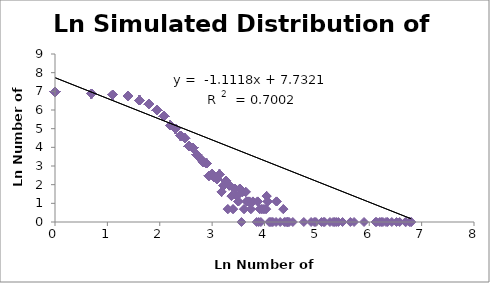
| Category | LnSimulated Number of Athletes |
|---|---|
| 6.8 | 0 |
| 6.8 | 0 |
| 6.77 | 0 |
| 6.7 | 0 |
| 6.69 | 0 |
| 6.58 | 0 |
| 6.52 | 0 |
| 6.43 | 0 |
| 6.35 | 0 |
| 6.32 | 0 |
| 6.26 | 0 |
| 6.23 | 0 |
| 6.2 | 0 |
| 6.14 | 0 |
| 6.12 | 0 |
| 5.9 | 0 |
| 5.71 | 0 |
| 5.64 | 0 |
| 5.49 | 0 |
| 5.41 | 0 |
| 5.37 | 0 |
| 5.34 | 0 |
| 5.31 | 0 |
| 5.25 | 0 |
| 5.15 | 0 |
| 5.13 | 0 |
| 5.09 | 0 |
| 4.98 | 0 |
| 4.95 | 0 |
| 4.89 | 0 |
| 4.75 | 0 |
| 4.54 | 0 |
| 4.47 | 0 |
| 4.45 | 0 |
| 4.44 | 0 |
| 4.43 | 0 |
| 4.41 | 0 |
| 4.38 | 0 |
| 4.36 | 0.69 |
| 4.36 | 0.69 |
| 4.3 | 0 |
| 4.23 | 1.1 |
| 4.23 | 1.1 |
| 4.23 | 1.1 |
| 4.22 | 0 |
| 4.16 | 0 |
| 4.14 | 0 |
| 4.11 | 0 |
| 4.09 | 0 |
| 4.06 | 1.1 |
| 4.06 | 1.1 |
| 4.06 | 1.1 |
| 4.04 | 1.39 |
| 4.04 | 1.39 |
| 4.04 | 1.39 |
| 4.04 | 1.39 |
| 4.03 | 0.69 |
| 4.03 | 0.69 |
| 3.99 | 0.69 |
| 3.99 | 0.69 |
| 3.95 | 0.69 |
| 3.95 | 0.69 |
| 3.93 | 0 |
| 3.91 | 0.69 |
| 3.91 | 0.69 |
| 3.89 | 0 |
| 3.87 | 1.1 |
| 3.87 | 1.1 |
| 3.87 | 1.1 |
| 3.85 | 0 |
| 3.78 | 1.1 |
| 3.78 | 1.1 |
| 3.78 | 1.1 |
| 3.74 | 0.69 |
| 3.74 | 0.69 |
| 3.71 | 1.1 |
| 3.71 | 1.1 |
| 3.71 | 1.1 |
| 3.69 | 1.1 |
| 3.69 | 1.1 |
| 3.69 | 1.1 |
| 3.66 | 1.1 |
| 3.66 | 1.1 |
| 3.66 | 1.1 |
| 3.64 | 1.61 |
| 3.64 | 1.61 |
| 3.64 | 1.61 |
| 3.64 | 1.61 |
| 3.64 | 1.61 |
| 3.61 | 0.69 |
| 3.61 | 0.69 |
| 3.58 | 1.61 |
| 3.58 | 1.61 |
| 3.58 | 1.61 |
| 3.58 | 1.61 |
| 3.58 | 1.61 |
| 3.56 | 0 |
| 3.53 | 1.79 |
| 3.53 | 1.79 |
| 3.53 | 1.79 |
| 3.53 | 1.79 |
| 3.53 | 1.79 |
| 3.53 | 1.79 |
| 3.5 | 1.1 |
| 3.5 | 1.1 |
| 3.5 | 1.1 |
| 3.47 | 1.39 |
| 3.47 | 1.39 |
| 3.47 | 1.39 |
| 3.47 | 1.39 |
| 3.43 | 1.79 |
| 3.43 | 1.79 |
| 3.43 | 1.79 |
| 3.43 | 1.79 |
| 3.43 | 1.79 |
| 3.43 | 1.79 |
| 3.4 | 0.69 |
| 3.4 | 0.69 |
| 3.37 | 1.39 |
| 3.37 | 1.39 |
| 3.37 | 1.39 |
| 3.37 | 1.39 |
| 3.33 | 1.95 |
| 3.33 | 1.95 |
| 3.33 | 1.95 |
| 3.33 | 1.95 |
| 3.33 | 1.95 |
| 3.33 | 1.95 |
| 3.33 | 1.95 |
| 3.3 | 0.69 |
| 3.3 | 0.69 |
| 3.26 | 2.2 |
| 3.26 | 2.2 |
| 3.26 | 2.2 |
| 3.26 | 2.2 |
| 3.26 | 2.2 |
| 3.26 | 2.2 |
| 3.26 | 2.2 |
| 3.26 | 2.2 |
| 3.26 | 2.2 |
| 3.22 | 1.95 |
| 3.22 | 1.95 |
| 3.22 | 1.95 |
| 3.22 | 1.95 |
| 3.22 | 1.95 |
| 3.22 | 1.95 |
| 3.22 | 1.95 |
| 3.18 | 1.61 |
| 3.18 | 1.61 |
| 3.18 | 1.61 |
| 3.18 | 1.61 |
| 3.18 | 1.61 |
| 3.14 | 2.56 |
| 3.14 | 2.56 |
| 3.14 | 2.56 |
| 3.14 | 2.56 |
| 3.14 | 2.56 |
| 3.14 | 2.56 |
| 3.14 | 2.56 |
| 3.14 | 2.56 |
| 3.14 | 2.56 |
| 3.14 | 2.56 |
| 3.14 | 2.56 |
| 3.14 | 2.56 |
| 3.14 | 2.56 |
| 3.09 | 2.3 |
| 3.09 | 2.3 |
| 3.09 | 2.3 |
| 3.09 | 2.3 |
| 3.09 | 2.3 |
| 3.09 | 2.3 |
| 3.09 | 2.3 |
| 3.09 | 2.3 |
| 3.09 | 2.3 |
| 3.09 | 2.3 |
| 3.04 | 2.4 |
| 3.04 | 2.4 |
| 3.04 | 2.4 |
| 3.04 | 2.4 |
| 3.04 | 2.4 |
| 3.04 | 2.4 |
| 3.04 | 2.4 |
| 3.04 | 2.4 |
| 3.04 | 2.4 |
| 3.04 | 2.4 |
| 3.04 | 2.4 |
| 3.0 | 2.56 |
| 3.0 | 2.56 |
| 3.0 | 2.56 |
| 3.0 | 2.56 |
| 3.0 | 2.56 |
| 3.0 | 2.56 |
| 3.0 | 2.56 |
| 3.0 | 2.56 |
| 3.0 | 2.56 |
| 3.0 | 2.56 |
| 3.0 | 2.56 |
| 3.0 | 2.56 |
| 3.0 | 2.56 |
| 2.94 | 2.48 |
| 2.94 | 2.48 |
| 2.94 | 2.48 |
| 2.94 | 2.48 |
| 2.94 | 2.48 |
| 2.94 | 2.48 |
| 2.94 | 2.48 |
| 2.94 | 2.48 |
| 2.94 | 2.48 |
| 2.94 | 2.48 |
| 2.94 | 2.48 |
| 2.94 | 2.48 |
| 2.89 | 3.14 |
| 2.89 | 3.14 |
| 2.89 | 3.14 |
| 2.89 | 3.14 |
| 2.89 | 3.14 |
| 2.89 | 3.14 |
| 2.89 | 3.14 |
| 2.89 | 3.14 |
| 2.89 | 3.14 |
| 2.89 | 3.14 |
| 2.89 | 3.14 |
| 2.89 | 3.14 |
| 2.89 | 3.14 |
| 2.89 | 3.14 |
| 2.89 | 3.14 |
| 2.89 | 3.14 |
| 2.89 | 3.14 |
| 2.89 | 3.14 |
| 2.89 | 3.14 |
| 2.89 | 3.14 |
| 2.89 | 3.14 |
| 2.89 | 3.14 |
| 2.89 | 3.14 |
| 2.83 | 3.22 |
| 2.83 | 3.22 |
| 2.83 | 3.22 |
| 2.83 | 3.22 |
| 2.83 | 3.22 |
| 2.83 | 3.22 |
| 2.83 | 3.22 |
| 2.83 | 3.22 |
| 2.83 | 3.22 |
| 2.83 | 3.22 |
| 2.83 | 3.22 |
| 2.83 | 3.22 |
| 2.83 | 3.22 |
| 2.83 | 3.22 |
| 2.83 | 3.22 |
| 2.83 | 3.22 |
| 2.83 | 3.22 |
| 2.83 | 3.22 |
| 2.83 | 3.22 |
| 2.83 | 3.22 |
| 2.83 | 3.22 |
| 2.83 | 3.22 |
| 2.83 | 3.22 |
| 2.83 | 3.22 |
| 2.83 | 3.22 |
| 2.77 | 3.4 |
| 2.77 | 3.4 |
| 2.77 | 3.4 |
| 2.77 | 3.4 |
| 2.77 | 3.4 |
| 2.77 | 3.4 |
| 2.77 | 3.4 |
| 2.77 | 3.4 |
| 2.77 | 3.4 |
| 2.77 | 3.4 |
| 2.77 | 3.4 |
| 2.77 | 3.4 |
| 2.77 | 3.4 |
| 2.77 | 3.4 |
| 2.77 | 3.4 |
| 2.77 | 3.4 |
| 2.77 | 3.4 |
| 2.77 | 3.4 |
| 2.77 | 3.4 |
| 2.77 | 3.4 |
| 2.77 | 3.4 |
| 2.77 | 3.4 |
| 2.77 | 3.4 |
| 2.77 | 3.4 |
| 2.77 | 3.4 |
| 2.77 | 3.4 |
| 2.77 | 3.4 |
| 2.77 | 3.4 |
| 2.77 | 3.4 |
| 2.77 | 3.4 |
| 2.71 | 3.61 |
| 2.71 | 3.61 |
| 2.71 | 3.61 |
| 2.71 | 3.61 |
| 2.71 | 3.61 |
| 2.71 | 3.61 |
| 2.71 | 3.61 |
| 2.71 | 3.61 |
| 2.71 | 3.61 |
| 2.71 | 3.61 |
| 2.71 | 3.61 |
| 2.71 | 3.61 |
| 2.71 | 3.61 |
| 2.71 | 3.61 |
| 2.71 | 3.61 |
| 2.71 | 3.61 |
| 2.71 | 3.61 |
| 2.71 | 3.61 |
| 2.71 | 3.61 |
| 2.71 | 3.61 |
| 2.71 | 3.61 |
| 2.71 | 3.61 |
| 2.71 | 3.61 |
| 2.71 | 3.61 |
| 2.71 | 3.61 |
| 2.71 | 3.61 |
| 2.71 | 3.61 |
| 2.71 | 3.61 |
| 2.71 | 3.61 |
| 2.71 | 3.61 |
| 2.71 | 3.61 |
| 2.71 | 3.61 |
| 2.71 | 3.61 |
| 2.71 | 3.61 |
| 2.71 | 3.61 |
| 2.71 | 3.61 |
| 2.71 | 3.61 |
| 2.64 | 3.97 |
| 2.64 | 3.97 |
| 2.64 | 3.97 |
| 2.64 | 3.97 |
| 2.64 | 3.97 |
| 2.64 | 3.97 |
| 2.64 | 3.97 |
| 2.64 | 3.97 |
| 2.64 | 3.97 |
| 2.64 | 3.97 |
| 2.64 | 3.97 |
| 2.64 | 3.97 |
| 2.64 | 3.97 |
| 2.64 | 3.97 |
| 2.64 | 3.97 |
| 2.64 | 3.97 |
| 2.64 | 3.97 |
| 2.64 | 3.97 |
| 2.64 | 3.97 |
| 2.64 | 3.97 |
| 2.64 | 3.97 |
| 2.64 | 3.97 |
| 2.64 | 3.97 |
| 2.64 | 3.97 |
| 2.64 | 3.97 |
| 2.64 | 3.97 |
| 2.64 | 3.97 |
| 2.64 | 3.97 |
| 2.64 | 3.97 |
| 2.64 | 3.97 |
| 2.64 | 3.97 |
| 2.64 | 3.97 |
| 2.64 | 3.97 |
| 2.64 | 3.97 |
| 2.64 | 3.97 |
| 2.64 | 3.97 |
| 2.64 | 3.97 |
| 2.64 | 3.97 |
| 2.64 | 3.97 |
| 2.64 | 3.97 |
| 2.64 | 3.97 |
| 2.64 | 3.97 |
| 2.64 | 3.97 |
| 2.64 | 3.97 |
| 2.64 | 3.97 |
| 2.64 | 3.97 |
| 2.64 | 3.97 |
| 2.64 | 3.97 |
| 2.64 | 3.97 |
| 2.64 | 3.97 |
| 2.64 | 3.97 |
| 2.64 | 3.97 |
| 2.64 | 3.97 |
| 2.56 | 4.06 |
| 2.56 | 4.06 |
| 2.56 | 4.06 |
| 2.56 | 4.06 |
| 2.56 | 4.06 |
| 2.56 | 4.06 |
| 2.56 | 4.06 |
| 2.56 | 4.06 |
| 2.56 | 4.06 |
| 2.56 | 4.06 |
| 2.56 | 4.06 |
| 2.56 | 4.06 |
| 2.56 | 4.06 |
| 2.56 | 4.06 |
| 2.56 | 4.06 |
| 2.56 | 4.06 |
| 2.56 | 4.06 |
| 2.56 | 4.06 |
| 2.56 | 4.06 |
| 2.56 | 4.06 |
| 2.56 | 4.06 |
| 2.56 | 4.06 |
| 2.56 | 4.06 |
| 2.56 | 4.06 |
| 2.56 | 4.06 |
| 2.56 | 4.06 |
| 2.56 | 4.06 |
| 2.56 | 4.06 |
| 2.56 | 4.06 |
| 2.56 | 4.06 |
| 2.56 | 4.06 |
| 2.56 | 4.06 |
| 2.56 | 4.06 |
| 2.56 | 4.06 |
| 2.56 | 4.06 |
| 2.56 | 4.06 |
| 2.56 | 4.06 |
| 2.56 | 4.06 |
| 2.56 | 4.06 |
| 2.56 | 4.06 |
| 2.56 | 4.06 |
| 2.56 | 4.06 |
| 2.56 | 4.06 |
| 2.56 | 4.06 |
| 2.56 | 4.06 |
| 2.56 | 4.06 |
| 2.56 | 4.06 |
| 2.56 | 4.06 |
| 2.56 | 4.06 |
| 2.56 | 4.06 |
| 2.56 | 4.06 |
| 2.56 | 4.06 |
| 2.56 | 4.06 |
| 2.56 | 4.06 |
| 2.56 | 4.06 |
| 2.56 | 4.06 |
| 2.56 | 4.06 |
| 2.56 | 4.06 |
| 2.48 | 4.48 |
| 2.48 | 4.48 |
| 2.48 | 4.48 |
| 2.48 | 4.48 |
| 2.48 | 4.48 |
| 2.48 | 4.48 |
| 2.48 | 4.48 |
| 2.48 | 4.48 |
| 2.48 | 4.48 |
| 2.48 | 4.48 |
| 2.48 | 4.48 |
| 2.48 | 4.48 |
| 2.48 | 4.48 |
| 2.48 | 4.48 |
| 2.48 | 4.48 |
| 2.48 | 4.48 |
| 2.48 | 4.48 |
| 2.48 | 4.48 |
| 2.48 | 4.48 |
| 2.48 | 4.48 |
| 2.48 | 4.48 |
| 2.48 | 4.48 |
| 2.48 | 4.48 |
| 2.48 | 4.48 |
| 2.48 | 4.48 |
| 2.48 | 4.48 |
| 2.48 | 4.48 |
| 2.48 | 4.48 |
| 2.48 | 4.48 |
| 2.48 | 4.48 |
| 2.48 | 4.48 |
| 2.48 | 4.48 |
| 2.48 | 4.48 |
| 2.48 | 4.48 |
| 2.48 | 4.48 |
| 2.48 | 4.48 |
| 2.48 | 4.48 |
| 2.48 | 4.48 |
| 2.48 | 4.48 |
| 2.48 | 4.48 |
| 2.48 | 4.48 |
| 2.48 | 4.48 |
| 2.48 | 4.48 |
| 2.48 | 4.48 |
| 2.48 | 4.48 |
| 2.48 | 4.48 |
| 2.48 | 4.48 |
| 2.48 | 4.48 |
| 2.48 | 4.48 |
| 2.48 | 4.48 |
| 2.48 | 4.48 |
| 2.48 | 4.48 |
| 2.48 | 4.48 |
| 2.48 | 4.48 |
| 2.48 | 4.48 |
| 2.48 | 4.48 |
| 2.48 | 4.48 |
| 2.48 | 4.48 |
| 2.48 | 4.48 |
| 2.48 | 4.48 |
| 2.48 | 4.48 |
| 2.48 | 4.48 |
| 2.48 | 4.48 |
| 2.48 | 4.48 |
| 2.48 | 4.48 |
| 2.48 | 4.48 |
| 2.48 | 4.48 |
| 2.48 | 4.48 |
| 2.48 | 4.48 |
| 2.48 | 4.48 |
| 2.48 | 4.48 |
| 2.48 | 4.48 |
| 2.48 | 4.48 |
| 2.48 | 4.48 |
| 2.48 | 4.48 |
| 2.48 | 4.48 |
| 2.48 | 4.48 |
| 2.48 | 4.48 |
| 2.48 | 4.48 |
| 2.48 | 4.48 |
| 2.48 | 4.48 |
| 2.48 | 4.48 |
| 2.48 | 4.48 |
| 2.48 | 4.48 |
| 2.48 | 4.48 |
| 2.48 | 4.48 |
| 2.48 | 4.48 |
| 2.48 | 4.48 |
| 2.4 | 4.62 |
| 2.4 | 4.62 |
| 2.4 | 4.62 |
| 2.4 | 4.62 |
| 2.4 | 4.62 |
| 2.4 | 4.62 |
| 2.4 | 4.62 |
| 2.4 | 4.62 |
| 2.4 | 4.62 |
| 2.4 | 4.62 |
| 2.4 | 4.62 |
| 2.4 | 4.62 |
| 2.4 | 4.62 |
| 2.4 | 4.62 |
| 2.4 | 4.62 |
| 2.4 | 4.62 |
| 2.4 | 4.62 |
| 2.4 | 4.62 |
| 2.4 | 4.62 |
| 2.4 | 4.62 |
| 2.4 | 4.62 |
| 2.4 | 4.62 |
| 2.4 | 4.62 |
| 2.4 | 4.62 |
| 2.4 | 4.62 |
| 2.4 | 4.62 |
| 2.4 | 4.62 |
| 2.4 | 4.62 |
| 2.4 | 4.62 |
| 2.4 | 4.62 |
| 2.4 | 4.62 |
| 2.4 | 4.62 |
| 2.4 | 4.62 |
| 2.4 | 4.62 |
| 2.4 | 4.62 |
| 2.4 | 4.62 |
| 2.4 | 4.62 |
| 2.4 | 4.62 |
| 2.4 | 4.62 |
| 2.4 | 4.62 |
| 2.4 | 4.62 |
| 2.4 | 4.62 |
| 2.4 | 4.62 |
| 2.4 | 4.62 |
| 2.4 | 4.62 |
| 2.4 | 4.62 |
| 2.4 | 4.62 |
| 2.4 | 4.62 |
| 2.4 | 4.62 |
| 2.4 | 4.62 |
| 2.4 | 4.62 |
| 2.4 | 4.62 |
| 2.4 | 4.62 |
| 2.4 | 4.62 |
| 2.4 | 4.62 |
| 2.4 | 4.62 |
| 2.4 | 4.62 |
| 2.4 | 4.62 |
| 2.4 | 4.62 |
| 2.4 | 4.62 |
| 2.4 | 4.62 |
| 2.4 | 4.62 |
| 2.4 | 4.62 |
| 2.4 | 4.62 |
| 2.4 | 4.62 |
| 2.4 | 4.62 |
| 2.4 | 4.62 |
| 2.4 | 4.62 |
| 2.4 | 4.62 |
| 2.4 | 4.62 |
| 2.4 | 4.62 |
| 2.4 | 4.62 |
| 2.4 | 4.62 |
| 2.4 | 4.62 |
| 2.4 | 4.62 |
| 2.4 | 4.62 |
| 2.4 | 4.62 |
| 2.4 | 4.62 |
| 2.4 | 4.62 |
| 2.4 | 4.62 |
| 2.4 | 4.62 |
| 2.4 | 4.62 |
| 2.4 | 4.62 |
| 2.4 | 4.62 |
| 2.4 | 4.62 |
| 2.4 | 4.62 |
| 2.4 | 4.62 |
| 2.4 | 4.62 |
| 2.4 | 4.62 |
| 2.4 | 4.62 |
| 2.4 | 4.62 |
| 2.4 | 4.62 |
| 2.4 | 4.62 |
| 2.4 | 4.62 |
| 2.4 | 4.62 |
| 2.4 | 4.62 |
| 2.4 | 4.62 |
| 2.4 | 4.62 |
| 2.4 | 4.62 |
| 2.4 | 4.62 |
| 2.4 | 4.62 |
| 2.3 | 4.99 |
| 2.3 | 4.99 |
| 2.3 | 4.99 |
| 2.3 | 4.99 |
| 2.3 | 4.99 |
| 2.3 | 4.99 |
| 2.3 | 4.99 |
| 2.3 | 4.99 |
| 2.3 | 4.99 |
| 2.3 | 4.99 |
| 2.3 | 4.99 |
| 2.3 | 4.99 |
| 2.3 | 4.99 |
| 2.3 | 4.99 |
| 2.3 | 4.99 |
| 2.3 | 4.99 |
| 2.3 | 4.99 |
| 2.3 | 4.99 |
| 2.3 | 4.99 |
| 2.3 | 4.99 |
| 2.3 | 4.99 |
| 2.3 | 4.99 |
| 2.3 | 4.99 |
| 2.3 | 4.99 |
| 2.3 | 4.99 |
| 2.3 | 4.99 |
| 2.3 | 4.99 |
| 2.3 | 4.99 |
| 2.3 | 4.99 |
| 2.3 | 4.99 |
| 2.3 | 4.99 |
| 2.3 | 4.99 |
| 2.3 | 4.99 |
| 2.3 | 4.99 |
| 2.3 | 4.99 |
| 2.3 | 4.99 |
| 2.3 | 4.99 |
| 2.3 | 4.99 |
| 2.3 | 4.99 |
| 2.3 | 4.99 |
| 2.3 | 4.99 |
| 2.3 | 4.99 |
| 2.3 | 4.99 |
| 2.3 | 4.99 |
| 2.3 | 4.99 |
| 2.3 | 4.99 |
| 2.3 | 4.99 |
| 2.3 | 4.99 |
| 2.3 | 4.99 |
| 2.3 | 4.99 |
| 2.3 | 4.99 |
| 2.3 | 4.99 |
| 2.3 | 4.99 |
| 2.3 | 4.99 |
| 2.3 | 4.99 |
| 2.3 | 4.99 |
| 2.3 | 4.99 |
| 2.3 | 4.99 |
| 2.3 | 4.99 |
| 2.3 | 4.99 |
| 2.3 | 4.99 |
| 2.3 | 4.99 |
| 2.3 | 4.99 |
| 2.3 | 4.99 |
| 2.3 | 4.99 |
| 2.3 | 4.99 |
| 2.3 | 4.99 |
| 2.3 | 4.99 |
| 2.3 | 4.99 |
| 2.3 | 4.99 |
| 2.3 | 4.99 |
| 2.3 | 4.99 |
| 2.3 | 4.99 |
| 2.3 | 4.99 |
| 2.3 | 4.99 |
| 2.3 | 4.99 |
| 2.3 | 4.99 |
| 2.3 | 4.99 |
| 2.3 | 4.99 |
| 2.3 | 4.99 |
| 2.3 | 4.99 |
| 2.3 | 4.99 |
| 2.3 | 4.99 |
| 2.3 | 4.99 |
| 2.3 | 4.99 |
| 2.3 | 4.99 |
| 2.3 | 4.99 |
| 2.3 | 4.99 |
| 2.3 | 4.99 |
| 2.3 | 4.99 |
| 2.3 | 4.99 |
| 2.3 | 4.99 |
| 2.3 | 4.99 |
| 2.3 | 4.99 |
| 2.3 | 4.99 |
| 2.3 | 4.99 |
| 2.3 | 4.99 |
| 2.3 | 4.99 |
| 2.3 | 4.99 |
| 2.3 | 4.99 |
| 2.3 | 4.99 |
| 2.3 | 4.99 |
| 2.3 | 4.99 |
| 2.3 | 4.99 |
| 2.3 | 4.99 |
| 2.3 | 4.99 |
| 2.3 | 4.99 |
| 2.3 | 4.99 |
| 2.3 | 4.99 |
| 2.3 | 4.99 |
| 2.3 | 4.99 |
| 2.3 | 4.99 |
| 2.3 | 4.99 |
| 2.3 | 4.99 |
| 2.3 | 4.99 |
| 2.3 | 4.99 |
| 2.3 | 4.99 |
| 2.3 | 4.99 |
| 2.3 | 4.99 |
| 2.3 | 4.99 |
| 2.3 | 4.99 |
| 2.3 | 4.99 |
| 2.3 | 4.99 |
| 2.3 | 4.99 |
| 2.3 | 4.99 |
| 2.3 | 4.99 |
| 2.3 | 4.99 |
| 2.3 | 4.99 |
| 2.3 | 4.99 |
| 2.3 | 4.99 |
| 2.3 | 4.99 |
| 2.3 | 4.99 |
| 2.3 | 4.99 |
| 2.3 | 4.99 |
| 2.3 | 4.99 |
| 2.3 | 4.99 |
| 2.3 | 4.99 |
| 2.3 | 4.99 |
| 2.3 | 4.99 |
| 2.3 | 4.99 |
| 2.3 | 4.99 |
| 2.3 | 4.99 |
| 2.3 | 4.99 |
| 2.3 | 4.99 |
| 2.3 | 4.99 |
| 2.3 | 4.99 |
| 2.3 | 4.99 |
| 2.2 | 5.18 |
| 2.2 | 5.18 |
| 2.2 | 5.18 |
| 2.2 | 5.18 |
| 2.2 | 5.18 |
| 2.2 | 5.18 |
| 2.2 | 5.18 |
| 2.2 | 5.18 |
| 2.2 | 5.18 |
| 2.2 | 5.18 |
| 2.2 | 5.18 |
| 2.2 | 5.18 |
| 2.2 | 5.18 |
| 2.2 | 5.18 |
| 2.2 | 5.18 |
| 2.2 | 5.18 |
| 2.2 | 5.18 |
| 2.2 | 5.18 |
| 2.2 | 5.18 |
| 2.2 | 5.18 |
| 2.2 | 5.18 |
| 2.2 | 5.18 |
| 2.2 | 5.18 |
| 2.2 | 5.18 |
| 2.2 | 5.18 |
| 2.2 | 5.18 |
| 2.2 | 5.18 |
| 2.2 | 5.18 |
| 2.2 | 5.18 |
| 2.2 | 5.18 |
| 2.2 | 5.18 |
| 2.2 | 5.18 |
| 2.2 | 5.18 |
| 2.2 | 5.18 |
| 2.2 | 5.18 |
| 2.2 | 5.18 |
| 2.2 | 5.18 |
| 2.2 | 5.18 |
| 2.2 | 5.18 |
| 2.2 | 5.18 |
| 2.2 | 5.18 |
| 2.2 | 5.18 |
| 2.2 | 5.18 |
| 2.2 | 5.18 |
| 2.2 | 5.18 |
| 2.2 | 5.18 |
| 2.2 | 5.18 |
| 2.2 | 5.18 |
| 2.2 | 5.18 |
| 2.2 | 5.18 |
| 2.2 | 5.18 |
| 2.2 | 5.18 |
| 2.2 | 5.18 |
| 2.2 | 5.18 |
| 2.2 | 5.18 |
| 2.2 | 5.18 |
| 2.2 | 5.18 |
| 2.2 | 5.18 |
| 2.2 | 5.18 |
| 2.2 | 5.18 |
| 2.2 | 5.18 |
| 2.2 | 5.18 |
| 2.2 | 5.18 |
| 2.2 | 5.18 |
| 2.2 | 5.18 |
| 2.2 | 5.18 |
| 2.2 | 5.18 |
| 2.2 | 5.18 |
| 2.2 | 5.18 |
| 2.2 | 5.18 |
| 2.2 | 5.18 |
| 2.2 | 5.18 |
| 2.2 | 5.18 |
| 2.2 | 5.18 |
| 2.2 | 5.18 |
| 2.2 | 5.18 |
| 2.2 | 5.18 |
| 2.2 | 5.18 |
| 2.2 | 5.18 |
| 2.2 | 5.18 |
| 2.2 | 5.18 |
| 2.2 | 5.18 |
| 2.2 | 5.18 |
| 2.2 | 5.18 |
| 2.2 | 5.18 |
| 2.2 | 5.18 |
| 2.2 | 5.18 |
| 2.2 | 5.18 |
| 2.2 | 5.18 |
| 2.2 | 5.18 |
| 2.2 | 5.18 |
| 2.2 | 5.18 |
| 2.2 | 5.18 |
| 2.2 | 5.18 |
| 2.2 | 5.18 |
| 2.2 | 5.18 |
| 2.2 | 5.18 |
| 2.2 | 5.18 |
| 2.2 | 5.18 |
| 2.2 | 5.18 |
| 2.2 | 5.18 |
| 2.2 | 5.18 |
| 2.2 | 5.18 |
| 2.2 | 5.18 |
| 2.2 | 5.18 |
| 2.2 | 5.18 |
| 2.2 | 5.18 |
| 2.2 | 5.18 |
| 2.2 | 5.18 |
| 2.2 | 5.18 |
| 2.2 | 5.18 |
| 2.2 | 5.18 |
| 2.2 | 5.18 |
| 2.2 | 5.18 |
| 2.2 | 5.18 |
| 2.2 | 5.18 |
| 2.2 | 5.18 |
| 2.2 | 5.18 |
| 2.2 | 5.18 |
| 2.2 | 5.18 |
| 2.2 | 5.18 |
| 2.2 | 5.18 |
| 2.2 | 5.18 |
| 2.2 | 5.18 |
| 2.2 | 5.18 |
| 2.2 | 5.18 |
| 2.2 | 5.18 |
| 2.2 | 5.18 |
| 2.2 | 5.18 |
| 2.2 | 5.18 |
| 2.2 | 5.18 |
| 2.2 | 5.18 |
| 2.2 | 5.18 |
| 2.2 | 5.18 |
| 2.2 | 5.18 |
| 2.2 | 5.18 |
| 2.2 | 5.18 |
| 2.2 | 5.18 |
| 2.2 | 5.18 |
| 2.2 | 5.18 |
| 2.2 | 5.18 |
| 2.2 | 5.18 |
| 2.2 | 5.18 |
| 2.2 | 5.18 |
| 2.2 | 5.18 |
| 2.2 | 5.18 |
| 2.2 | 5.18 |
| 2.2 | 5.18 |
| 2.2 | 5.18 |
| 2.2 | 5.18 |
| 2.2 | 5.18 |
| 2.2 | 5.18 |
| 2.2 | 5.18 |
| 2.2 | 5.18 |
| 2.2 | 5.18 |
| 2.2 | 5.18 |
| 2.2 | 5.18 |
| 2.2 | 5.18 |
| 2.2 | 5.18 |
| 2.2 | 5.18 |
| 2.2 | 5.18 |
| 2.2 | 5.18 |
| 2.2 | 5.18 |
| 2.2 | 5.18 |
| 2.2 | 5.18 |
| 2.2 | 5.18 |
| 2.2 | 5.18 |
| 2.2 | 5.18 |
| 2.2 | 5.18 |
| 2.2 | 5.18 |
| 2.2 | 5.18 |
| 2.2 | 5.18 |
| 2.2 | 5.18 |
| 2.2 | 5.18 |
| 2.2 | 5.18 |
| 2.2 | 5.18 |
| 2.2 | 5.18 |
| 2.08 | 5.66 |
| 2.08 | 5.66 |
| 2.08 | 5.66 |
| 2.08 | 5.66 |
| 2.08 | 5.66 |
| 2.08 | 5.66 |
| 2.08 | 5.66 |
| 2.08 | 5.66 |
| 2.08 | 5.66 |
| 2.08 | 5.66 |
| 2.08 | 5.66 |
| 2.08 | 5.66 |
| 2.08 | 5.66 |
| 2.08 | 5.66 |
| 2.08 | 5.66 |
| 2.08 | 5.66 |
| 2.08 | 5.66 |
| 2.08 | 5.66 |
| 2.08 | 5.66 |
| 2.08 | 5.66 |
| 2.08 | 5.66 |
| 2.08 | 5.66 |
| 2.08 | 5.66 |
| 2.08 | 5.66 |
| 2.08 | 5.66 |
| 2.08 | 5.66 |
| 2.08 | 5.66 |
| 2.08 | 5.66 |
| 2.08 | 5.66 |
| 2.08 | 5.66 |
| 2.08 | 5.66 |
| 2.08 | 5.66 |
| 2.08 | 5.66 |
| 2.08 | 5.66 |
| 2.08 | 5.66 |
| 2.08 | 5.66 |
| 2.08 | 5.66 |
| 2.08 | 5.66 |
| 2.08 | 5.66 |
| 2.08 | 5.66 |
| 2.08 | 5.66 |
| 2.08 | 5.66 |
| 2.08 | 5.66 |
| 2.08 | 5.66 |
| 2.08 | 5.66 |
| 2.08 | 5.66 |
| 2.08 | 5.66 |
| 2.08 | 5.66 |
| 2.08 | 5.66 |
| 2.08 | 5.66 |
| 2.08 | 5.66 |
| 2.08 | 5.66 |
| 2.08 | 5.66 |
| 2.08 | 5.66 |
| 2.08 | 5.66 |
| 2.08 | 5.66 |
| 2.08 | 5.66 |
| 2.08 | 5.66 |
| 2.08 | 5.66 |
| 2.08 | 5.66 |
| 2.08 | 5.66 |
| 2.08 | 5.66 |
| 2.08 | 5.66 |
| 2.08 | 5.66 |
| 2.08 | 5.66 |
| 2.08 | 5.66 |
| 2.08 | 5.66 |
| 2.08 | 5.66 |
| 2.08 | 5.66 |
| 2.08 | 5.66 |
| 2.08 | 5.66 |
| 2.08 | 5.66 |
| 2.08 | 5.66 |
| 2.08 | 5.66 |
| 2.08 | 5.66 |
| 2.08 | 5.66 |
| 2.08 | 5.66 |
| 2.08 | 5.66 |
| 2.08 | 5.66 |
| 2.08 | 5.66 |
| 2.08 | 5.66 |
| 2.08 | 5.66 |
| 2.08 | 5.66 |
| 2.08 | 5.66 |
| 2.08 | 5.66 |
| 2.08 | 5.66 |
| 2.08 | 5.66 |
| 2.08 | 5.66 |
| 2.08 | 5.66 |
| 2.08 | 5.66 |
| 2.08 | 5.66 |
| 2.08 | 5.66 |
| 2.08 | 5.66 |
| 2.08 | 5.66 |
| 2.08 | 5.66 |
| 2.08 | 5.66 |
| 2.08 | 5.66 |
| 2.08 | 5.66 |
| 2.08 | 5.66 |
| 2.08 | 5.66 |
| 2.08 | 5.66 |
| 2.08 | 5.66 |
| 2.08 | 5.66 |
| 2.08 | 5.66 |
| 2.08 | 5.66 |
| 2.08 | 5.66 |
| 2.08 | 5.66 |
| 2.08 | 5.66 |
| 2.08 | 5.66 |
| 2.08 | 5.66 |
| 2.08 | 5.66 |
| 2.08 | 5.66 |
| 2.08 | 5.66 |
| 2.08 | 5.66 |
| 2.08 | 5.66 |
| 2.08 | 5.66 |
| 2.08 | 5.66 |
| 2.08 | 5.66 |
| 2.08 | 5.66 |
| 2.08 | 5.66 |
| 2.08 | 5.66 |
| 2.08 | 5.66 |
| 2.08 | 5.66 |
| 2.08 | 5.66 |
| 2.08 | 5.66 |
| 2.08 | 5.66 |
| 2.08 | 5.66 |
| 2.08 | 5.66 |
| 2.08 | 5.66 |
| 2.08 | 5.66 |
| 2.08 | 5.66 |
| 2.08 | 5.66 |
| 2.08 | 5.66 |
| 2.08 | 5.66 |
| 2.08 | 5.66 |
| 2.08 | 5.66 |
| 2.08 | 5.66 |
| 2.08 | 5.66 |
| 2.08 | 5.66 |
| 2.08 | 5.66 |
| 2.08 | 5.66 |
| 2.08 | 5.66 |
| 2.08 | 5.66 |
| 2.08 | 5.66 |
| 2.08 | 5.66 |
| 2.08 | 5.66 |
| 2.08 | 5.66 |
| 2.08 | 5.66 |
| 2.08 | 5.66 |
| 2.08 | 5.66 |
| 2.08 | 5.66 |
| 2.08 | 5.66 |
| 2.08 | 5.66 |
| 2.08 | 5.66 |
| 2.08 | 5.66 |
| 2.08 | 5.66 |
| 2.08 | 5.66 |
| 2.08 | 5.66 |
| 2.08 | 5.66 |
| 2.08 | 5.66 |
| 2.08 | 5.66 |
| 2.08 | 5.66 |
| 2.08 | 5.66 |
| 2.08 | 5.66 |
| 2.08 | 5.66 |
| 2.08 | 5.66 |
| 2.08 | 5.66 |
| 2.08 | 5.66 |
| 2.08 | 5.66 |
| 2.08 | 5.66 |
| 2.08 | 5.66 |
| 2.08 | 5.66 |
| 2.08 | 5.66 |
| 2.08 | 5.66 |
| 2.08 | 5.66 |
| 2.08 | 5.66 |
| 2.08 | 5.66 |
| 2.08 | 5.66 |
| 2.08 | 5.66 |
| 2.08 | 5.66 |
| 2.08 | 5.66 |
| 2.08 | 5.66 |
| 2.08 | 5.66 |
| 2.08 | 5.66 |
| 2.08 | 5.66 |
| 2.08 | 5.66 |
| 2.08 | 5.66 |
| 2.08 | 5.66 |
| 2.08 | 5.66 |
| 2.08 | 5.66 |
| 2.08 | 5.66 |
| 2.08 | 5.66 |
| 2.08 | 5.66 |
| 2.08 | 5.66 |
| 2.08 | 5.66 |
| 2.08 | 5.66 |
| 2.08 | 5.66 |
| 2.08 | 5.66 |
| 2.08 | 5.66 |
| 2.08 | 5.66 |
| 2.08 | 5.66 |
| 2.08 | 5.66 |
| 2.08 | 5.66 |
| 2.08 | 5.66 |
| 2.08 | 5.66 |
| 2.08 | 5.66 |
| 2.08 | 5.66 |
| 2.08 | 5.66 |
| 2.08 | 5.66 |
| 2.08 | 5.66 |
| 2.08 | 5.66 |
| 2.08 | 5.66 |
| 2.08 | 5.66 |
| 2.08 | 5.66 |
| 2.08 | 5.66 |
| 2.08 | 5.66 |
| 2.08 | 5.66 |
| 2.08 | 5.66 |
| 2.08 | 5.66 |
| 2.08 | 5.66 |
| 2.08 | 5.66 |
| 2.08 | 5.66 |
| 2.08 | 5.66 |
| 2.08 | 5.66 |
| 2.08 | 5.66 |
| 2.08 | 5.66 |
| 2.08 | 5.66 |
| 2.08 | 5.66 |
| 2.08 | 5.66 |
| 2.08 | 5.66 |
| 2.08 | 5.66 |
| 2.08 | 5.66 |
| 2.08 | 5.66 |
| 2.08 | 5.66 |
| 2.08 | 5.66 |
| 2.08 | 5.66 |
| 2.08 | 5.66 |
| 2.08 | 5.66 |
| 2.08 | 5.66 |
| 2.08 | 5.66 |
| 2.08 | 5.66 |
| 2.08 | 5.66 |
| 2.08 | 5.66 |
| 2.08 | 5.66 |
| 2.08 | 5.66 |
| 2.08 | 5.66 |
| 2.08 | 5.66 |
| 2.08 | 5.66 |
| 2.08 | 5.66 |
| 2.08 | 5.66 |
| 2.08 | 5.66 |
| 2.08 | 5.66 |
| 2.08 | 5.66 |
| 2.08 | 5.66 |
| 2.08 | 5.66 |
| 2.08 | 5.66 |
| 2.08 | 5.66 |
| 2.08 | 5.66 |
| 2.08 | 5.66 |
| 2.08 | 5.66 |
| 2.08 | 5.66 |
| 2.08 | 5.66 |
| 2.08 | 5.66 |
| 2.08 | 5.66 |
| 2.08 | 5.66 |
| 2.08 | 5.66 |
| 2.08 | 5.66 |
| 2.08 | 5.66 |
| 2.08 | 5.66 |
| 2.08 | 5.66 |
| 2.08 | 5.66 |
| 2.08 | 5.66 |
| 2.08 | 5.66 |
| 2.08 | 5.66 |
| 2.08 | 5.66 |
| 2.08 | 5.66 |
| 2.08 | 5.66 |
| 2.08 | 5.66 |
| 2.08 | 5.66 |
| 2.08 | 5.66 |
| 2.08 | 5.66 |
| 2.08 | 5.66 |
| 2.08 | 5.66 |
| 2.08 | 5.66 |
| 2.08 | 5.66 |
| 2.08 | 5.66 |
| 2.08 | 5.66 |
| 2.08 | 5.66 |
| 1.95 | 5.99 |
| 1.95 | 5.99 |
| 1.95 | 5.99 |
| 1.95 | 5.99 |
| 1.95 | 5.99 |
| 1.95 | 5.99 |
| 1.95 | 5.99 |
| 1.95 | 5.99 |
| 1.95 | 5.99 |
| 1.95 | 5.99 |
| 1.95 | 5.99 |
| 1.95 | 5.99 |
| 1.95 | 5.99 |
| 1.95 | 5.99 |
| 1.95 | 5.99 |
| 1.95 | 5.99 |
| 1.95 | 5.99 |
| 1.95 | 5.99 |
| 1.95 | 5.99 |
| 1.95 | 5.99 |
| 1.95 | 5.99 |
| 1.95 | 5.99 |
| 1.95 | 5.99 |
| 1.95 | 5.99 |
| 1.95 | 5.99 |
| 1.95 | 5.99 |
| 1.95 | 5.99 |
| 1.95 | 5.99 |
| 1.95 | 5.99 |
| 1.95 | 5.99 |
| 1.95 | 5.99 |
| 1.95 | 5.99 |
| 1.95 | 5.99 |
| 1.95 | 5.99 |
| 1.95 | 5.99 |
| 1.95 | 5.99 |
| 1.95 | 5.99 |
| 1.95 | 5.99 |
| 1.95 | 5.99 |
| 1.95 | 5.99 |
| 1.95 | 5.99 |
| 1.95 | 5.99 |
| 1.95 | 5.99 |
| 1.95 | 5.99 |
| 1.95 | 5.99 |
| 1.95 | 5.99 |
| 1.95 | 5.99 |
| 1.95 | 5.99 |
| 1.95 | 5.99 |
| 1.95 | 5.99 |
| 1.95 | 5.99 |
| 1.95 | 5.99 |
| 1.95 | 5.99 |
| 1.95 | 5.99 |
| 1.95 | 5.99 |
| 1.95 | 5.99 |
| 1.95 | 5.99 |
| 1.95 | 5.99 |
| 1.95 | 5.99 |
| 1.95 | 5.99 |
| 1.95 | 5.99 |
| 1.95 | 5.99 |
| 1.95 | 5.99 |
| 1.95 | 5.99 |
| 1.95 | 5.99 |
| 1.95 | 5.99 |
| 1.95 | 5.99 |
| 1.95 | 5.99 |
| 1.95 | 5.99 |
| 1.95 | 5.99 |
| 1.95 | 5.99 |
| 1.95 | 5.99 |
| 1.95 | 5.99 |
| 1.95 | 5.99 |
| 1.95 | 5.99 |
| 1.95 | 5.99 |
| 1.95 | 5.99 |
| 1.95 | 5.99 |
| 1.95 | 5.99 |
| 1.95 | 5.99 |
| 1.95 | 5.99 |
| 1.95 | 5.99 |
| 1.95 | 5.99 |
| 1.95 | 5.99 |
| 1.95 | 5.99 |
| 1.95 | 5.99 |
| 1.95 | 5.99 |
| 1.95 | 5.99 |
| 1.95 | 5.99 |
| 1.95 | 5.99 |
| 1.95 | 5.99 |
| 1.95 | 5.99 |
| 1.95 | 5.99 |
| 1.95 | 5.99 |
| 1.95 | 5.99 |
| 1.95 | 5.99 |
| 1.95 | 5.99 |
| 1.95 | 5.99 |
| 1.95 | 5.99 |
| 1.95 | 5.99 |
| 1.95 | 5.99 |
| 1.95 | 5.99 |
| 1.95 | 5.99 |
| 1.95 | 5.99 |
| 1.95 | 5.99 |
| 1.95 | 5.99 |
| 1.95 | 5.99 |
| 1.95 | 5.99 |
| 1.95 | 5.99 |
| 1.95 | 5.99 |
| 1.95 | 5.99 |
| 1.95 | 5.99 |
| 1.95 | 5.99 |
| 1.95 | 5.99 |
| 1.95 | 5.99 |
| 1.95 | 5.99 |
| 1.95 | 5.99 |
| 1.95 | 5.99 |
| 1.95 | 5.99 |
| 1.95 | 5.99 |
| 1.95 | 5.99 |
| 1.95 | 5.99 |
| 1.95 | 5.99 |
| 1.95 | 5.99 |
| 1.95 | 5.99 |
| 1.95 | 5.99 |
| 1.95 | 5.99 |
| 1.95 | 5.99 |
| 1.95 | 5.99 |
| 1.95 | 5.99 |
| 1.95 | 5.99 |
| 1.95 | 5.99 |
| 1.95 | 5.99 |
| 1.95 | 5.99 |
| 1.95 | 5.99 |
| 1.95 | 5.99 |
| 1.95 | 5.99 |
| 1.95 | 5.99 |
| 1.95 | 5.99 |
| 1.95 | 5.99 |
| 1.95 | 5.99 |
| 1.95 | 5.99 |
| 1.95 | 5.99 |
| 1.95 | 5.99 |
| 1.95 | 5.99 |
| 1.95 | 5.99 |
| 1.95 | 5.99 |
| 1.95 | 5.99 |
| 1.95 | 5.99 |
| 1.95 | 5.99 |
| 1.95 | 5.99 |
| 1.95 | 5.99 |
| 1.95 | 5.99 |
| 1.95 | 5.99 |
| 1.95 | 5.99 |
| 1.95 | 5.99 |
| 1.95 | 5.99 |
| 1.95 | 5.99 |
| 1.95 | 5.99 |
| 1.95 | 5.99 |
| 1.95 | 5.99 |
| 1.95 | 5.99 |
| 1.95 | 5.99 |
| 1.95 | 5.99 |
| 1.95 | 5.99 |
| 1.95 | 5.99 |
| 1.95 | 5.99 |
| 1.95 | 5.99 |
| 1.95 | 5.99 |
| 1.95 | 5.99 |
| 1.95 | 5.99 |
| 1.95 | 5.99 |
| 1.95 | 5.99 |
| 1.95 | 5.99 |
| 1.95 | 5.99 |
| 1.95 | 5.99 |
| 1.95 | 5.99 |
| 1.95 | 5.99 |
| 1.95 | 5.99 |
| 1.95 | 5.99 |
| 1.95 | 5.99 |
| 1.95 | 5.99 |
| 1.95 | 5.99 |
| 1.95 | 5.99 |
| 1.95 | 5.99 |
| 1.95 | 5.99 |
| 1.95 | 5.99 |
| 1.95 | 5.99 |
| 1.95 | 5.99 |
| 1.95 | 5.99 |
| 1.95 | 5.99 |
| 1.95 | 5.99 |
| 1.95 | 5.99 |
| 1.95 | 5.99 |
| 1.95 | 5.99 |
| 1.95 | 5.99 |
| 1.95 | 5.99 |
| 1.95 | 5.99 |
| 1.95 | 5.99 |
| 1.95 | 5.99 |
| 1.95 | 5.99 |
| 1.95 | 5.99 |
| 1.95 | 5.99 |
| 1.95 | 5.99 |
| 1.95 | 5.99 |
| 1.95 | 5.99 |
| 1.95 | 5.99 |
| 1.95 | 5.99 |
| 1.95 | 5.99 |
| 1.95 | 5.99 |
| 1.95 | 5.99 |
| 1.95 | 5.99 |
| 1.95 | 5.99 |
| 1.95 | 5.99 |
| 1.95 | 5.99 |
| 1.95 | 5.99 |
| 1.95 | 5.99 |
| 1.95 | 5.99 |
| 1.95 | 5.99 |
| 1.95 | 5.99 |
| 1.95 | 5.99 |
| 1.95 | 5.99 |
| 1.95 | 5.99 |
| 1.95 | 5.99 |
| 1.95 | 5.99 |
| 1.95 | 5.99 |
| 1.95 | 5.99 |
| 1.95 | 5.99 |
| 1.95 | 5.99 |
| 1.95 | 5.99 |
| 1.95 | 5.99 |
| 1.95 | 5.99 |
| 1.95 | 5.99 |
| 1.95 | 5.99 |
| 1.95 | 5.99 |
| 1.95 | 5.99 |
| 1.95 | 5.99 |
| 1.95 | 5.99 |
| 1.95 | 5.99 |
| 1.95 | 5.99 |
| 1.95 | 5.99 |
| 1.95 | 5.99 |
| 1.95 | 5.99 |
| 1.95 | 5.99 |
| 1.95 | 5.99 |
| 1.95 | 5.99 |
| 1.95 | 5.99 |
| 1.95 | 5.99 |
| 1.95 | 5.99 |
| 1.95 | 5.99 |
| 1.95 | 5.99 |
| 1.95 | 5.99 |
| 1.95 | 5.99 |
| 1.95 | 5.99 |
| 1.95 | 5.99 |
| 1.95 | 5.99 |
| 1.95 | 5.99 |
| 1.95 | 5.99 |
| 1.95 | 5.99 |
| 1.95 | 5.99 |
| 1.95 | 5.99 |
| 1.95 | 5.99 |
| 1.95 | 5.99 |
| 1.95 | 5.99 |
| 1.95 | 5.99 |
| 1.95 | 5.99 |
| 1.95 | 5.99 |
| 1.95 | 5.99 |
| 1.95 | 5.99 |
| 1.95 | 5.99 |
| 1.95 | 5.99 |
| 1.95 | 5.99 |
| 1.95 | 5.99 |
| 1.95 | 5.99 |
| 1.95 | 5.99 |
| 1.95 | 5.99 |
| 1.95 | 5.99 |
| 1.95 | 5.99 |
| 1.95 | 5.99 |
| 1.95 | 5.99 |
| 1.95 | 5.99 |
| 1.95 | 5.99 |
| 1.95 | 5.99 |
| 1.95 | 5.99 |
| 1.95 | 5.99 |
| 1.95 | 5.99 |
| 1.95 | 5.99 |
| 1.95 | 5.99 |
| 1.95 | 5.99 |
| 1.95 | 5.99 |
| 1.95 | 5.99 |
| 1.95 | 5.99 |
| 1.95 | 5.99 |
| 1.95 | 5.99 |
| 1.95 | 5.99 |
| 1.95 | 5.99 |
| 1.95 | 5.99 |
| 1.95 | 5.99 |
| 1.95 | 5.99 |
| 1.95 | 5.99 |
| 1.95 | 5.99 |
| 1.95 | 5.99 |
| 1.95 | 5.99 |
| 1.95 | 5.99 |
| 1.95 | 5.99 |
| 1.95 | 5.99 |
| 1.95 | 5.99 |
| 1.95 | 5.99 |
| 1.95 | 5.99 |
| 1.95 | 5.99 |
| 1.95 | 5.99 |
| 1.95 | 5.99 |
| 1.95 | 5.99 |
| 1.95 | 5.99 |
| 1.95 | 5.99 |
| 1.95 | 5.99 |
| 1.95 | 5.99 |
| 1.95 | 5.99 |
| 1.95 | 5.99 |
| 1.95 | 5.99 |
| 1.95 | 5.99 |
| 1.95 | 5.99 |
| 1.95 | 5.99 |
| 1.95 | 5.99 |
| 1.95 | 5.99 |
| 1.95 | 5.99 |
| 1.95 | 5.99 |
| 1.95 | 5.99 |
| 1.95 | 5.99 |
| 1.95 | 5.99 |
| 1.95 | 5.99 |
| 1.95 | 5.99 |
| 1.95 | 5.99 |
| 1.95 | 5.99 |
| 1.95 | 5.99 |
| 1.95 | 5.99 |
| 1.95 | 5.99 |
| 1.95 | 5.99 |
| 1.95 | 5.99 |
| 1.95 | 5.99 |
| 1.95 | 5.99 |
| 1.95 | 5.99 |
| 1.95 | 5.99 |
| 1.95 | 5.99 |
| 1.95 | 5.99 |
| 1.95 | 5.99 |
| 1.95 | 5.99 |
| 1.95 | 5.99 |
| 1.95 | 5.99 |
| 1.95 | 5.99 |
| 1.95 | 5.99 |
| 1.95 | 5.99 |
| 1.95 | 5.99 |
| 1.95 | 5.99 |
| 1.95 | 5.99 |
| 1.95 | 5.99 |
| 1.95 | 5.99 |
| 1.95 | 5.99 |
| 1.95 | 5.99 |
| 1.95 | 5.99 |
| 1.95 | 5.99 |
| 1.95 | 5.99 |
| 1.95 | 5.99 |
| 1.95 | 5.99 |
| 1.95 | 5.99 |
| 1.95 | 5.99 |
| 1.95 | 5.99 |
| 1.95 | 5.99 |
| 1.95 | 5.99 |
| 1.95 | 5.99 |
| 1.95 | 5.99 |
| 1.95 | 5.99 |
| 1.95 | 5.99 |
| 1.95 | 5.99 |
| 1.95 | 5.99 |
| 1.95 | 5.99 |
| 1.95 | 5.99 |
| 1.95 | 5.99 |
| 1.95 | 5.99 |
| 1.95 | 5.99 |
| 1.95 | 5.99 |
| 1.95 | 5.99 |
| 1.95 | 5.99 |
| 1.95 | 5.99 |
| 1.95 | 5.99 |
| 1.95 | 5.99 |
| 1.95 | 5.99 |
| 1.95 | 5.99 |
| 1.95 | 5.99 |
| 1.95 | 5.99 |
| 1.95 | 5.99 |
| 1.95 | 5.99 |
| 1.95 | 5.99 |
| 1.95 | 5.99 |
| 1.95 | 5.99 |
| 1.95 | 5.99 |
| 1.95 | 5.99 |
| 1.95 | 5.99 |
| 1.79 | 6.32 |
| 1.79 | 6.32 |
| 1.79 | 6.32 |
| 1.79 | 6.32 |
| 1.79 | 6.32 |
| 1.79 | 6.32 |
| 1.79 | 6.32 |
| 1.79 | 6.32 |
| 1.79 | 6.32 |
| 1.79 | 6.32 |
| 1.79 | 6.32 |
| 1.79 | 6.32 |
| 1.79 | 6.32 |
| 1.79 | 6.32 |
| 1.79 | 6.32 |
| 1.79 | 6.32 |
| 1.79 | 6.32 |
| 1.79 | 6.32 |
| 1.79 | 6.32 |
| 1.79 | 6.32 |
| 1.79 | 6.32 |
| 1.79 | 6.32 |
| 1.79 | 6.32 |
| 1.79 | 6.32 |
| 1.79 | 6.32 |
| 1.79 | 6.32 |
| 1.79 | 6.32 |
| 1.79 | 6.32 |
| 1.79 | 6.32 |
| 1.79 | 6.32 |
| 1.79 | 6.32 |
| 1.79 | 6.32 |
| 1.79 | 6.32 |
| 1.79 | 6.32 |
| 1.79 | 6.32 |
| 1.79 | 6.32 |
| 1.79 | 6.32 |
| 1.79 | 6.32 |
| 1.79 | 6.32 |
| 1.79 | 6.32 |
| 1.79 | 6.32 |
| 1.79 | 6.32 |
| 1.79 | 6.32 |
| 1.79 | 6.32 |
| 1.79 | 6.32 |
| 1.79 | 6.32 |
| 1.79 | 6.32 |
| 1.79 | 6.32 |
| 1.79 | 6.32 |
| 1.79 | 6.32 |
| 1.79 | 6.32 |
| 1.79 | 6.32 |
| 1.79 | 6.32 |
| 1.79 | 6.32 |
| 1.79 | 6.32 |
| 1.79 | 6.32 |
| 1.79 | 6.32 |
| 1.79 | 6.32 |
| 1.79 | 6.32 |
| 1.79 | 6.32 |
| 1.79 | 6.32 |
| 1.79 | 6.32 |
| 1.79 | 6.32 |
| 1.79 | 6.32 |
| 1.79 | 6.32 |
| 1.79 | 6.32 |
| 1.79 | 6.32 |
| 1.79 | 6.32 |
| 1.79 | 6.32 |
| 1.79 | 6.32 |
| 1.79 | 6.32 |
| 1.79 | 6.32 |
| 1.79 | 6.32 |
| 1.79 | 6.32 |
| 1.79 | 6.32 |
| 1.79 | 6.32 |
| 1.79 | 6.32 |
| 1.79 | 6.32 |
| 1.79 | 6.32 |
| 1.79 | 6.32 |
| 1.79 | 6.32 |
| 1.79 | 6.32 |
| 1.79 | 6.32 |
| 1.79 | 6.32 |
| 1.79 | 6.32 |
| 1.79 | 6.32 |
| 1.79 | 6.32 |
| 1.79 | 6.32 |
| 1.79 | 6.32 |
| 1.79 | 6.32 |
| 1.79 | 6.32 |
| 1.79 | 6.32 |
| 1.79 | 6.32 |
| 1.79 | 6.32 |
| 1.79 | 6.32 |
| 1.79 | 6.32 |
| 1.79 | 6.32 |
| 1.79 | 6.32 |
| 1.79 | 6.32 |
| 1.79 | 6.32 |
| 1.79 | 6.32 |
| 1.79 | 6.32 |
| 1.79 | 6.32 |
| 1.79 | 6.32 |
| 1.79 | 6.32 |
| 1.79 | 6.32 |
| 1.79 | 6.32 |
| 1.79 | 6.32 |
| 1.79 | 6.32 |
| 1.79 | 6.32 |
| 1.79 | 6.32 |
| 1.79 | 6.32 |
| 1.79 | 6.32 |
| 1.79 | 6.32 |
| 1.79 | 6.32 |
| 1.79 | 6.32 |
| 1.79 | 6.32 |
| 1.79 | 6.32 |
| 1.79 | 6.32 |
| 1.79 | 6.32 |
| 1.79 | 6.32 |
| 1.79 | 6.32 |
| 1.79 | 6.32 |
| 1.79 | 6.32 |
| 1.79 | 6.32 |
| 1.79 | 6.32 |
| 1.79 | 6.32 |
| 1.79 | 6.32 |
| 1.79 | 6.32 |
| 1.79 | 6.32 |
| 1.79 | 6.32 |
| 1.79 | 6.32 |
| 1.79 | 6.32 |
| 1.79 | 6.32 |
| 1.79 | 6.32 |
| 1.79 | 6.32 |
| 1.79 | 6.32 |
| 1.79 | 6.32 |
| 1.79 | 6.32 |
| 1.79 | 6.32 |
| 1.79 | 6.32 |
| 1.79 | 6.32 |
| 1.79 | 6.32 |
| 1.79 | 6.32 |
| 1.79 | 6.32 |
| 1.79 | 6.32 |
| 1.79 | 6.32 |
| 1.79 | 6.32 |
| 1.79 | 6.32 |
| 1.79 | 6.32 |
| 1.79 | 6.32 |
| 1.79 | 6.32 |
| 1.79 | 6.32 |
| 1.79 | 6.32 |
| 1.79 | 6.32 |
| 1.79 | 6.32 |
| 1.79 | 6.32 |
| 1.79 | 6.32 |
| 1.79 | 6.32 |
| 1.79 | 6.32 |
| 1.79 | 6.32 |
| 1.79 | 6.32 |
| 1.79 | 6.32 |
| 1.79 | 6.32 |
| 1.79 | 6.32 |
| 1.79 | 6.32 |
| 1.79 | 6.32 |
| 1.79 | 6.32 |
| 1.79 | 6.32 |
| 1.79 | 6.32 |
| 1.79 | 6.32 |
| 1.79 | 6.32 |
| 1.79 | 6.32 |
| 1.79 | 6.32 |
| 1.79 | 6.32 |
| 1.79 | 6.32 |
| 1.79 | 6.32 |
| 1.79 | 6.32 |
| 1.79 | 6.32 |
| 1.79 | 6.32 |
| 1.79 | 6.32 |
| 1.79 | 6.32 |
| 1.79 | 6.32 |
| 1.79 | 6.32 |
| 1.79 | 6.32 |
| 1.79 | 6.32 |
| 1.79 | 6.32 |
| 1.79 | 6.32 |
| 1.79 | 6.32 |
| 1.79 | 6.32 |
| 1.79 | 6.32 |
| 1.79 | 6.32 |
| 1.79 | 6.32 |
| 1.79 | 6.32 |
| 1.79 | 6.32 |
| 1.79 | 6.32 |
| 1.79 | 6.32 |
| 1.79 | 6.32 |
| 1.79 | 6.32 |
| 1.79 | 6.32 |
| 1.79 | 6.32 |
| 1.79 | 6.32 |
| 1.79 | 6.32 |
| 1.79 | 6.32 |
| 1.79 | 6.32 |
| 1.79 | 6.32 |
| 1.79 | 6.32 |
| 1.79 | 6.32 |
| 1.79 | 6.32 |
| 1.79 | 6.32 |
| 1.79 | 6.32 |
| 1.79 | 6.32 |
| 1.79 | 6.32 |
| 1.79 | 6.32 |
| 1.79 | 6.32 |
| 1.79 | 6.32 |
| 1.79 | 6.32 |
| 1.79 | 6.32 |
| 1.79 | 6.32 |
| 1.79 | 6.32 |
| 1.79 | 6.32 |
| 1.79 | 6.32 |
| 1.79 | 6.32 |
| 1.79 | 6.32 |
| 1.79 | 6.32 |
| 1.79 | 6.32 |
| 1.79 | 6.32 |
| 1.79 | 6.32 |
| 1.79 | 6.32 |
| 1.79 | 6.32 |
| 1.79 | 6.32 |
| 1.79 | 6.32 |
| 1.79 | 6.32 |
| 1.79 | 6.32 |
| 1.79 | 6.32 |
| 1.79 | 6.32 |
| 1.79 | 6.32 |
| 1.79 | 6.32 |
| 1.79 | 6.32 |
| 1.79 | 6.32 |
| 1.79 | 6.32 |
| 1.79 | 6.32 |
| 1.79 | 6.32 |
| 1.79 | 6.32 |
| 1.79 | 6.32 |
| 1.79 | 6.32 |
| 1.79 | 6.32 |
| 1.79 | 6.32 |
| 1.79 | 6.32 |
| 1.79 | 6.32 |
| 1.79 | 6.32 |
| 1.79 | 6.32 |
| 1.79 | 6.32 |
| 1.79 | 6.32 |
| 1.79 | 6.32 |
| 1.79 | 6.32 |
| 1.79 | 6.32 |
| 1.79 | 6.32 |
| 1.79 | 6.32 |
| 1.79 | 6.32 |
| 1.79 | 6.32 |
| 1.79 | 6.32 |
| 1.79 | 6.32 |
| 1.79 | 6.32 |
| 1.79 | 6.32 |
| 1.79 | 6.32 |
| 1.79 | 6.32 |
| 1.79 | 6.32 |
| 1.79 | 6.32 |
| 1.79 | 6.32 |
| 1.79 | 6.32 |
| 1.79 | 6.32 |
| 1.79 | 6.32 |
| 1.79 | 6.32 |
| 1.79 | 6.32 |
| 1.79 | 6.32 |
| 1.79 | 6.32 |
| 1.79 | 6.32 |
| 1.79 | 6.32 |
| 1.79 | 6.32 |
| 1.79 | 6.32 |
| 1.79 | 6.32 |
| 1.79 | 6.32 |
| 1.79 | 6.32 |
| 1.79 | 6.32 |
| 1.79 | 6.32 |
| 1.79 | 6.32 |
| 1.79 | 6.32 |
| 1.79 | 6.32 |
| 1.79 | 6.32 |
| 1.79 | 6.32 |
| 1.79 | 6.32 |
| 1.79 | 6.32 |
| 1.79 | 6.32 |
| 1.79 | 6.32 |
| 1.79 | 6.32 |
| 1.79 | 6.32 |
| 1.79 | 6.32 |
| 1.79 | 6.32 |
| 1.79 | 6.32 |
| 1.79 | 6.32 |
| 1.79 | 6.32 |
| 1.79 | 6.32 |
| 1.79 | 6.32 |
| 1.79 | 6.32 |
| 1.79 | 6.32 |
| 1.79 | 6.32 |
| 1.79 | 6.32 |
| 1.79 | 6.32 |
| 1.79 | 6.32 |
| 1.79 | 6.32 |
| 1.79 | 6.32 |
| 1.79 | 6.32 |
| 1.79 | 6.32 |
| 1.79 | 6.32 |
| 1.79 | 6.32 |
| 1.79 | 6.32 |
| 1.79 | 6.32 |
| 1.79 | 6.32 |
| 1.79 | 6.32 |
| 1.79 | 6.32 |
| 1.79 | 6.32 |
| 1.79 | 6.32 |
| 1.79 | 6.32 |
| 1.79 | 6.32 |
| 1.79 | 6.32 |
| 1.79 | 6.32 |
| 1.79 | 6.32 |
| 1.79 | 6.32 |
| 1.79 | 6.32 |
| 1.79 | 6.32 |
| 1.79 | 6.32 |
| 1.79 | 6.32 |
| 1.79 | 6.32 |
| 1.79 | 6.32 |
| 1.79 | 6.32 |
| 1.79 | 6.32 |
| 1.79 | 6.32 |
| 1.79 | 6.32 |
| 1.79 | 6.32 |
| 1.79 | 6.32 |
| 1.79 | 6.32 |
| 1.79 | 6.32 |
| 1.79 | 6.32 |
| 1.79 | 6.32 |
| 1.79 | 6.32 |
| 1.79 | 6.32 |
| 1.79 | 6.32 |
| 1.79 | 6.32 |
| 1.79 | 6.32 |
| 1.79 | 6.32 |
| 1.79 | 6.32 |
| 1.79 | 6.32 |
| 1.79 | 6.32 |
| 1.79 | 6.32 |
| 1.79 | 6.32 |
| 1.79 | 6.32 |
| 1.79 | 6.32 |
| 1.79 | 6.32 |
| 1.79 | 6.32 |
| 1.79 | 6.32 |
| 1.79 | 6.32 |
| 1.79 | 6.32 |
| 1.79 | 6.32 |
| 1.79 | 6.32 |
| 1.79 | 6.32 |
| 1.79 | 6.32 |
| 1.79 | 6.32 |
| 1.79 | 6.32 |
| 1.79 | 6.32 |
| 1.79 | 6.32 |
| 1.79 | 6.32 |
| 1.79 | 6.32 |
| 1.79 | 6.32 |
| 1.79 | 6.32 |
| 1.79 | 6.32 |
| 1.79 | 6.32 |
| 1.79 | 6.32 |
| 1.79 | 6.32 |
| 1.79 | 6.32 |
| 1.79 | 6.32 |
| 1.79 | 6.32 |
| 1.79 | 6.32 |
| 1.79 | 6.32 |
| 1.79 | 6.32 |
| 1.79 | 6.32 |
| 1.79 | 6.32 |
| 1.79 | 6.32 |
| 1.79 | 6.32 |
| 1.79 | 6.32 |
| 1.79 | 6.32 |
| 1.79 | 6.32 |
| 1.79 | 6.32 |
| 1.79 | 6.32 |
| 1.79 | 6.32 |
| 1.79 | 6.32 |
| 1.79 | 6.32 |
| 1.79 | 6.32 |
| 1.79 | 6.32 |
| 1.79 | 6.32 |
| 1.79 | 6.32 |
| 1.79 | 6.32 |
| 1.79 | 6.32 |
| 1.79 | 6.32 |
| 1.79 | 6.32 |
| 1.79 | 6.32 |
| 1.79 | 6.32 |
| 1.79 | 6.32 |
| 1.79 | 6.32 |
| 1.79 | 6.32 |
| 1.79 | 6.32 |
| 1.79 | 6.32 |
| 1.79 | 6.32 |
| 1.79 | 6.32 |
| 1.79 | 6.32 |
| 1.79 | 6.32 |
| 1.79 | 6.32 |
| 1.79 | 6.32 |
| 1.79 | 6.32 |
| 1.79 | 6.32 |
| 1.79 | 6.32 |
| 1.79 | 6.32 |
| 1.79 | 6.32 |
| 1.79 | 6.32 |
| 1.79 | 6.32 |
| 1.79 | 6.32 |
| 1.79 | 6.32 |
| 1.79 | 6.32 |
| 1.79 | 6.32 |
| 1.79 | 6.32 |
| 1.79 | 6.32 |
| 1.79 | 6.32 |
| 1.79 | 6.32 |
| 1.79 | 6.32 |
| 1.79 | 6.32 |
| 1.79 | 6.32 |
| 1.79 | 6.32 |
| 1.79 | 6.32 |
| 1.79 | 6.32 |
| 1.79 | 6.32 |
| 1.79 | 6.32 |
| 1.79 | 6.32 |
| 1.79 | 6.32 |
| 1.79 | 6.32 |
| 1.79 | 6.32 |
| 1.79 | 6.32 |
| 1.79 | 6.32 |
| 1.79 | 6.32 |
| 1.79 | 6.32 |
| 1.79 | 6.32 |
| 1.79 | 6.32 |
| 1.79 | 6.32 |
| 1.79 | 6.32 |
| 1.79 | 6.32 |
| 1.79 | 6.32 |
| 1.79 | 6.32 |
| 1.79 | 6.32 |
| 1.79 | 6.32 |
| 1.79 | 6.32 |
| 1.79 | 6.32 |
| 1.79 | 6.32 |
| 1.79 | 6.32 |
| 1.79 | 6.32 |
| 1.79 | 6.32 |
| 1.79 | 6.32 |
| 1.79 | 6.32 |
| 1.79 | 6.32 |
| 1.79 | 6.32 |
| 1.79 | 6.32 |
| 1.79 | 6.32 |
| 1.79 | 6.32 |
| 1.79 | 6.32 |
| 1.79 | 6.32 |
| 1.79 | 6.32 |
| 1.79 | 6.32 |
| 1.79 | 6.32 |
| 1.79 | 6.32 |
| 1.79 | 6.32 |
| 1.79 | 6.32 |
| 1.79 | 6.32 |
| 1.79 | 6.32 |
| 1.79 | 6.32 |
| 1.79 | 6.32 |
| 1.79 | 6.32 |
| 1.79 | 6.32 |
| 1.79 | 6.32 |
| 1.79 | 6.32 |
| 1.79 | 6.32 |
| 1.79 | 6.32 |
| 1.79 | 6.32 |
| 1.79 | 6.32 |
| 1.79 | 6.32 |
| 1.79 | 6.32 |
| 1.79 | 6.32 |
| 1.79 | 6.32 |
| 1.79 | 6.32 |
| 1.79 | 6.32 |
| 1.79 | 6.32 |
| 1.79 | 6.32 |
| 1.79 | 6.32 |
| 1.79 | 6.32 |
| 1.79 | 6.32 |
| 1.79 | 6.32 |
| 1.79 | 6.32 |
| 1.79 | 6.32 |
| 1.79 | 6.32 |
| 1.79 | 6.32 |
| 1.79 | 6.32 |
| 1.79 | 6.32 |
| 1.79 | 6.32 |
| 1.79 | 6.32 |
| 1.79 | 6.32 |
| 1.79 | 6.32 |
| 1.79 | 6.32 |
| 1.79 | 6.32 |
| 1.79 | 6.32 |
| 1.79 | 6.32 |
| 1.79 | 6.32 |
| 1.79 | 6.32 |
| 1.79 | 6.32 |
| 1.79 | 6.32 |
| 1.79 | 6.32 |
| 1.79 | 6.32 |
| 1.79 | 6.32 |
| 1.79 | 6.32 |
| 1.79 | 6.32 |
| 1.79 | 6.32 |
| 1.79 | 6.32 |
| 1.79 | 6.32 |
| 1.79 | 6.32 |
| 1.79 | 6.32 |
| 1.79 | 6.32 |
| 1.79 | 6.32 |
| 1.79 | 6.32 |
| 1.79 | 6.32 |
| 1.79 | 6.32 |
| 1.79 | 6.32 |
| 1.79 | 6.32 |
| 1.79 | 6.32 |
| 1.79 | 6.32 |
| 1.79 | 6.32 |
| 1.79 | 6.32 |
| 1.79 | 6.32 |
| 1.79 | 6.32 |
| 1.79 | 6.32 |
| 1.79 | 6.32 |
| 1.79 | 6.32 |
| 1.79 | 6.32 |
| 1.79 | 6.32 |
| 1.79 | 6.32 |
| 1.79 | 6.32 |
| 1.79 | 6.32 |
| 1.79 | 6.32 |
| 1.79 | 6.32 |
| 1.79 | 6.32 |
| 1.79 | 6.32 |
| 1.61 | 6.52 |
| 1.61 | 6.52 |
| 1.61 | 6.52 |
| 1.61 | 6.52 |
| 1.61 | 6.52 |
| 1.61 | 6.52 |
| 1.61 | 6.52 |
| 1.61 | 6.52 |
| 1.61 | 6.52 |
| 1.61 | 6.52 |
| 1.61 | 6.52 |
| 1.61 | 6.52 |
| 1.61 | 6.52 |
| 1.61 | 6.52 |
| 1.61 | 6.52 |
| 1.61 | 6.52 |
| 1.61 | 6.52 |
| 1.61 | 6.52 |
| 1.61 | 6.52 |
| 1.61 | 6.52 |
| 1.61 | 6.52 |
| 1.61 | 6.52 |
| 1.61 | 6.52 |
| 1.61 | 6.52 |
| 1.61 | 6.52 |
| 1.61 | 6.52 |
| 1.61 | 6.52 |
| 1.61 | 6.52 |
| 1.61 | 6.52 |
| 1.61 | 6.52 |
| 1.61 | 6.52 |
| 1.61 | 6.52 |
| 1.61 | 6.52 |
| 1.61 | 6.52 |
| 1.61 | 6.52 |
| 1.61 | 6.52 |
| 1.61 | 6.52 |
| 1.61 | 6.52 |
| 1.61 | 6.52 |
| 1.61 | 6.52 |
| 1.61 | 6.52 |
| 1.61 | 6.52 |
| 1.61 | 6.52 |
| 1.61 | 6.52 |
| 1.61 | 6.52 |
| 1.61 | 6.52 |
| 1.61 | 6.52 |
| 1.61 | 6.52 |
| 1.61 | 6.52 |
| 1.61 | 6.52 |
| 1.61 | 6.52 |
| 1.61 | 6.52 |
| 1.61 | 6.52 |
| 1.61 | 6.52 |
| 1.61 | 6.52 |
| 1.61 | 6.52 |
| 1.61 | 6.52 |
| 1.61 | 6.52 |
| 1.61 | 6.52 |
| 1.61 | 6.52 |
| 1.61 | 6.52 |
| 1.61 | 6.52 |
| 1.61 | 6.52 |
| 1.61 | 6.52 |
| 1.61 | 6.52 |
| 1.61 | 6.52 |
| 1.61 | 6.52 |
| 1.61 | 6.52 |
| 1.61 | 6.52 |
| 1.61 | 6.52 |
| 1.61 | 6.52 |
| 1.61 | 6.52 |
| 1.61 | 6.52 |
| 1.61 | 6.52 |
| 1.61 | 6.52 |
| 1.61 | 6.52 |
| 1.61 | 6.52 |
| 1.61 | 6.52 |
| 1.61 | 6.52 |
| 1.61 | 6.52 |
| 1.61 | 6.52 |
| 1.61 | 6.52 |
| 1.61 | 6.52 |
| 1.61 | 6.52 |
| 1.61 | 6.52 |
| 1.61 | 6.52 |
| 1.61 | 6.52 |
| 1.61 | 6.52 |
| 1.61 | 6.52 |
| 1.61 | 6.52 |
| 1.61 | 6.52 |
| 1.61 | 6.52 |
| 1.61 | 6.52 |
| 1.61 | 6.52 |
| 1.61 | 6.52 |
| 1.61 | 6.52 |
| 1.61 | 6.52 |
| 1.61 | 6.52 |
| 1.61 | 6.52 |
| 1.61 | 6.52 |
| 1.61 | 6.52 |
| 1.61 | 6.52 |
| 1.61 | 6.52 |
| 1.61 | 6.52 |
| 1.61 | 6.52 |
| 1.61 | 6.52 |
| 1.61 | 6.52 |
| 1.61 | 6.52 |
| 1.61 | 6.52 |
| 1.61 | 6.52 |
| 1.61 | 6.52 |
| 1.61 | 6.52 |
| 1.61 | 6.52 |
| 1.61 | 6.52 |
| 1.61 | 6.52 |
| 1.61 | 6.52 |
| 1.61 | 6.52 |
| 1.61 | 6.52 |
| 1.61 | 6.52 |
| 1.61 | 6.52 |
| 1.61 | 6.52 |
| 1.61 | 6.52 |
| 1.61 | 6.52 |
| 1.61 | 6.52 |
| 1.61 | 6.52 |
| 1.61 | 6.52 |
| 1.61 | 6.52 |
| 1.61 | 6.52 |
| 1.61 | 6.52 |
| 1.61 | 6.52 |
| 1.61 | 6.52 |
| 1.61 | 6.52 |
| 1.61 | 6.52 |
| 1.61 | 6.52 |
| 1.61 | 6.52 |
| 1.61 | 6.52 |
| 1.61 | 6.52 |
| 1.61 | 6.52 |
| 1.61 | 6.52 |
| 1.61 | 6.52 |
| 1.61 | 6.52 |
| 1.61 | 6.52 |
| 1.61 | 6.52 |
| 1.61 | 6.52 |
| 1.61 | 6.52 |
| 1.61 | 6.52 |
| 1.61 | 6.52 |
| 1.61 | 6.52 |
| 1.61 | 6.52 |
| 1.61 | 6.52 |
| 1.61 | 6.52 |
| 1.61 | 6.52 |
| 1.61 | 6.52 |
| 1.61 | 6.52 |
| 1.61 | 6.52 |
| 1.61 | 6.52 |
| 1.61 | 6.52 |
| 1.61 | 6.52 |
| 1.61 | 6.52 |
| 1.61 | 6.52 |
| 1.61 | 6.52 |
| 1.61 | 6.52 |
| 1.61 | 6.52 |
| 1.61 | 6.52 |
| 1.61 | 6.52 |
| 1.61 | 6.52 |
| 1.61 | 6.52 |
| 1.61 | 6.52 |
| 1.61 | 6.52 |
| 1.61 | 6.52 |
| 1.61 | 6.52 |
| 1.61 | 6.52 |
| 1.61 | 6.52 |
| 1.61 | 6.52 |
| 1.61 | 6.52 |
| 1.61 | 6.52 |
| 1.61 | 6.52 |
| 1.61 | 6.52 |
| 1.61 | 6.52 |
| 1.61 | 6.52 |
| 1.61 | 6.52 |
| 1.61 | 6.52 |
| 1.61 | 6.52 |
| 1.61 | 6.52 |
| 1.61 | 6.52 |
| 1.61 | 6.52 |
| 1.61 | 6.52 |
| 1.61 | 6.52 |
| 1.61 | 6.52 |
| 1.61 | 6.52 |
| 1.61 | 6.52 |
| 1.61 | 6.52 |
| 1.61 | 6.52 |
| 1.61 | 6.52 |
| 1.61 | 6.52 |
| 1.61 | 6.52 |
| 1.61 | 6.52 |
| 1.61 | 6.52 |
| 1.61 | 6.52 |
| 1.61 | 6.52 |
| 1.61 | 6.52 |
| 1.61 | 6.52 |
| 1.61 | 6.52 |
| 1.61 | 6.52 |
| 1.61 | 6.52 |
| 1.61 | 6.52 |
| 1.61 | 6.52 |
| 1.61 | 6.52 |
| 1.61 | 6.52 |
| 1.61 | 6.52 |
| 1.61 | 6.52 |
| 1.61 | 6.52 |
| 1.61 | 6.52 |
| 1.61 | 6.52 |
| 1.61 | 6.52 |
| 1.61 | 6.52 |
| 1.61 | 6.52 |
| 1.61 | 6.52 |
| 1.61 | 6.52 |
| 1.61 | 6.52 |
| 1.61 | 6.52 |
| 1.61 | 6.52 |
| 1.61 | 6.52 |
| 1.61 | 6.52 |
| 1.61 | 6.52 |
| 1.61 | 6.52 |
| 1.61 | 6.52 |
| 1.61 | 6.52 |
| 1.61 | 6.52 |
| 1.61 | 6.52 |
| 1.61 | 6.52 |
| 1.61 | 6.52 |
| 1.61 | 6.52 |
| 1.61 | 6.52 |
| 1.61 | 6.52 |
| 1.61 | 6.52 |
| 1.61 | 6.52 |
| 1.61 | 6.52 |
| 1.61 | 6.52 |
| 1.61 | 6.52 |
| 1.61 | 6.52 |
| 1.61 | 6.52 |
| 1.61 | 6.52 |
| 1.61 | 6.52 |
| 1.61 | 6.52 |
| 1.61 | 6.52 |
| 1.61 | 6.52 |
| 1.61 | 6.52 |
| 1.61 | 6.52 |
| 1.61 | 6.52 |
| 1.61 | 6.52 |
| 1.61 | 6.52 |
| 1.61 | 6.52 |
| 1.61 | 6.52 |
| 1.61 | 6.52 |
| 1.61 | 6.52 |
| 1.61 | 6.52 |
| 1.61 | 6.52 |
| 1.61 | 6.52 |
| 1.61 | 6.52 |
| 1.61 | 6.52 |
| 1.61 | 6.52 |
| 1.61 | 6.52 |
| 1.61 | 6.52 |
| 1.61 | 6.52 |
| 1.61 | 6.52 |
| 1.61 | 6.52 |
| 1.61 | 6.52 |
| 1.61 | 6.52 |
| 1.61 | 6.52 |
| 1.61 | 6.52 |
| 1.61 | 6.52 |
| 1.61 | 6.52 |
| 1.61 | 6.52 |
| 1.61 | 6.52 |
| 1.61 | 6.52 |
| 1.61 | 6.52 |
| 1.61 | 6.52 |
| 1.61 | 6.52 |
| 1.61 | 6.52 |
| 1.61 | 6.52 |
| 1.61 | 6.52 |
| 1.61 | 6.52 |
| 1.61 | 6.52 |
| 1.61 | 6.52 |
| 1.61 | 6.52 |
| 1.61 | 6.52 |
| 1.61 | 6.52 |
| 1.61 | 6.52 |
| 1.61 | 6.52 |
| 1.61 | 6.52 |
| 1.61 | 6.52 |
| 1.61 | 6.52 |
| 1.61 | 6.52 |
| 1.61 | 6.52 |
| 1.61 | 6.52 |
| 1.61 | 6.52 |
| 1.61 | 6.52 |
| 1.61 | 6.52 |
| 1.61 | 6.52 |
| 1.61 | 6.52 |
| 1.61 | 6.52 |
| 1.61 | 6.52 |
| 1.61 | 6.52 |
| 1.61 | 6.52 |
| 1.61 | 6.52 |
| 1.61 | 6.52 |
| 1.61 | 6.52 |
| 1.61 | 6.52 |
| 1.61 | 6.52 |
| 1.61 | 6.52 |
| 1.61 | 6.52 |
| 1.61 | 6.52 |
| 1.61 | 6.52 |
| 1.61 | 6.52 |
| 1.61 | 6.52 |
| 1.61 | 6.52 |
| 1.61 | 6.52 |
| 1.61 | 6.52 |
| 1.61 | 6.52 |
| 1.61 | 6.52 |
| 1.61 | 6.52 |
| 1.61 | 6.52 |
| 1.61 | 6.52 |
| 1.61 | 6.52 |
| 1.61 | 6.52 |
| 1.61 | 6.52 |
| 1.61 | 6.52 |
| 1.61 | 6.52 |
| 1.61 | 6.52 |
| 1.61 | 6.52 |
| 1.61 | 6.52 |
| 1.61 | 6.52 |
| 1.61 | 6.52 |
| 1.61 | 6.52 |
| 1.61 | 6.52 |
| 1.61 | 6.52 |
| 1.61 | 6.52 |
| 1.61 | 6.52 |
| 1.61 | 6.52 |
| 1.61 | 6.52 |
| 1.61 | 6.52 |
| 1.61 | 6.52 |
| 1.61 | 6.52 |
| 1.61 | 6.52 |
| 1.61 | 6.52 |
| 1.61 | 6.52 |
| 1.61 | 6.52 |
| 1.61 | 6.52 |
| 1.61 | 6.52 |
| 1.61 | 6.52 |
| 1.61 | 6.52 |
| 1.61 | 6.52 |
| 1.61 | 6.52 |
| 1.61 | 6.52 |
| 1.61 | 6.52 |
| 1.61 | 6.52 |
| 1.61 | 6.52 |
| 1.61 | 6.52 |
| 1.61 | 6.52 |
| 1.61 | 6.52 |
| 1.61 | 6.52 |
| 1.61 | 6.52 |
| 1.61 | 6.52 |
| 1.61 | 6.52 |
| 1.61 | 6.52 |
| 1.61 | 6.52 |
| 1.61 | 6.52 |
| 1.61 | 6.52 |
| 1.61 | 6.52 |
| 1.61 | 6.52 |
| 1.61 | 6.52 |
| 1.61 | 6.52 |
| 1.61 | 6.52 |
| 1.61 | 6.52 |
| 1.61 | 6.52 |
| 1.61 | 6.52 |
| 1.61 | 6.52 |
| 1.61 | 6.52 |
| 1.61 | 6.52 |
| 1.61 | 6.52 |
| 1.61 | 6.52 |
| 1.61 | 6.52 |
| 1.61 | 6.52 |
| 1.61 | 6.52 |
| 1.61 | 6.52 |
| 1.61 | 6.52 |
| 1.61 | 6.52 |
| 1.61 | 6.52 |
| 1.61 | 6.52 |
| 1.61 | 6.52 |
| 1.61 | 6.52 |
| 1.61 | 6.52 |
| 1.61 | 6.52 |
| 1.61 | 6.52 |
| 1.61 | 6.52 |
| 1.61 | 6.52 |
| 1.61 | 6.52 |
| 1.61 | 6.52 |
| 1.61 | 6.52 |
| 1.61 | 6.52 |
| 1.61 | 6.52 |
| 1.61 | 6.52 |
| 1.61 | 6.52 |
| 1.61 | 6.52 |
| 1.61 | 6.52 |
| 1.61 | 6.52 |
| 1.61 | 6.52 |
| 1.61 | 6.52 |
| 1.61 | 6.52 |
| 1.61 | 6.52 |
| 1.61 | 6.52 |
| 1.61 | 6.52 |
| 1.61 | 6.52 |
| 1.61 | 6.52 |
| 1.61 | 6.52 |
| 1.61 | 6.52 |
| 1.61 | 6.52 |
| 1.61 | 6.52 |
| 1.61 | 6.52 |
| 1.61 | 6.52 |
| 1.61 | 6.52 |
| 1.61 | 6.52 |
| 1.61 | 6.52 |
| 1.61 | 6.52 |
| 1.61 | 6.52 |
| 1.61 | 6.52 |
| 1.61 | 6.52 |
| 1.61 | 6.52 |
| 1.61 | 6.52 |
| 1.61 | 6.52 |
| 1.61 | 6.52 |
| 1.61 | 6.52 |
| 1.61 | 6.52 |
| 1.61 | 6.52 |
| 1.61 | 6.52 |
| 1.61 | 6.52 |
| 1.61 | 6.52 |
| 1.61 | 6.52 |
| 1.61 | 6.52 |
| 1.61 | 6.52 |
| 1.61 | 6.52 |
| 1.61 | 6.52 |
| 1.61 | 6.52 |
| 1.61 | 6.52 |
| 1.61 | 6.52 |
| 1.61 | 6.52 |
| 1.61 | 6.52 |
| 1.61 | 6.52 |
| 1.61 | 6.52 |
| 1.61 | 6.52 |
| 1.61 | 6.52 |
| 1.61 | 6.52 |
| 1.61 | 6.52 |
| 1.61 | 6.52 |
| 1.61 | 6.52 |
| 1.61 | 6.52 |
| 1.61 | 6.52 |
| 1.61 | 6.52 |
| 1.61 | 6.52 |
| 1.61 | 6.52 |
| 1.61 | 6.52 |
| 1.61 | 6.52 |
| 1.61 | 6.52 |
| 1.61 | 6.52 |
| 1.61 | 6.52 |
| 1.61 | 6.52 |
| 1.61 | 6.52 |
| 1.61 | 6.52 |
| 1.61 | 6.52 |
| 1.61 | 6.52 |
| 1.61 | 6.52 |
| 1.61 | 6.52 |
| 1.61 | 6.52 |
| 1.61 | 6.52 |
| 1.61 | 6.52 |
| 1.61 | 6.52 |
| 1.61 | 6.52 |
| 1.61 | 6.52 |
| 1.61 | 6.52 |
| 1.61 | 6.52 |
| 1.61 | 6.52 |
| 1.61 | 6.52 |
| 1.61 | 6.52 |
| 1.61 | 6.52 |
| 1.61 | 6.52 |
| 1.61 | 6.52 |
| 1.61 | 6.52 |
| 1.61 | 6.52 |
| 1.61 | 6.52 |
| 1.61 | 6.52 |
| 1.61 | 6.52 |
| 1.61 | 6.52 |
| 1.61 | 6.52 |
| 1.61 | 6.52 |
| 1.61 | 6.52 |
| 1.61 | 6.52 |
| 1.61 | 6.52 |
| 1.61 | 6.52 |
| 1.61 | 6.52 |
| 1.61 | 6.52 |
| 1.61 | 6.52 |
| 1.61 | 6.52 |
| 1.61 | 6.52 |
| 1.61 | 6.52 |
| 1.61 | 6.52 |
| 1.61 | 6.52 |
| 1.61 | 6.52 |
| 1.61 | 6.52 |
| 1.61 | 6.52 |
| 1.61 | 6.52 |
| 1.61 | 6.52 |
| 1.61 | 6.52 |
| 1.61 | 6.52 |
| 1.61 | 6.52 |
| 1.61 | 6.52 |
| 1.61 | 6.52 |
| 1.61 | 6.52 |
| 1.61 | 6.52 |
| 1.61 | 6.52 |
| 1.61 | 6.52 |
| 1.61 | 6.52 |
| 1.61 | 6.52 |
| 1.61 | 6.52 |
| 1.61 | 6.52 |
| 1.61 | 6.52 |
| 1.61 | 6.52 |
| 1.61 | 6.52 |
| 1.61 | 6.52 |
| 1.61 | 6.52 |
| 1.61 | 6.52 |
| 1.61 | 6.52 |
| 1.61 | 6.52 |
| 1.61 | 6.52 |
| 1.61 | 6.52 |
| 1.61 | 6.52 |
| 1.61 | 6.52 |
| 1.61 | 6.52 |
| 1.61 | 6.52 |
| 1.61 | 6.52 |
| 1.61 | 6.52 |
| 1.61 | 6.52 |
| 1.61 | 6.52 |
| 1.61 | 6.52 |
| 1.61 | 6.52 |
| 1.61 | 6.52 |
| 1.61 | 6.52 |
| 1.61 | 6.52 |
| 1.61 | 6.52 |
| 1.61 | 6.52 |
| 1.61 | 6.52 |
| 1.61 | 6.52 |
| 1.61 | 6.52 |
| 1.61 | 6.52 |
| 1.61 | 6.52 |
| 1.61 | 6.52 |
| 1.61 | 6.52 |
| 1.61 | 6.52 |
| 1.61 | 6.52 |
| 1.61 | 6.52 |
| 1.61 | 6.52 |
| 1.61 | 6.52 |
| 1.61 | 6.52 |
| 1.61 | 6.52 |
| 1.61 | 6.52 |
| 1.61 | 6.52 |
| 1.61 | 6.52 |
| 1.61 | 6.52 |
| 1.61 | 6.52 |
| 1.61 | 6.52 |
| 1.61 | 6.52 |
| 1.61 | 6.52 |
| 1.61 | 6.52 |
| 1.61 | 6.52 |
| 1.61 | 6.52 |
| 1.61 | 6.52 |
| 1.61 | 6.52 |
| 1.61 | 6.52 |
| 1.61 | 6.52 |
| 1.61 | 6.52 |
| 1.61 | 6.52 |
| 1.61 | 6.52 |
| 1.61 | 6.52 |
| 1.61 | 6.52 |
| 1.61 | 6.52 |
| 1.61 | 6.52 |
| 1.61 | 6.52 |
| 1.61 | 6.52 |
| 1.61 | 6.52 |
| 1.61 | 6.52 |
| 1.61 | 6.52 |
| 1.61 | 6.52 |
| 1.61 | 6.52 |
| 1.61 | 6.52 |
| 1.61 | 6.52 |
| 1.61 | 6.52 |
| 1.61 | 6.52 |
| 1.61 | 6.52 |
| 1.61 | 6.52 |
| 1.61 | 6.52 |
| 1.61 | 6.52 |
| 1.61 | 6.52 |
| 1.61 | 6.52 |
| 1.61 | 6.52 |
| 1.61 | 6.52 |
| 1.61 | 6.52 |
| 1.61 | 6.52 |
| 1.61 | 6.52 |
| 1.61 | 6.52 |
| 1.61 | 6.52 |
| 1.61 | 6.52 |
| 1.61 | 6.52 |
| 1.61 | 6.52 |
| 1.61 | 6.52 |
| 1.61 | 6.52 |
| 1.61 | 6.52 |
| 1.61 | 6.52 |
| 1.61 | 6.52 |
| 1.61 | 6.52 |
| 1.61 | 6.52 |
| 1.61 | 6.52 |
| 1.61 | 6.52 |
| 1.61 | 6.52 |
| 1.61 | 6.52 |
| 1.61 | 6.52 |
| 1.61 | 6.52 |
| 1.61 | 6.52 |
| 1.61 | 6.52 |
| 1.61 | 6.52 |
| 1.61 | 6.52 |
| 1.61 | 6.52 |
| 1.61 | 6.52 |
| 1.61 | 6.52 |
| 1.61 | 6.52 |
| 1.61 | 6.52 |
| 1.61 | 6.52 |
| 1.61 | 6.52 |
| 1.61 | 6.52 |
| 1.61 | 6.52 |
| 1.61 | 6.52 |
| 1.61 | 6.52 |
| 1.61 | 6.52 |
| 1.61 | 6.52 |
| 1.61 | 6.52 |
| 1.61 | 6.52 |
| 1.61 | 6.52 |
| 1.61 | 6.52 |
| 1.61 | 6.52 |
| 1.61 | 6.52 |
| 1.61 | 6.52 |
| 1.61 | 6.52 |
| 1.61 | 6.52 |
| 1.61 | 6.52 |
| 1.61 | 6.52 |
| 1.61 | 6.52 |
| 1.61 | 6.52 |
| 1.61 | 6.52 |
| 1.61 | 6.52 |
| 1.61 | 6.52 |
| 1.61 | 6.52 |
| 1.61 | 6.52 |
| 1.61 | 6.52 |
| 1.61 | 6.52 |
| 1.61 | 6.52 |
| 1.61 | 6.52 |
| 1.61 | 6.52 |
| 1.61 | 6.52 |
| 1.61 | 6.52 |
| 1.61 | 6.52 |
| 1.61 | 6.52 |
| 1.61 | 6.52 |
| 1.61 | 6.52 |
| 1.61 | 6.52 |
| 1.61 | 6.52 |
| 1.61 | 6.52 |
| 1.61 | 6.52 |
| 1.39 | 6.75 |
| 1.39 | 6.75 |
| 1.39 | 6.75 |
| 1.39 | 6.75 |
| 1.39 | 6.75 |
| 1.39 | 6.75 |
| 1.39 | 6.75 |
| 1.39 | 6.75 |
| 1.39 | 6.75 |
| 1.39 | 6.75 |
| 1.39 | 6.75 |
| 1.39 | 6.75 |
| 1.39 | 6.75 |
| 1.39 | 6.75 |
| 1.39 | 6.75 |
| 1.39 | 6.75 |
| 1.39 | 6.75 |
| 1.39 | 6.75 |
| 1.39 | 6.75 |
| 1.39 | 6.75 |
| 1.39 | 6.75 |
| 1.39 | 6.75 |
| 1.39 | 6.75 |
| 1.39 | 6.75 |
| 1.39 | 6.75 |
| 1.39 | 6.75 |
| 1.39 | 6.75 |
| 1.39 | 6.75 |
| 1.39 | 6.75 |
| 1.39 | 6.75 |
| 1.39 | 6.75 |
| 1.39 | 6.75 |
| 1.39 | 6.75 |
| 1.39 | 6.75 |
| 1.39 | 6.75 |
| 1.39 | 6.75 |
| 1.39 | 6.75 |
| 1.39 | 6.75 |
| 1.39 | 6.75 |
| 1.39 | 6.75 |
| 1.39 | 6.75 |
| 1.39 | 6.75 |
| 1.39 | 6.75 |
| 1.39 | 6.75 |
| 1.39 | 6.75 |
| 1.39 | 6.75 |
| 1.39 | 6.75 |
| 1.39 | 6.75 |
| 1.39 | 6.75 |
| 1.39 | 6.75 |
| 1.39 | 6.75 |
| 1.39 | 6.75 |
| 1.39 | 6.75 |
| 1.39 | 6.75 |
| 1.39 | 6.75 |
| 1.39 | 6.75 |
| 1.39 | 6.75 |
| 1.39 | 6.75 |
| 1.39 | 6.75 |
| 1.39 | 6.75 |
| 1.39 | 6.75 |
| 1.39 | 6.75 |
| 1.39 | 6.75 |
| 1.39 | 6.75 |
| 1.39 | 6.75 |
| 1.39 | 6.75 |
| 1.39 | 6.75 |
| 1.39 | 6.75 |
| 1.39 | 6.75 |
| 1.39 | 6.75 |
| 1.39 | 6.75 |
| 1.39 | 6.75 |
| 1.39 | 6.75 |
| 1.39 | 6.75 |
| 1.39 | 6.75 |
| 1.39 | 6.75 |
| 1.39 | 6.75 |
| 1.39 | 6.75 |
| 1.39 | 6.75 |
| 1.39 | 6.75 |
| 1.39 | 6.75 |
| 1.39 | 6.75 |
| 1.39 | 6.75 |
| 1.39 | 6.75 |
| 1.39 | 6.75 |
| 1.39 | 6.75 |
| 1.39 | 6.75 |
| 1.39 | 6.75 |
| 1.39 | 6.75 |
| 1.39 | 6.75 |
| 1.39 | 6.75 |
| 1.39 | 6.75 |
| 1.39 | 6.75 |
| 1.39 | 6.75 |
| 1.39 | 6.75 |
| 1.39 | 6.75 |
| 1.39 | 6.75 |
| 1.39 | 6.75 |
| 1.39 | 6.75 |
| 1.39 | 6.75 |
| 1.39 | 6.75 |
| 1.39 | 6.75 |
| 1.39 | 6.75 |
| 1.39 | 6.75 |
| 1.39 | 6.75 |
| 1.39 | 6.75 |
| 1.39 | 6.75 |
| 1.39 | 6.75 |
| 1.39 | 6.75 |
| 1.39 | 6.75 |
| 1.39 | 6.75 |
| 1.39 | 6.75 |
| 1.39 | 6.75 |
| 1.39 | 6.75 |
| 1.39 | 6.75 |
| 1.39 | 6.75 |
| 1.39 | 6.75 |
| 1.39 | 6.75 |
| 1.39 | 6.75 |
| 1.39 | 6.75 |
| 1.39 | 6.75 |
| 1.39 | 6.75 |
| 1.39 | 6.75 |
| 1.39 | 6.75 |
| 1.39 | 6.75 |
| 1.39 | 6.75 |
| 1.39 | 6.75 |
| 1.39 | 6.75 |
| 1.39 | 6.75 |
| 1.39 | 6.75 |
| 1.39 | 6.75 |
| 1.39 | 6.75 |
| 1.39 | 6.75 |
| 1.39 | 6.75 |
| 1.39 | 6.75 |
| 1.39 | 6.75 |
| 1.39 | 6.75 |
| 1.39 | 6.75 |
| 1.39 | 6.75 |
| 1.39 | 6.75 |
| 1.39 | 6.75 |
| 1.39 | 6.75 |
| 1.39 | 6.75 |
| 1.39 | 6.75 |
| 1.39 | 6.75 |
| 1.39 | 6.75 |
| 1.39 | 6.75 |
| 1.39 | 6.75 |
| 1.39 | 6.75 |
| 1.39 | 6.75 |
| 1.39 | 6.75 |
| 1.39 | 6.75 |
| 1.39 | 6.75 |
| 1.39 | 6.75 |
| 1.39 | 6.75 |
| 1.39 | 6.75 |
| 1.39 | 6.75 |
| 1.39 | 6.75 |
| 1.39 | 6.75 |
| 1.39 | 6.75 |
| 1.39 | 6.75 |
| 1.39 | 6.75 |
| 1.39 | 6.75 |
| 1.39 | 6.75 |
| 1.39 | 6.75 |
| 1.39 | 6.75 |
| 1.39 | 6.75 |
| 1.39 | 6.75 |
| 1.39 | 6.75 |
| 1.39 | 6.75 |
| 1.39 | 6.75 |
| 1.39 | 6.75 |
| 1.39 | 6.75 |
| 1.39 | 6.75 |
| 1.39 | 6.75 |
| 1.39 | 6.75 |
| 1.39 | 6.75 |
| 1.39 | 6.75 |
| 1.39 | 6.75 |
| 1.39 | 6.75 |
| 1.39 | 6.75 |
| 1.39 | 6.75 |
| 1.39 | 6.75 |
| 1.39 | 6.75 |
| 1.39 | 6.75 |
| 1.39 | 6.75 |
| 1.39 | 6.75 |
| 1.39 | 6.75 |
| 1.39 | 6.75 |
| 1.39 | 6.75 |
| 1.39 | 6.75 |
| 1.39 | 6.75 |
| 1.39 | 6.75 |
| 1.39 | 6.75 |
| 1.39 | 6.75 |
| 1.39 | 6.75 |
| 1.39 | 6.75 |
| 1.39 | 6.75 |
| 1.39 | 6.75 |
| 1.39 | 6.75 |
| 1.39 | 6.75 |
| 1.39 | 6.75 |
| 1.39 | 6.75 |
| 1.39 | 6.75 |
| 1.39 | 6.75 |
| 1.39 | 6.75 |
| 1.39 | 6.75 |
| 1.39 | 6.75 |
| 1.39 | 6.75 |
| 1.39 | 6.75 |
| 1.39 | 6.75 |
| 1.39 | 6.75 |
| 1.39 | 6.75 |
| 1.39 | 6.75 |
| 1.39 | 6.75 |
| 1.39 | 6.75 |
| 1.39 | 6.75 |
| 1.39 | 6.75 |
| 1.39 | 6.75 |
| 1.39 | 6.75 |
| 1.39 | 6.75 |
| 1.39 | 6.75 |
| 1.39 | 6.75 |
| 1.39 | 6.75 |
| 1.39 | 6.75 |
| 1.39 | 6.75 |
| 1.39 | 6.75 |
| 1.39 | 6.75 |
| 1.39 | 6.75 |
| 1.39 | 6.75 |
| 1.39 | 6.75 |
| 1.39 | 6.75 |
| 1.39 | 6.75 |
| 1.39 | 6.75 |
| 1.39 | 6.75 |
| 1.39 | 6.75 |
| 1.39 | 6.75 |
| 1.39 | 6.75 |
| 1.39 | 6.75 |
| 1.39 | 6.75 |
| 1.39 | 6.75 |
| 1.39 | 6.75 |
| 1.39 | 6.75 |
| 1.39 | 6.75 |
| 1.39 | 6.75 |
| 1.39 | 6.75 |
| 1.39 | 6.75 |
| 1.39 | 6.75 |
| 1.39 | 6.75 |
| 1.39 | 6.75 |
| 1.39 | 6.75 |
| 1.39 | 6.75 |
| 1.39 | 6.75 |
| 1.39 | 6.75 |
| 1.39 | 6.75 |
| 1.39 | 6.75 |
| 1.39 | 6.75 |
| 1.39 | 6.75 |
| 1.39 | 6.75 |
| 1.39 | 6.75 |
| 1.39 | 6.75 |
| 1.39 | 6.75 |
| 1.39 | 6.75 |
| 1.39 | 6.75 |
| 1.39 | 6.75 |
| 1.39 | 6.75 |
| 1.39 | 6.75 |
| 1.39 | 6.75 |
| 1.39 | 6.75 |
| 1.39 | 6.75 |
| 1.39 | 6.75 |
| 1.39 | 6.75 |
| 1.39 | 6.75 |
| 1.39 | 6.75 |
| 1.39 | 6.75 |
| 1.39 | 6.75 |
| 1.39 | 6.75 |
| 1.39 | 6.75 |
| 1.39 | 6.75 |
| 1.39 | 6.75 |
| 1.39 | 6.75 |
| 1.39 | 6.75 |
| 1.39 | 6.75 |
| 1.39 | 6.75 |
| 1.39 | 6.75 |
| 1.39 | 6.75 |
| 1.39 | 6.75 |
| 1.39 | 6.75 |
| 1.39 | 6.75 |
| 1.39 | 6.75 |
| 1.39 | 6.75 |
| 1.39 | 6.75 |
| 1.39 | 6.75 |
| 1.39 | 6.75 |
| 1.39 | 6.75 |
| 1.39 | 6.75 |
| 1.39 | 6.75 |
| 1.39 | 6.75 |
| 1.39 | 6.75 |
| 1.39 | 6.75 |
| 1.39 | 6.75 |
| 1.39 | 6.75 |
| 1.39 | 6.75 |
| 1.39 | 6.75 |
| 1.39 | 6.75 |
| 1.39 | 6.75 |
| 1.39 | 6.75 |
| 1.39 | 6.75 |
| 1.39 | 6.75 |
| 1.39 | 6.75 |
| 1.39 | 6.75 |
| 1.39 | 6.75 |
| 1.39 | 6.75 |
| 1.39 | 6.75 |
| 1.39 | 6.75 |
| 1.39 | 6.75 |
| 1.39 | 6.75 |
| 1.39 | 6.75 |
| 1.39 | 6.75 |
| 1.39 | 6.75 |
| 1.39 | 6.75 |
| 1.39 | 6.75 |
| 1.39 | 6.75 |
| 1.39 | 6.75 |
| 1.39 | 6.75 |
| 1.39 | 6.75 |
| 1.39 | 6.75 |
| 1.39 | 6.75 |
| 1.39 | 6.75 |
| 1.39 | 6.75 |
| 1.39 | 6.75 |
| 1.39 | 6.75 |
| 1.39 | 6.75 |
| 1.39 | 6.75 |
| 1.39 | 6.75 |
| 1.39 | 6.75 |
| 1.39 | 6.75 |
| 1.39 | 6.75 |
| 1.39 | 6.75 |
| 1.39 | 6.75 |
| 1.39 | 6.75 |
| 1.39 | 6.75 |
| 1.39 | 6.75 |
| 1.39 | 6.75 |
| 1.39 | 6.75 |
| 1.39 | 6.75 |
| 1.39 | 6.75 |
| 1.39 | 6.75 |
| 1.39 | 6.75 |
| 1.39 | 6.75 |
| 1.39 | 6.75 |
| 1.39 | 6.75 |
| 1.39 | 6.75 |
| 1.39 | 6.75 |
| 1.39 | 6.75 |
| 1.39 | 6.75 |
| 1.39 | 6.75 |
| 1.39 | 6.75 |
| 1.39 | 6.75 |
| 1.39 | 6.75 |
| 1.39 | 6.75 |
| 1.39 | 6.75 |
| 1.39 | 6.75 |
| 1.39 | 6.75 |
| 1.39 | 6.75 |
| 1.39 | 6.75 |
| 1.39 | 6.75 |
| 1.39 | 6.75 |
| 1.39 | 6.75 |
| 1.39 | 6.75 |
| 1.39 | 6.75 |
| 1.39 | 6.75 |
| 1.39 | 6.75 |
| 1.39 | 6.75 |
| 1.39 | 6.75 |
| 1.39 | 6.75 |
| 1.39 | 6.75 |
| 1.39 | 6.75 |
| 1.39 | 6.75 |
| 1.39 | 6.75 |
| 1.39 | 6.75 |
| 1.39 | 6.75 |
| 1.39 | 6.75 |
| 1.39 | 6.75 |
| 1.39 | 6.75 |
| 1.39 | 6.75 |
| 1.39 | 6.75 |
| 1.39 | 6.75 |
| 1.39 | 6.75 |
| 1.39 | 6.75 |
| 1.39 | 6.75 |
| 1.39 | 6.75 |
| 1.39 | 6.75 |
| 1.39 | 6.75 |
| 1.39 | 6.75 |
| 1.39 | 6.75 |
| 1.39 | 6.75 |
| 1.39 | 6.75 |
| 1.39 | 6.75 |
| 1.39 | 6.75 |
| 1.39 | 6.75 |
| 1.39 | 6.75 |
| 1.39 | 6.75 |
| 1.39 | 6.75 |
| 1.39 | 6.75 |
| 1.39 | 6.75 |
| 1.39 | 6.75 |
| 1.39 | 6.75 |
| 1.39 | 6.75 |
| 1.39 | 6.75 |
| 1.39 | 6.75 |
| 1.39 | 6.75 |
| 1.39 | 6.75 |
| 1.39 | 6.75 |
| 1.39 | 6.75 |
| 1.39 | 6.75 |
| 1.39 | 6.75 |
| 1.39 | 6.75 |
| 1.39 | 6.75 |
| 1.39 | 6.75 |
| 1.39 | 6.75 |
| 1.39 | 6.75 |
| 1.39 | 6.75 |
| 1.39 | 6.75 |
| 1.39 | 6.75 |
| 1.39 | 6.75 |
| 1.39 | 6.75 |
| 1.39 | 6.75 |
| 1.39 | 6.75 |
| 1.39 | 6.75 |
| 1.39 | 6.75 |
| 1.39 | 6.75 |
| 1.39 | 6.75 |
| 1.39 | 6.75 |
| 1.39 | 6.75 |
| 1.39 | 6.75 |
| 1.39 | 6.75 |
| 1.39 | 6.75 |
| 1.39 | 6.75 |
| 1.39 | 6.75 |
| 1.39 | 6.75 |
| 1.39 | 6.75 |
| 1.39 | 6.75 |
| 1.39 | 6.75 |
| 1.39 | 6.75 |
| 1.39 | 6.75 |
| 1.39 | 6.75 |
| 1.39 | 6.75 |
| 1.39 | 6.75 |
| 1.39 | 6.75 |
| 1.39 | 6.75 |
| 1.39 | 6.75 |
| 1.39 | 6.75 |
| 1.39 | 6.75 |
| 1.39 | 6.75 |
| 1.39 | 6.75 |
| 1.39 | 6.75 |
| 1.39 | 6.75 |
| 1.39 | 6.75 |
| 1.39 | 6.75 |
| 1.39 | 6.75 |
| 1.39 | 6.75 |
| 1.39 | 6.75 |
| 1.39 | 6.75 |
| 1.39 | 6.75 |
| 1.39 | 6.75 |
| 1.39 | 6.75 |
| 1.39 | 6.75 |
| 1.39 | 6.75 |
| 1.39 | 6.75 |
| 1.39 | 6.75 |
| 1.39 | 6.75 |
| 1.39 | 6.75 |
| 1.39 | 6.75 |
| 1.39 | 6.75 |
| 1.39 | 6.75 |
| 1.39 | 6.75 |
| 1.39 | 6.75 |
| 1.39 | 6.75 |
| 1.39 | 6.75 |
| 1.39 | 6.75 |
| 1.39 | 6.75 |
| 1.39 | 6.75 |
| 1.39 | 6.75 |
| 1.39 | 6.75 |
| 1.39 | 6.75 |
| 1.39 | 6.75 |
| 1.39 | 6.75 |
| 1.39 | 6.75 |
| 1.39 | 6.75 |
| 1.39 | 6.75 |
| 1.39 | 6.75 |
| 1.39 | 6.75 |
| 1.39 | 6.75 |
| 1.39 | 6.75 |
| 1.39 | 6.75 |
| 1.39 | 6.75 |
| 1.39 | 6.75 |
| 1.39 | 6.75 |
| 1.39 | 6.75 |
| 1.39 | 6.75 |
| 1.39 | 6.75 |
| 1.39 | 6.75 |
| 1.39 | 6.75 |
| 1.39 | 6.75 |
| 1.39 | 6.75 |
| 1.39 | 6.75 |
| 1.39 | 6.75 |
| 1.39 | 6.75 |
| 1.39 | 6.75 |
| 1.39 | 6.75 |
| 1.39 | 6.75 |
| 1.39 | 6.75 |
| 1.39 | 6.75 |
| 1.39 | 6.75 |
| 1.39 | 6.75 |
| 1.39 | 6.75 |
| 1.39 | 6.75 |
| 1.39 | 6.75 |
| 1.39 | 6.75 |
| 1.39 | 6.75 |
| 1.39 | 6.75 |
| 1.39 | 6.75 |
| 1.39 | 6.75 |
| 1.39 | 6.75 |
| 1.39 | 6.75 |
| 1.39 | 6.75 |
| 1.39 | 6.75 |
| 1.39 | 6.75 |
| 1.39 | 6.75 |
| 1.39 | 6.75 |
| 1.39 | 6.75 |
| 1.39 | 6.75 |
| 1.39 | 6.75 |
| 1.39 | 6.75 |
| 1.39 | 6.75 |
| 1.39 | 6.75 |
| 1.39 | 6.75 |
| 1.39 | 6.75 |
| 1.39 | 6.75 |
| 1.39 | 6.75 |
| 1.39 | 6.75 |
| 1.39 | 6.75 |
| 1.39 | 6.75 |
| 1.39 | 6.75 |
| 1.39 | 6.75 |
| 1.39 | 6.75 |
| 1.39 | 6.75 |
| 1.39 | 6.75 |
| 1.39 | 6.75 |
| 1.39 | 6.75 |
| 1.39 | 6.75 |
| 1.39 | 6.75 |
| 1.39 | 6.75 |
| 1.39 | 6.75 |
| 1.39 | 6.75 |
| 1.39 | 6.75 |
| 1.39 | 6.75 |
| 1.39 | 6.75 |
| 1.39 | 6.75 |
| 1.39 | 6.75 |
| 1.39 | 6.75 |
| 1.39 | 6.75 |
| 1.39 | 6.75 |
| 1.39 | 6.75 |
| 1.39 | 6.75 |
| 1.39 | 6.75 |
| 1.39 | 6.75 |
| 1.39 | 6.75 |
| 1.39 | 6.75 |
| 1.39 | 6.75 |
| 1.39 | 6.75 |
| 1.39 | 6.75 |
| 1.39 | 6.75 |
| 1.39 | 6.75 |
| 1.39 | 6.75 |
| 1.39 | 6.75 |
| 1.39 | 6.75 |
| 1.39 | 6.75 |
| 1.39 | 6.75 |
| 1.39 | 6.75 |
| 1.39 | 6.75 |
| 1.39 | 6.75 |
| 1.39 | 6.75 |
| 1.39 | 6.75 |
| 1.39 | 6.75 |
| 1.39 | 6.75 |
| 1.39 | 6.75 |
| 1.39 | 6.75 |
| 1.39 | 6.75 |
| 1.39 | 6.75 |
| 1.39 | 6.75 |
| 1.39 | 6.75 |
| 1.39 | 6.75 |
| 1.39 | 6.75 |
| 1.39 | 6.75 |
| 1.39 | 6.75 |
| 1.39 | 6.75 |
| 1.39 | 6.75 |
| 1.39 | 6.75 |
| 1.39 | 6.75 |
| 1.39 | 6.75 |
| 1.39 | 6.75 |
| 1.39 | 6.75 |
| 1.39 | 6.75 |
| 1.39 | 6.75 |
| 1.39 | 6.75 |
| 1.39 | 6.75 |
| 1.39 | 6.75 |
| 1.39 | 6.75 |
| 1.39 | 6.75 |
| 1.39 | 6.75 |
| 1.39 | 6.75 |
| 1.39 | 6.75 |
| 1.39 | 6.75 |
| 1.39 | 6.75 |
| 1.39 | 6.75 |
| 1.39 | 6.75 |
| 1.39 | 6.75 |
| 1.39 | 6.75 |
| 1.39 | 6.75 |
| 1.39 | 6.75 |
| 1.39 | 6.75 |
| 1.39 | 6.75 |
| 1.39 | 6.75 |
| 1.39 | 6.75 |
| 1.39 | 6.75 |
| 1.39 | 6.75 |
| 1.39 | 6.75 |
| 1.39 | 6.75 |
| 1.39 | 6.75 |
| 1.39 | 6.75 |
| 1.39 | 6.75 |
| 1.39 | 6.75 |
| 1.39 | 6.75 |
| 1.39 | 6.75 |
| 1.39 | 6.75 |
| 1.39 | 6.75 |
| 1.39 | 6.75 |
| 1.39 | 6.75 |
| 1.39 | 6.75 |
| 1.39 | 6.75 |
| 1.39 | 6.75 |
| 1.39 | 6.75 |
| 1.39 | 6.75 |
| 1.39 | 6.75 |
| 1.39 | 6.75 |
| 1.39 | 6.75 |
| 1.39 | 6.75 |
| 1.39 | 6.75 |
| 1.39 | 6.75 |
| 1.39 | 6.75 |
| 1.39 | 6.75 |
| 1.39 | 6.75 |
| 1.39 | 6.75 |
| 1.39 | 6.75 |
| 1.39 | 6.75 |
| 1.39 | 6.75 |
| 1.39 | 6.75 |
| 1.39 | 6.75 |
| 1.39 | 6.75 |
| 1.39 | 6.75 |
| 1.39 | 6.75 |
| 1.39 | 6.75 |
| 1.39 | 6.75 |
| 1.39 | 6.75 |
| 1.39 | 6.75 |
| 1.39 | 6.75 |
| 1.39 | 6.75 |
| 1.39 | 6.75 |
| 1.39 | 6.75 |
| 1.39 | 6.75 |
| 1.39 | 6.75 |
| 1.39 | 6.75 |
| 1.39 | 6.75 |
| 1.39 | 6.75 |
| 1.39 | 6.75 |
| 1.39 | 6.75 |
| 1.39 | 6.75 |
| 1.39 | 6.75 |
| 1.39 | 6.75 |
| 1.39 | 6.75 |
| 1.39 | 6.75 |
| 1.39 | 6.75 |
| 1.39 | 6.75 |
| 1.39 | 6.75 |
| 1.39 | 6.75 |
| 1.39 | 6.75 |
| 1.39 | 6.75 |
| 1.39 | 6.75 |
| 1.39 | 6.75 |
| 1.39 | 6.75 |
| 1.39 | 6.75 |
| 1.39 | 6.75 |
| 1.39 | 6.75 |
| 1.39 | 6.75 |
| 1.39 | 6.75 |
| 1.39 | 6.75 |
| 1.39 | 6.75 |
| 1.39 | 6.75 |
| 1.39 | 6.75 |
| 1.39 | 6.75 |
| 1.39 | 6.75 |
| 1.39 | 6.75 |
| 1.39 | 6.75 |
| 1.39 | 6.75 |
| 1.39 | 6.75 |
| 1.39 | 6.75 |
| 1.39 | 6.75 |
| 1.39 | 6.75 |
| 1.39 | 6.75 |
| 1.39 | 6.75 |
| 1.39 | 6.75 |
| 1.39 | 6.75 |
| 1.39 | 6.75 |
| 1.39 | 6.75 |
| 1.39 | 6.75 |
| 1.39 | 6.75 |
| 1.39 | 6.75 |
| 1.39 | 6.75 |
| 1.39 | 6.75 |
| 1.39 | 6.75 |
| 1.39 | 6.75 |
| 1.39 | 6.75 |
| 1.39 | 6.75 |
| 1.39 | 6.75 |
| 1.39 | 6.75 |
| 1.39 | 6.75 |
| 1.39 | 6.75 |
| 1.39 | 6.75 |
| 1.39 | 6.75 |
| 1.39 | 6.75 |
| 1.39 | 6.75 |
| 1.39 | 6.75 |
| 1.39 | 6.75 |
| 1.39 | 6.75 |
| 1.39 | 6.75 |
| 1.39 | 6.75 |
| 1.39 | 6.75 |
| 1.39 | 6.75 |
| 1.39 | 6.75 |
| 1.39 | 6.75 |
| 1.39 | 6.75 |
| 1.39 | 6.75 |
| 1.39 | 6.75 |
| 1.39 | 6.75 |
| 1.39 | 6.75 |
| 1.39 | 6.75 |
| 1.39 | 6.75 |
| 1.39 | 6.75 |
| 1.39 | 6.75 |
| 1.39 | 6.75 |
| 1.39 | 6.75 |
| 1.39 | 6.75 |
| 1.39 | 6.75 |
| 1.39 | 6.75 |
| 1.39 | 6.75 |
| 1.39 | 6.75 |
| 1.39 | 6.75 |
| 1.39 | 6.75 |
| 1.39 | 6.75 |
| 1.39 | 6.75 |
| 1.39 | 6.75 |
| 1.39 | 6.75 |
| 1.39 | 6.75 |
| 1.39 | 6.75 |
| 1.39 | 6.75 |
| 1.39 | 6.75 |
| 1.39 | 6.75 |
| 1.39 | 6.75 |
| 1.39 | 6.75 |
| 1.39 | 6.75 |
| 1.39 | 6.75 |
| 1.39 | 6.75 |
| 1.39 | 6.75 |
| 1.39 | 6.75 |
| 1.39 | 6.75 |
| 1.39 | 6.75 |
| 1.39 | 6.75 |
| 1.39 | 6.75 |
| 1.39 | 6.75 |
| 1.39 | 6.75 |
| 1.39 | 6.75 |
| 1.39 | 6.75 |
| 1.39 | 6.75 |
| 1.39 | 6.75 |
| 1.39 | 6.75 |
| 1.39 | 6.75 |
| 1.39 | 6.75 |
| 1.39 | 6.75 |
| 1.39 | 6.75 |
| 1.39 | 6.75 |
| 1.39 | 6.75 |
| 1.39 | 6.75 |
| 1.39 | 6.75 |
| 1.39 | 6.75 |
| 1.39 | 6.75 |
| 1.39 | 6.75 |
| 1.39 | 6.75 |
| 1.39 | 6.75 |
| 1.39 | 6.75 |
| 1.39 | 6.75 |
| 1.39 | 6.75 |
| 1.39 | 6.75 |
| 1.39 | 6.75 |
| 1.39 | 6.75 |
| 1.39 | 6.75 |
| 1.39 | 6.75 |
| 1.39 | 6.75 |
| 1.39 | 6.75 |
| 1.39 | 6.75 |
| 1.39 | 6.75 |
| 1.39 | 6.75 |
| 1.39 | 6.75 |
| 1.39 | 6.75 |
| 1.39 | 6.75 |
| 1.39 | 6.75 |
| 1.39 | 6.75 |
| 1.39 | 6.75 |
| 1.39 | 6.75 |
| 1.39 | 6.75 |
| 1.39 | 6.75 |
| 1.39 | 6.75 |
| 1.39 | 6.75 |
| 1.39 | 6.75 |
| 1.39 | 6.75 |
| 1.39 | 6.75 |
| 1.39 | 6.75 |
| 1.39 | 6.75 |
| 1.39 | 6.75 |
| 1.39 | 6.75 |
| 1.39 | 6.75 |
| 1.39 | 6.75 |
| 1.39 | 6.75 |
| 1.39 | 6.75 |
| 1.39 | 6.75 |
| 1.39 | 6.75 |
| 1.39 | 6.75 |
| 1.39 | 6.75 |
| 1.39 | 6.75 |
| 1.39 | 6.75 |
| 1.39 | 6.75 |
| 1.39 | 6.75 |
| 1.39 | 6.75 |
| 1.39 | 6.75 |
| 1.39 | 6.75 |
| 1.39 | 6.75 |
| 1.39 | 6.75 |
| 1.39 | 6.75 |
| 1.39 | 6.75 |
| 1.39 | 6.75 |
| 1.39 | 6.75 |
| 1.39 | 6.75 |
| 1.39 | 6.75 |
| 1.1 | 6.81 |
| 1.1 | 6.81 |
| 1.1 | 6.81 |
| 1.1 | 6.81 |
| 1.1 | 6.81 |
| 1.1 | 6.81 |
| 1.1 | 6.81 |
| 1.1 | 6.81 |
| 1.1 | 6.81 |
| 1.1 | 6.81 |
| 1.1 | 6.81 |
| 1.1 | 6.81 |
| 1.1 | 6.81 |
| 1.1 | 6.81 |
| 1.1 | 6.81 |
| 1.1 | 6.81 |
| 1.1 | 6.81 |
| 1.1 | 6.81 |
| 1.1 | 6.81 |
| 1.1 | 6.81 |
| 1.1 | 6.81 |
| 1.1 | 6.81 |
| 1.1 | 6.81 |
| 1.1 | 6.81 |
| 1.1 | 6.81 |
| 1.1 | 6.81 |
| 1.1 | 6.81 |
| 1.1 | 6.81 |
| 1.1 | 6.81 |
| 1.1 | 6.81 |
| 1.1 | 6.81 |
| 1.1 | 6.81 |
| 1.1 | 6.81 |
| 1.1 | 6.81 |
| 1.1 | 6.81 |
| 1.1 | 6.81 |
| 1.1 | 6.81 |
| 1.1 | 6.81 |
| 1.1 | 6.81 |
| 1.1 | 6.81 |
| 1.1 | 6.81 |
| 1.1 | 6.81 |
| 1.1 | 6.81 |
| 1.1 | 6.81 |
| 1.1 | 6.81 |
| 1.1 | 6.81 |
| 1.1 | 6.81 |
| 1.1 | 6.81 |
| 1.1 | 6.81 |
| 1.1 | 6.81 |
| 1.1 | 6.81 |
| 1.1 | 6.81 |
| 1.1 | 6.81 |
| 1.1 | 6.81 |
| 1.1 | 6.81 |
| 1.1 | 6.81 |
| 1.1 | 6.81 |
| 1.1 | 6.81 |
| 1.1 | 6.81 |
| 1.1 | 6.81 |
| 1.1 | 6.81 |
| 1.1 | 6.81 |
| 1.1 | 6.81 |
| 1.1 | 6.81 |
| 1.1 | 6.81 |
| 1.1 | 6.81 |
| 1.1 | 6.81 |
| 1.1 | 6.81 |
| 1.1 | 6.81 |
| 1.1 | 6.81 |
| 1.1 | 6.81 |
| 1.1 | 6.81 |
| 1.1 | 6.81 |
| 1.1 | 6.81 |
| 1.1 | 6.81 |
| 1.1 | 6.81 |
| 1.1 | 6.81 |
| 1.1 | 6.81 |
| 1.1 | 6.81 |
| 1.1 | 6.81 |
| 1.1 | 6.81 |
| 1.1 | 6.81 |
| 1.1 | 6.81 |
| 1.1 | 6.81 |
| 1.1 | 6.81 |
| 1.1 | 6.81 |
| 1.1 | 6.81 |
| 1.1 | 6.81 |
| 1.1 | 6.81 |
| 1.1 | 6.81 |
| 1.1 | 6.81 |
| 1.1 | 6.81 |
| 1.1 | 6.81 |
| 1.1 | 6.81 |
| 1.1 | 6.81 |
| 1.1 | 6.81 |
| 1.1 | 6.81 |
| 1.1 | 6.81 |
| 1.1 | 6.81 |
| 1.1 | 6.81 |
| 1.1 | 6.81 |
| 1.1 | 6.81 |
| 1.1 | 6.81 |
| 1.1 | 6.81 |
| 1.1 | 6.81 |
| 1.1 | 6.81 |
| 1.1 | 6.81 |
| 1.1 | 6.81 |
| 1.1 | 6.81 |
| 1.1 | 6.81 |
| 1.1 | 6.81 |
| 1.1 | 6.81 |
| 1.1 | 6.81 |
| 1.1 | 6.81 |
| 1.1 | 6.81 |
| 1.1 | 6.81 |
| 1.1 | 6.81 |
| 1.1 | 6.81 |
| 1.1 | 6.81 |
| 1.1 | 6.81 |
| 1.1 | 6.81 |
| 1.1 | 6.81 |
| 1.1 | 6.81 |
| 1.1 | 6.81 |
| 1.1 | 6.81 |
| 1.1 | 6.81 |
| 1.1 | 6.81 |
| 1.1 | 6.81 |
| 1.1 | 6.81 |
| 1.1 | 6.81 |
| 1.1 | 6.81 |
| 1.1 | 6.81 |
| 1.1 | 6.81 |
| 1.1 | 6.81 |
| 1.1 | 6.81 |
| 1.1 | 6.81 |
| 1.1 | 6.81 |
| 1.1 | 6.81 |
| 1.1 | 6.81 |
| 1.1 | 6.81 |
| 1.1 | 6.81 |
| 1.1 | 6.81 |
| 1.1 | 6.81 |
| 1.1 | 6.81 |
| 1.1 | 6.81 |
| 1.1 | 6.81 |
| 1.1 | 6.81 |
| 1.1 | 6.81 |
| 1.1 | 6.81 |
| 1.1 | 6.81 |
| 1.1 | 6.81 |
| 1.1 | 6.81 |
| 1.1 | 6.81 |
| 1.1 | 6.81 |
| 1.1 | 6.81 |
| 1.1 | 6.81 |
| 1.1 | 6.81 |
| 1.1 | 6.81 |
| 1.1 | 6.81 |
| 1.1 | 6.81 |
| 1.1 | 6.81 |
| 1.1 | 6.81 |
| 1.1 | 6.81 |
| 1.1 | 6.81 |
| 1.1 | 6.81 |
| 1.1 | 6.81 |
| 1.1 | 6.81 |
| 1.1 | 6.81 |
| 1.1 | 6.81 |
| 1.1 | 6.81 |
| 1.1 | 6.81 |
| 1.1 | 6.81 |
| 1.1 | 6.81 |
| 1.1 | 6.81 |
| 1.1 | 6.81 |
| 1.1 | 6.81 |
| 1.1 | 6.81 |
| 1.1 | 6.81 |
| 1.1 | 6.81 |
| 1.1 | 6.81 |
| 1.1 | 6.81 |
| 1.1 | 6.81 |
| 1.1 | 6.81 |
| 1.1 | 6.81 |
| 1.1 | 6.81 |
| 1.1 | 6.81 |
| 1.1 | 6.81 |
| 1.1 | 6.81 |
| 1.1 | 6.81 |
| 1.1 | 6.81 |
| 1.1 | 6.81 |
| 1.1 | 6.81 |
| 1.1 | 6.81 |
| 1.1 | 6.81 |
| 1.1 | 6.81 |
| 1.1 | 6.81 |
| 1.1 | 6.81 |
| 1.1 | 6.81 |
| 1.1 | 6.81 |
| 1.1 | 6.81 |
| 1.1 | 6.81 |
| 1.1 | 6.81 |
| 1.1 | 6.81 |
| 1.1 | 6.81 |
| 1.1 | 6.81 |
| 1.1 | 6.81 |
| 1.1 | 6.81 |
| 1.1 | 6.81 |
| 1.1 | 6.81 |
| 1.1 | 6.81 |
| 1.1 | 6.81 |
| 1.1 | 6.81 |
| 1.1 | 6.81 |
| 1.1 | 6.81 |
| 1.1 | 6.81 |
| 1.1 | 6.81 |
| 1.1 | 6.81 |
| 1.1 | 6.81 |
| 1.1 | 6.81 |
| 1.1 | 6.81 |
| 1.1 | 6.81 |
| 1.1 | 6.81 |
| 1.1 | 6.81 |
| 1.1 | 6.81 |
| 1.1 | 6.81 |
| 1.1 | 6.81 |
| 1.1 | 6.81 |
| 1.1 | 6.81 |
| 1.1 | 6.81 |
| 1.1 | 6.81 |
| 1.1 | 6.81 |
| 1.1 | 6.81 |
| 1.1 | 6.81 |
| 1.1 | 6.81 |
| 1.1 | 6.81 |
| 1.1 | 6.81 |
| 1.1 | 6.81 |
| 1.1 | 6.81 |
| 1.1 | 6.81 |
| 1.1 | 6.81 |
| 1.1 | 6.81 |
| 1.1 | 6.81 |
| 1.1 | 6.81 |
| 1.1 | 6.81 |
| 1.1 | 6.81 |
| 1.1 | 6.81 |
| 1.1 | 6.81 |
| 1.1 | 6.81 |
| 1.1 | 6.81 |
| 1.1 | 6.81 |
| 1.1 | 6.81 |
| 1.1 | 6.81 |
| 1.1 | 6.81 |
| 1.1 | 6.81 |
| 1.1 | 6.81 |
| 1.1 | 6.81 |
| 1.1 | 6.81 |
| 1.1 | 6.81 |
| 1.1 | 6.81 |
| 1.1 | 6.81 |
| 1.1 | 6.81 |
| 1.1 | 6.81 |
| 1.1 | 6.81 |
| 1.1 | 6.81 |
| 1.1 | 6.81 |
| 1.1 | 6.81 |
| 1.1 | 6.81 |
| 1.1 | 6.81 |
| 1.1 | 6.81 |
| 1.1 | 6.81 |
| 1.1 | 6.81 |
| 1.1 | 6.81 |
| 1.1 | 6.81 |
| 1.1 | 6.81 |
| 1.1 | 6.81 |
| 1.1 | 6.81 |
| 1.1 | 6.81 |
| 1.1 | 6.81 |
| 1.1 | 6.81 |
| 1.1 | 6.81 |
| 1.1 | 6.81 |
| 1.1 | 6.81 |
| 1.1 | 6.81 |
| 1.1 | 6.81 |
| 1.1 | 6.81 |
| 1.1 | 6.81 |
| 1.1 | 6.81 |
| 1.1 | 6.81 |
| 1.1 | 6.81 |
| 1.1 | 6.81 |
| 1.1 | 6.81 |
| 1.1 | 6.81 |
| 1.1 | 6.81 |
| 1.1 | 6.81 |
| 1.1 | 6.81 |
| 1.1 | 6.81 |
| 1.1 | 6.81 |
| 1.1 | 6.81 |
| 1.1 | 6.81 |
| 1.1 | 6.81 |
| 1.1 | 6.81 |
| 1.1 | 6.81 |
| 1.1 | 6.81 |
| 1.1 | 6.81 |
| 1.1 | 6.81 |
| 1.1 | 6.81 |
| 1.1 | 6.81 |
| 1.1 | 6.81 |
| 1.1 | 6.81 |
| 1.1 | 6.81 |
| 1.1 | 6.81 |
| 1.1 | 6.81 |
| 1.1 | 6.81 |
| 1.1 | 6.81 |
| 1.1 | 6.81 |
| 1.1 | 6.81 |
| 1.1 | 6.81 |
| 1.1 | 6.81 |
| 1.1 | 6.81 |
| 1.1 | 6.81 |
| 1.1 | 6.81 |
| 1.1 | 6.81 |
| 1.1 | 6.81 |
| 1.1 | 6.81 |
| 1.1 | 6.81 |
| 1.1 | 6.81 |
| 1.1 | 6.81 |
| 1.1 | 6.81 |
| 1.1 | 6.81 |
| 1.1 | 6.81 |
| 1.1 | 6.81 |
| 1.1 | 6.81 |
| 1.1 | 6.81 |
| 1.1 | 6.81 |
| 1.1 | 6.81 |
| 1.1 | 6.81 |
| 1.1 | 6.81 |
| 1.1 | 6.81 |
| 1.1 | 6.81 |
| 1.1 | 6.81 |
| 1.1 | 6.81 |
| 1.1 | 6.81 |
| 1.1 | 6.81 |
| 1.1 | 6.81 |
| 1.1 | 6.81 |
| 1.1 | 6.81 |
| 1.1 | 6.81 |
| 1.1 | 6.81 |
| 1.1 | 6.81 |
| 1.1 | 6.81 |
| 1.1 | 6.81 |
| 1.1 | 6.81 |
| 1.1 | 6.81 |
| 1.1 | 6.81 |
| 1.1 | 6.81 |
| 1.1 | 6.81 |
| 1.1 | 6.81 |
| 1.1 | 6.81 |
| 1.1 | 6.81 |
| 1.1 | 6.81 |
| 1.1 | 6.81 |
| 1.1 | 6.81 |
| 1.1 | 6.81 |
| 1.1 | 6.81 |
| 1.1 | 6.81 |
| 1.1 | 6.81 |
| 1.1 | 6.81 |
| 1.1 | 6.81 |
| 1.1 | 6.81 |
| 1.1 | 6.81 |
| 1.1 | 6.81 |
| 1.1 | 6.81 |
| 1.1 | 6.81 |
| 1.1 | 6.81 |
| 1.1 | 6.81 |
| 1.1 | 6.81 |
| 1.1 | 6.81 |
| 1.1 | 6.81 |
| 1.1 | 6.81 |
| 1.1 | 6.81 |
| 1.1 | 6.81 |
| 1.1 | 6.81 |
| 1.1 | 6.81 |
| 1.1 | 6.81 |
| 1.1 | 6.81 |
| 1.1 | 6.81 |
| 1.1 | 6.81 |
| 1.1 | 6.81 |
| 1.1 | 6.81 |
| 1.1 | 6.81 |
| 1.1 | 6.81 |
| 1.1 | 6.81 |
| 1.1 | 6.81 |
| 1.1 | 6.81 |
| 1.1 | 6.81 |
| 1.1 | 6.81 |
| 1.1 | 6.81 |
| 1.1 | 6.81 |
| 1.1 | 6.81 |
| 1.1 | 6.81 |
| 1.1 | 6.81 |
| 1.1 | 6.81 |
| 1.1 | 6.81 |
| 1.1 | 6.81 |
| 1.1 | 6.81 |
| 1.1 | 6.81 |
| 1.1 | 6.81 |
| 1.1 | 6.81 |
| 1.1 | 6.81 |
| 1.1 | 6.81 |
| 1.1 | 6.81 |
| 1.1 | 6.81 |
| 1.1 | 6.81 |
| 1.1 | 6.81 |
| 1.1 | 6.81 |
| 1.1 | 6.81 |
| 1.1 | 6.81 |
| 1.1 | 6.81 |
| 1.1 | 6.81 |
| 1.1 | 6.81 |
| 1.1 | 6.81 |
| 1.1 | 6.81 |
| 1.1 | 6.81 |
| 1.1 | 6.81 |
| 1.1 | 6.81 |
| 1.1 | 6.81 |
| 1.1 | 6.81 |
| 1.1 | 6.81 |
| 1.1 | 6.81 |
| 1.1 | 6.81 |
| 1.1 | 6.81 |
| 1.1 | 6.81 |
| 1.1 | 6.81 |
| 1.1 | 6.81 |
| 1.1 | 6.81 |
| 1.1 | 6.81 |
| 1.1 | 6.81 |
| 1.1 | 6.81 |
| 1.1 | 6.81 |
| 1.1 | 6.81 |
| 1.1 | 6.81 |
| 1.1 | 6.81 |
| 1.1 | 6.81 |
| 1.1 | 6.81 |
| 1.1 | 6.81 |
| 1.1 | 6.81 |
| 1.1 | 6.81 |
| 1.1 | 6.81 |
| 1.1 | 6.81 |
| 1.1 | 6.81 |
| 1.1 | 6.81 |
| 1.1 | 6.81 |
| 1.1 | 6.81 |
| 1.1 | 6.81 |
| 1.1 | 6.81 |
| 1.1 | 6.81 |
| 1.1 | 6.81 |
| 1.1 | 6.81 |
| 1.1 | 6.81 |
| 1.1 | 6.81 |
| 1.1 | 6.81 |
| 1.1 | 6.81 |
| 1.1 | 6.81 |
| 1.1 | 6.81 |
| 1.1 | 6.81 |
| 1.1 | 6.81 |
| 1.1 | 6.81 |
| 1.1 | 6.81 |
| 1.1 | 6.81 |
| 1.1 | 6.81 |
| 1.1 | 6.81 |
| 1.1 | 6.81 |
| 1.1 | 6.81 |
| 1.1 | 6.81 |
| 1.1 | 6.81 |
| 1.1 | 6.81 |
| 1.1 | 6.81 |
| 1.1 | 6.81 |
| 1.1 | 6.81 |
| 1.1 | 6.81 |
| 1.1 | 6.81 |
| 1.1 | 6.81 |
| 1.1 | 6.81 |
| 1.1 | 6.81 |
| 1.1 | 6.81 |
| 1.1 | 6.81 |
| 1.1 | 6.81 |
| 1.1 | 6.81 |
| 1.1 | 6.81 |
| 1.1 | 6.81 |
| 1.1 | 6.81 |
| 1.1 | 6.81 |
| 1.1 | 6.81 |
| 1.1 | 6.81 |
| 1.1 | 6.81 |
| 1.1 | 6.81 |
| 1.1 | 6.81 |
| 1.1 | 6.81 |
| 1.1 | 6.81 |
| 1.1 | 6.81 |
| 1.1 | 6.81 |
| 1.1 | 6.81 |
| 1.1 | 6.81 |
| 1.1 | 6.81 |
| 1.1 | 6.81 |
| 1.1 | 6.81 |
| 1.1 | 6.81 |
| 1.1 | 6.81 |
| 1.1 | 6.81 |
| 1.1 | 6.81 |
| 1.1 | 6.81 |
| 1.1 | 6.81 |
| 1.1 | 6.81 |
| 1.1 | 6.81 |
| 1.1 | 6.81 |
| 1.1 | 6.81 |
| 1.1 | 6.81 |
| 1.1 | 6.81 |
| 1.1 | 6.81 |
| 1.1 | 6.81 |
| 1.1 | 6.81 |
| 1.1 | 6.81 |
| 1.1 | 6.81 |
| 1.1 | 6.81 |
| 1.1 | 6.81 |
| 1.1 | 6.81 |
| 1.1 | 6.81 |
| 1.1 | 6.81 |
| 1.1 | 6.81 |
| 1.1 | 6.81 |
| 1.1 | 6.81 |
| 1.1 | 6.81 |
| 1.1 | 6.81 |
| 1.1 | 6.81 |
| 1.1 | 6.81 |
| 1.1 | 6.81 |
| 1.1 | 6.81 |
| 1.1 | 6.81 |
| 1.1 | 6.81 |
| 1.1 | 6.81 |
| 1.1 | 6.81 |
| 1.1 | 6.81 |
| 1.1 | 6.81 |
| 1.1 | 6.81 |
| 1.1 | 6.81 |
| 1.1 | 6.81 |
| 1.1 | 6.81 |
| 1.1 | 6.81 |
| 1.1 | 6.81 |
| 1.1 | 6.81 |
| 1.1 | 6.81 |
| 1.1 | 6.81 |
| 1.1 | 6.81 |
| 1.1 | 6.81 |
| 1.1 | 6.81 |
| 1.1 | 6.81 |
| 1.1 | 6.81 |
| 1.1 | 6.81 |
| 1.1 | 6.81 |
| 1.1 | 6.81 |
| 1.1 | 6.81 |
| 1.1 | 6.81 |
| 1.1 | 6.81 |
| 1.1 | 6.81 |
| 1.1 | 6.81 |
| 1.1 | 6.81 |
| 1.1 | 6.81 |
| 1.1 | 6.81 |
| 1.1 | 6.81 |
| 1.1 | 6.81 |
| 1.1 | 6.81 |
| 1.1 | 6.81 |
| 1.1 | 6.81 |
| 1.1 | 6.81 |
| 1.1 | 6.81 |
| 1.1 | 6.81 |
| 1.1 | 6.81 |
| 1.1 | 6.81 |
| 1.1 | 6.81 |
| 1.1 | 6.81 |
| 1.1 | 6.81 |
| 1.1 | 6.81 |
| 1.1 | 6.81 |
| 1.1 | 6.81 |
| 1.1 | 6.81 |
| 1.1 | 6.81 |
| 1.1 | 6.81 |
| 1.1 | 6.81 |
| 1.1 | 6.81 |
| 1.1 | 6.81 |
| 1.1 | 6.81 |
| 1.1 | 6.81 |
| 1.1 | 6.81 |
| 1.1 | 6.81 |
| 1.1 | 6.81 |
| 1.1 | 6.81 |
| 1.1 | 6.81 |
| 1.1 | 6.81 |
| 1.1 | 6.81 |
| 1.1 | 6.81 |
| 1.1 | 6.81 |
| 1.1 | 6.81 |
| 1.1 | 6.81 |
| 1.1 | 6.81 |
| 1.1 | 6.81 |
| 1.1 | 6.81 |
| 1.1 | 6.81 |
| 1.1 | 6.81 |
| 1.1 | 6.81 |
| 1.1 | 6.81 |
| 1.1 | 6.81 |
| 1.1 | 6.81 |
| 1.1 | 6.81 |
| 1.1 | 6.81 |
| 1.1 | 6.81 |
| 1.1 | 6.81 |
| 1.1 | 6.81 |
| 1.1 | 6.81 |
| 1.1 | 6.81 |
| 1.1 | 6.81 |
| 1.1 | 6.81 |
| 1.1 | 6.81 |
| 1.1 | 6.81 |
| 1.1 | 6.81 |
| 1.1 | 6.81 |
| 1.1 | 6.81 |
| 1.1 | 6.81 |
| 1.1 | 6.81 |
| 1.1 | 6.81 |
| 1.1 | 6.81 |
| 1.1 | 6.81 |
| 1.1 | 6.81 |
| 1.1 | 6.81 |
| 1.1 | 6.81 |
| 1.1 | 6.81 |
| 1.1 | 6.81 |
| 1.1 | 6.81 |
| 1.1 | 6.81 |
| 1.1 | 6.81 |
| 1.1 | 6.81 |
| 1.1 | 6.81 |
| 1.1 | 6.81 |
| 1.1 | 6.81 |
| 1.1 | 6.81 |
| 1.1 | 6.81 |
| 1.1 | 6.81 |
| 1.1 | 6.81 |
| 1.1 | 6.81 |
| 1.1 | 6.81 |
| 1.1 | 6.81 |
| 1.1 | 6.81 |
| 1.1 | 6.81 |
| 1.1 | 6.81 |
| 1.1 | 6.81 |
| 1.1 | 6.81 |
| 1.1 | 6.81 |
| 1.1 | 6.81 |
| 1.1 | 6.81 |
| 1.1 | 6.81 |
| 1.1 | 6.81 |
| 1.1 | 6.81 |
| 1.1 | 6.81 |
| 1.1 | 6.81 |
| 1.1 | 6.81 |
| 1.1 | 6.81 |
| 1.1 | 6.81 |
| 1.1 | 6.81 |
| 1.1 | 6.81 |
| 1.1 | 6.81 |
| 1.1 | 6.81 |
| 1.1 | 6.81 |
| 1.1 | 6.81 |
| 1.1 | 6.81 |
| 1.1 | 6.81 |
| 1.1 | 6.81 |
| 1.1 | 6.81 |
| 1.1 | 6.81 |
| 1.1 | 6.81 |
| 1.1 | 6.81 |
| 1.1 | 6.81 |
| 1.1 | 6.81 |
| 1.1 | 6.81 |
| 1.1 | 6.81 |
| 1.1 | 6.81 |
| 1.1 | 6.81 |
| 1.1 | 6.81 |
| 1.1 | 6.81 |
| 1.1 | 6.81 |
| 1.1 | 6.81 |
| 1.1 | 6.81 |
| 1.1 | 6.81 |
| 1.1 | 6.81 |
| 1.1 | 6.81 |
| 1.1 | 6.81 |
| 1.1 | 6.81 |
| 1.1 | 6.81 |
| 1.1 | 6.81 |
| 1.1 | 6.81 |
| 1.1 | 6.81 |
| 1.1 | 6.81 |
| 1.1 | 6.81 |
| 1.1 | 6.81 |
| 1.1 | 6.81 |
| 1.1 | 6.81 |
| 1.1 | 6.81 |
| 1.1 | 6.81 |
| 1.1 | 6.81 |
| 1.1 | 6.81 |
| 1.1 | 6.81 |
| 1.1 | 6.81 |
| 1.1 | 6.81 |
| 1.1 | 6.81 |
| 1.1 | 6.81 |
| 1.1 | 6.81 |
| 1.1 | 6.81 |
| 1.1 | 6.81 |
| 1.1 | 6.81 |
| 1.1 | 6.81 |
| 1.1 | 6.81 |
| 1.1 | 6.81 |
| 1.1 | 6.81 |
| 1.1 | 6.81 |
| 1.1 | 6.81 |
| 1.1 | 6.81 |
| 1.1 | 6.81 |
| 1.1 | 6.81 |
| 1.1 | 6.81 |
| 1.1 | 6.81 |
| 1.1 | 6.81 |
| 1.1 | 6.81 |
| 1.1 | 6.81 |
| 1.1 | 6.81 |
| 1.1 | 6.81 |
| 1.1 | 6.81 |
| 1.1 | 6.81 |
| 1.1 | 6.81 |
| 1.1 | 6.81 |
| 1.1 | 6.81 |
| 1.1 | 6.81 |
| 1.1 | 6.81 |
| 1.1 | 6.81 |
| 1.1 | 6.81 |
| 1.1 | 6.81 |
| 1.1 | 6.81 |
| 1.1 | 6.81 |
| 1.1 | 6.81 |
| 1.1 | 6.81 |
| 1.1 | 6.81 |
| 1.1 | 6.81 |
| 1.1 | 6.81 |
| 1.1 | 6.81 |
| 1.1 | 6.81 |
| 1.1 | 6.81 |
| 1.1 | 6.81 |
| 1.1 | 6.81 |
| 1.1 | 6.81 |
| 1.1 | 6.81 |
| 1.1 | 6.81 |
| 1.1 | 6.81 |
| 1.1 | 6.81 |
| 1.1 | 6.81 |
| 1.1 | 6.81 |
| 1.1 | 6.81 |
| 1.1 | 6.81 |
| 1.1 | 6.81 |
| 1.1 | 6.81 |
| 1.1 | 6.81 |
| 1.1 | 6.81 |
| 1.1 | 6.81 |
| 1.1 | 6.81 |
| 1.1 | 6.81 |
| 1.1 | 6.81 |
| 1.1 | 6.81 |
| 1.1 | 6.81 |
| 1.1 | 6.81 |
| 1.1 | 6.81 |
| 1.1 | 6.81 |
| 1.1 | 6.81 |
| 1.1 | 6.81 |
| 1.1 | 6.81 |
| 1.1 | 6.81 |
| 1.1 | 6.81 |
| 1.1 | 6.81 |
| 1.1 | 6.81 |
| 1.1 | 6.81 |
| 1.1 | 6.81 |
| 1.1 | 6.81 |
| 1.1 | 6.81 |
| 1.1 | 6.81 |
| 1.1 | 6.81 |
| 1.1 | 6.81 |
| 1.1 | 6.81 |
| 1.1 | 6.81 |
| 1.1 | 6.81 |
| 1.1 | 6.81 |
| 1.1 | 6.81 |
| 1.1 | 6.81 |
| 1.1 | 6.81 |
| 1.1 | 6.81 |
| 1.1 | 6.81 |
| 1.1 | 6.81 |
| 1.1 | 6.81 |
| 1.1 | 6.81 |
| 1.1 | 6.81 |
| 1.1 | 6.81 |
| 1.1 | 6.81 |
| 1.1 | 6.81 |
| 1.1 | 6.81 |
| 1.1 | 6.81 |
| 1.1 | 6.81 |
| 1.1 | 6.81 |
| 1.1 | 6.81 |
| 1.1 | 6.81 |
| 1.1 | 6.81 |
| 1.1 | 6.81 |
| 1.1 | 6.81 |
| 1.1 | 6.81 |
| 1.1 | 6.81 |
| 1.1 | 6.81 |
| 1.1 | 6.81 |
| 1.1 | 6.81 |
| 1.1 | 6.81 |
| 1.1 | 6.81 |
| 1.1 | 6.81 |
| 1.1 | 6.81 |
| 1.1 | 6.81 |
| 1.1 | 6.81 |
| 1.1 | 6.81 |
| 1.1 | 6.81 |
| 1.1 | 6.81 |
| 1.1 | 6.81 |
| 1.1 | 6.81 |
| 1.1 | 6.81 |
| 1.1 | 6.81 |
| 1.1 | 6.81 |
| 1.1 | 6.81 |
| 1.1 | 6.81 |
| 1.1 | 6.81 |
| 1.1 | 6.81 |
| 1.1 | 6.81 |
| 1.1 | 6.81 |
| 1.1 | 6.81 |
| 1.1 | 6.81 |
| 1.1 | 6.81 |
| 1.1 | 6.81 |
| 1.1 | 6.81 |
| 1.1 | 6.81 |
| 1.1 | 6.81 |
| 1.1 | 6.81 |
| 1.1 | 6.81 |
| 1.1 | 6.81 |
| 1.1 | 6.81 |
| 1.1 | 6.81 |
| 1.1 | 6.81 |
| 1.1 | 6.81 |
| 1.1 | 6.81 |
| 1.1 | 6.81 |
| 1.1 | 6.81 |
| 1.1 | 6.81 |
| 1.1 | 6.81 |
| 1.1 | 6.81 |
| 1.1 | 6.81 |
| 1.1 | 6.81 |
| 1.1 | 6.81 |
| 1.1 | 6.81 |
| 1.1 | 6.81 |
| 1.1 | 6.81 |
| 1.1 | 6.81 |
| 1.1 | 6.81 |
| 1.1 | 6.81 |
| 1.1 | 6.81 |
| 1.1 | 6.81 |
| 1.1 | 6.81 |
| 1.1 | 6.81 |
| 1.1 | 6.81 |
| 1.1 | 6.81 |
| 1.1 | 6.81 |
| 1.1 | 6.81 |
| 1.1 | 6.81 |
| 1.1 | 6.81 |
| 1.1 | 6.81 |
| 1.1 | 6.81 |
| 1.1 | 6.81 |
| 1.1 | 6.81 |
| 1.1 | 6.81 |
| 1.1 | 6.81 |
| 1.1 | 6.81 |
| 1.1 | 6.81 |
| 1.1 | 6.81 |
| 1.1 | 6.81 |
| 1.1 | 6.81 |
| 1.1 | 6.81 |
| 1.1 | 6.81 |
| 1.1 | 6.81 |
| 1.1 | 6.81 |
| 1.1 | 6.81 |
| 1.1 | 6.81 |
| 1.1 | 6.81 |
| 1.1 | 6.81 |
| 1.1 | 6.81 |
| 1.1 | 6.81 |
| 1.1 | 6.81 |
| 1.1 | 6.81 |
| 1.1 | 6.81 |
| 1.1 | 6.81 |
| 0.69 | 6.88 |
| 0.69 | 6.88 |
| 0.69 | 6.88 |
| 0.69 | 6.88 |
| 0.69 | 6.88 |
| 0.69 | 6.88 |
| 0.69 | 6.88 |
| 0.69 | 6.88 |
| 0.69 | 6.88 |
| 0.69 | 6.88 |
| 0.69 | 6.88 |
| 0.69 | 6.88 |
| 0.69 | 6.88 |
| 0.69 | 6.88 |
| 0.69 | 6.88 |
| 0.69 | 6.88 |
| 0.69 | 6.88 |
| 0.69 | 6.88 |
| 0.69 | 6.88 |
| 0.69 | 6.88 |
| 0.69 | 6.88 |
| 0.69 | 6.88 |
| 0.69 | 6.88 |
| 0.69 | 6.88 |
| 0.69 | 6.88 |
| 0.69 | 6.88 |
| 0.69 | 6.88 |
| 0.69 | 6.88 |
| 0.69 | 6.88 |
| 0.69 | 6.88 |
| 0.69 | 6.88 |
| 0.69 | 6.88 |
| 0.69 | 6.88 |
| 0.69 | 6.88 |
| 0.69 | 6.88 |
| 0.69 | 6.88 |
| 0.69 | 6.88 |
| 0.69 | 6.88 |
| 0.69 | 6.88 |
| 0.69 | 6.88 |
| 0.69 | 6.88 |
| 0.69 | 6.88 |
| 0.69 | 6.88 |
| 0.69 | 6.88 |
| 0.69 | 6.88 |
| 0.69 | 6.88 |
| 0.69 | 6.88 |
| 0.69 | 6.88 |
| 0.69 | 6.88 |
| 0.69 | 6.88 |
| 0.69 | 6.88 |
| 0.69 | 6.88 |
| 0.69 | 6.88 |
| 0.69 | 6.88 |
| 0.69 | 6.88 |
| 0.69 | 6.88 |
| 0.69 | 6.88 |
| 0.69 | 6.88 |
| 0.69 | 6.88 |
| 0.69 | 6.88 |
| 0.69 | 6.88 |
| 0.69 | 6.88 |
| 0.69 | 6.88 |
| 0.69 | 6.88 |
| 0.69 | 6.88 |
| 0.69 | 6.88 |
| 0.69 | 6.88 |
| 0.69 | 6.88 |
| 0.69 | 6.88 |
| 0.69 | 6.88 |
| 0.69 | 6.88 |
| 0.69 | 6.88 |
| 0.69 | 6.88 |
| 0.69 | 6.88 |
| 0.69 | 6.88 |
| 0.69 | 6.88 |
| 0.69 | 6.88 |
| 0.69 | 6.88 |
| 0.69 | 6.88 |
| 0.69 | 6.88 |
| 0.69 | 6.88 |
| 0.69 | 6.88 |
| 0.69 | 6.88 |
| 0.69 | 6.88 |
| 0.69 | 6.88 |
| 0.69 | 6.88 |
| 0.69 | 6.88 |
| 0.69 | 6.88 |
| 0.69 | 6.88 |
| 0.69 | 6.88 |
| 0.69 | 6.88 |
| 0.69 | 6.88 |
| 0.69 | 6.88 |
| 0.69 | 6.88 |
| 0.69 | 6.88 |
| 0.69 | 6.88 |
| 0.69 | 6.88 |
| 0.69 | 6.88 |
| 0.69 | 6.88 |
| 0.69 | 6.88 |
| 0.69 | 6.88 |
| 0.69 | 6.88 |
| 0.69 | 6.88 |
| 0.69 | 6.88 |
| 0.69 | 6.88 |
| 0.69 | 6.88 |
| 0.69 | 6.88 |
| 0.69 | 6.88 |
| 0.69 | 6.88 |
| 0.69 | 6.88 |
| 0.69 | 6.88 |
| 0.69 | 6.88 |
| 0.69 | 6.88 |
| 0.69 | 6.88 |
| 0.69 | 6.88 |
| 0.69 | 6.88 |
| 0.69 | 6.88 |
| 0.69 | 6.88 |
| 0.69 | 6.88 |
| 0.69 | 6.88 |
| 0.69 | 6.88 |
| 0.69 | 6.88 |
| 0.69 | 6.88 |
| 0.69 | 6.88 |
| 0.69 | 6.88 |
| 0.69 | 6.88 |
| 0.69 | 6.88 |
| 0.69 | 6.88 |
| 0.69 | 6.88 |
| 0.69 | 6.88 |
| 0.69 | 6.88 |
| 0.69 | 6.88 |
| 0.69 | 6.88 |
| 0.69 | 6.88 |
| 0.69 | 6.88 |
| 0.69 | 6.88 |
| 0.69 | 6.88 |
| 0.69 | 6.88 |
| 0.69 | 6.88 |
| 0.69 | 6.88 |
| 0.69 | 6.88 |
| 0.69 | 6.88 |
| 0.69 | 6.88 |
| 0.69 | 6.88 |
| 0.69 | 6.88 |
| 0.69 | 6.88 |
| 0.69 | 6.88 |
| 0.69 | 6.88 |
| 0.69 | 6.88 |
| 0.69 | 6.88 |
| 0.69 | 6.88 |
| 0.69 | 6.88 |
| 0.69 | 6.88 |
| 0.69 | 6.88 |
| 0.69 | 6.88 |
| 0.69 | 6.88 |
| 0.69 | 6.88 |
| 0.69 | 6.88 |
| 0.69 | 6.88 |
| 0.69 | 6.88 |
| 0.69 | 6.88 |
| 0.69 | 6.88 |
| 0.69 | 6.88 |
| 0.69 | 6.88 |
| 0.69 | 6.88 |
| 0.69 | 6.88 |
| 0.69 | 6.88 |
| 0.69 | 6.88 |
| 0.69 | 6.88 |
| 0.69 | 6.88 |
| 0.69 | 6.88 |
| 0.69 | 6.88 |
| 0.69 | 6.88 |
| 0.69 | 6.88 |
| 0.69 | 6.88 |
| 0.69 | 6.88 |
| 0.69 | 6.88 |
| 0.69 | 6.88 |
| 0.69 | 6.88 |
| 0.69 | 6.88 |
| 0.69 | 6.88 |
| 0.69 | 6.88 |
| 0.69 | 6.88 |
| 0.69 | 6.88 |
| 0.69 | 6.88 |
| 0.69 | 6.88 |
| 0.69 | 6.88 |
| 0.69 | 6.88 |
| 0.69 | 6.88 |
| 0.69 | 6.88 |
| 0.69 | 6.88 |
| 0.69 | 6.88 |
| 0.69 | 6.88 |
| 0.69 | 6.88 |
| 0.69 | 6.88 |
| 0.69 | 6.88 |
| 0.69 | 6.88 |
| 0.69 | 6.88 |
| 0.69 | 6.88 |
| 0.69 | 6.88 |
| 0.69 | 6.88 |
| 0.69 | 6.88 |
| 0.69 | 6.88 |
| 0.69 | 6.88 |
| 0.69 | 6.88 |
| 0.69 | 6.88 |
| 0.69 | 6.88 |
| 0.69 | 6.88 |
| 0.69 | 6.88 |
| 0.69 | 6.88 |
| 0.69 | 6.88 |
| 0.69 | 6.88 |
| 0.69 | 6.88 |
| 0.69 | 6.88 |
| 0.69 | 6.88 |
| 0.69 | 6.88 |
| 0.69 | 6.88 |
| 0.69 | 6.88 |
| 0.69 | 6.88 |
| 0.69 | 6.88 |
| 0.69 | 6.88 |
| 0.69 | 6.88 |
| 0.69 | 6.88 |
| 0.69 | 6.88 |
| 0.69 | 6.88 |
| 0.69 | 6.88 |
| 0.69 | 6.88 |
| 0.69 | 6.88 |
| 0.69 | 6.88 |
| 0.69 | 6.88 |
| 0.69 | 6.88 |
| 0.69 | 6.88 |
| 0.69 | 6.88 |
| 0.69 | 6.88 |
| 0.69 | 6.88 |
| 0.69 | 6.88 |
| 0.69 | 6.88 |
| 0.69 | 6.88 |
| 0.69 | 6.88 |
| 0.69 | 6.88 |
| 0.69 | 6.88 |
| 0.69 | 6.88 |
| 0.69 | 6.88 |
| 0.69 | 6.88 |
| 0.69 | 6.88 |
| 0.69 | 6.88 |
| 0.69 | 6.88 |
| 0.69 | 6.88 |
| 0.69 | 6.88 |
| 0.69 | 6.88 |
| 0.69 | 6.88 |
| 0.69 | 6.88 |
| 0.69 | 6.88 |
| 0.69 | 6.88 |
| 0.69 | 6.88 |
| 0.69 | 6.88 |
| 0.69 | 6.88 |
| 0.69 | 6.88 |
| 0.69 | 6.88 |
| 0.69 | 6.88 |
| 0.69 | 6.88 |
| 0.69 | 6.88 |
| 0.69 | 6.88 |
| 0.69 | 6.88 |
| 0.69 | 6.88 |
| 0.69 | 6.88 |
| 0.69 | 6.88 |
| 0.69 | 6.88 |
| 0.69 | 6.88 |
| 0.69 | 6.88 |
| 0.69 | 6.88 |
| 0.69 | 6.88 |
| 0.69 | 6.88 |
| 0.69 | 6.88 |
| 0.69 | 6.88 |
| 0.69 | 6.88 |
| 0.69 | 6.88 |
| 0.69 | 6.88 |
| 0.69 | 6.88 |
| 0.69 | 6.88 |
| 0.69 | 6.88 |
| 0.69 | 6.88 |
| 0.69 | 6.88 |
| 0.69 | 6.88 |
| 0.69 | 6.88 |
| 0.69 | 6.88 |
| 0.69 | 6.88 |
| 0.69 | 6.88 |
| 0.69 | 6.88 |
| 0.69 | 6.88 |
| 0.69 | 6.88 |
| 0.69 | 6.88 |
| 0.69 | 6.88 |
| 0.69 | 6.88 |
| 0.69 | 6.88 |
| 0.69 | 6.88 |
| 0.69 | 6.88 |
| 0.69 | 6.88 |
| 0.69 | 6.88 |
| 0.69 | 6.88 |
| 0.69 | 6.88 |
| 0.69 | 6.88 |
| 0.69 | 6.88 |
| 0.69 | 6.88 |
| 0.69 | 6.88 |
| 0.69 | 6.88 |
| 0.69 | 6.88 |
| 0.69 | 6.88 |
| 0.69 | 6.88 |
| 0.69 | 6.88 |
| 0.69 | 6.88 |
| 0.69 | 6.88 |
| 0.69 | 6.88 |
| 0.69 | 6.88 |
| 0.69 | 6.88 |
| 0.69 | 6.88 |
| 0.69 | 6.88 |
| 0.69 | 6.88 |
| 0.69 | 6.88 |
| 0.69 | 6.88 |
| 0.69 | 6.88 |
| 0.69 | 6.88 |
| 0.69 | 6.88 |
| 0.69 | 6.88 |
| 0.69 | 6.88 |
| 0.69 | 6.88 |
| 0.69 | 6.88 |
| 0.69 | 6.88 |
| 0.69 | 6.88 |
| 0.69 | 6.88 |
| 0.69 | 6.88 |
| 0.69 | 6.88 |
| 0.69 | 6.88 |
| 0.69 | 6.88 |
| 0.69 | 6.88 |
| 0.69 | 6.88 |
| 0.69 | 6.88 |
| 0.69 | 6.88 |
| 0.69 | 6.88 |
| 0.69 | 6.88 |
| 0.69 | 6.88 |
| 0.69 | 6.88 |
| 0.69 | 6.88 |
| 0.69 | 6.88 |
| 0.69 | 6.88 |
| 0.69 | 6.88 |
| 0.69 | 6.88 |
| 0.69 | 6.88 |
| 0.69 | 6.88 |
| 0.69 | 6.88 |
| 0.69 | 6.88 |
| 0.69 | 6.88 |
| 0.69 | 6.88 |
| 0.69 | 6.88 |
| 0.69 | 6.88 |
| 0.69 | 6.88 |
| 0.69 | 6.88 |
| 0.69 | 6.88 |
| 0.69 | 6.88 |
| 0.69 | 6.88 |
| 0.69 | 6.88 |
| 0.69 | 6.88 |
| 0.69 | 6.88 |
| 0.69 | 6.88 |
| 0.69 | 6.88 |
| 0.69 | 6.88 |
| 0.69 | 6.88 |
| 0.69 | 6.88 |
| 0.69 | 6.88 |
| 0.69 | 6.88 |
| 0.69 | 6.88 |
| 0.69 | 6.88 |
| 0.69 | 6.88 |
| 0.69 | 6.88 |
| 0.69 | 6.88 |
| 0.69 | 6.88 |
| 0.69 | 6.88 |
| 0.69 | 6.88 |
| 0.69 | 6.88 |
| 0.69 | 6.88 |
| 0.69 | 6.88 |
| 0.69 | 6.88 |
| 0.69 | 6.88 |
| 0.69 | 6.88 |
| 0.69 | 6.88 |
| 0.69 | 6.88 |
| 0.69 | 6.88 |
| 0.69 | 6.88 |
| 0.69 | 6.88 |
| 0.69 | 6.88 |
| 0.69 | 6.88 |
| 0.69 | 6.88 |
| 0.69 | 6.88 |
| 0.69 | 6.88 |
| 0.69 | 6.88 |
| 0.69 | 6.88 |
| 0.69 | 6.88 |
| 0.69 | 6.88 |
| 0.69 | 6.88 |
| 0.69 | 6.88 |
| 0.69 | 6.88 |
| 0.69 | 6.88 |
| 0.69 | 6.88 |
| 0.69 | 6.88 |
| 0.69 | 6.88 |
| 0.69 | 6.88 |
| 0.69 | 6.88 |
| 0.69 | 6.88 |
| 0.69 | 6.88 |
| 0.69 | 6.88 |
| 0.69 | 6.88 |
| 0.69 | 6.88 |
| 0.69 | 6.88 |
| 0.69 | 6.88 |
| 0.69 | 6.88 |
| 0.69 | 6.88 |
| 0.69 | 6.88 |
| 0.69 | 6.88 |
| 0.69 | 6.88 |
| 0.69 | 6.88 |
| 0.69 | 6.88 |
| 0.69 | 6.88 |
| 0.69 | 6.88 |
| 0.69 | 6.88 |
| 0.69 | 6.88 |
| 0.69 | 6.88 |
| 0.69 | 6.88 |
| 0.69 | 6.88 |
| 0.69 | 6.88 |
| 0.69 | 6.88 |
| 0.69 | 6.88 |
| 0.69 | 6.88 |
| 0.69 | 6.88 |
| 0.69 | 6.88 |
| 0.69 | 6.88 |
| 0.69 | 6.88 |
| 0.69 | 6.88 |
| 0.69 | 6.88 |
| 0.69 | 6.88 |
| 0.69 | 6.88 |
| 0.69 | 6.88 |
| 0.69 | 6.88 |
| 0.69 | 6.88 |
| 0.69 | 6.88 |
| 0.69 | 6.88 |
| 0.69 | 6.88 |
| 0.69 | 6.88 |
| 0.69 | 6.88 |
| 0.69 | 6.88 |
| 0.69 | 6.88 |
| 0.69 | 6.88 |
| 0.69 | 6.88 |
| 0.69 | 6.88 |
| 0.69 | 6.88 |
| 0.69 | 6.88 |
| 0.69 | 6.88 |
| 0.69 | 6.88 |
| 0.69 | 6.88 |
| 0.69 | 6.88 |
| 0.69 | 6.88 |
| 0.69 | 6.88 |
| 0.69 | 6.88 |
| 0.69 | 6.88 |
| 0.69 | 6.88 |
| 0.69 | 6.88 |
| 0.69 | 6.88 |
| 0.69 | 6.88 |
| 0.69 | 6.88 |
| 0.69 | 6.88 |
| 0.69 | 6.88 |
| 0.69 | 6.88 |
| 0.69 | 6.88 |
| 0.69 | 6.88 |
| 0.69 | 6.88 |
| 0.69 | 6.88 |
| 0.69 | 6.88 |
| 0.69 | 6.88 |
| 0.69 | 6.88 |
| 0.69 | 6.88 |
| 0.69 | 6.88 |
| 0.69 | 6.88 |
| 0.69 | 6.88 |
| 0.69 | 6.88 |
| 0.69 | 6.88 |
| 0.69 | 6.88 |
| 0.69 | 6.88 |
| 0.69 | 6.88 |
| 0.69 | 6.88 |
| 0.69 | 6.88 |
| 0.69 | 6.88 |
| 0.69 | 6.88 |
| 0.69 | 6.88 |
| 0.69 | 6.88 |
| 0.69 | 6.88 |
| 0.69 | 6.88 |
| 0.69 | 6.88 |
| 0.69 | 6.88 |
| 0.69 | 6.88 |
| 0.69 | 6.88 |
| 0.69 | 6.88 |
| 0.69 | 6.88 |
| 0.69 | 6.88 |
| 0.69 | 6.88 |
| 0.69 | 6.88 |
| 0.69 | 6.88 |
| 0.69 | 6.88 |
| 0.69 | 6.88 |
| 0.69 | 6.88 |
| 0.69 | 6.88 |
| 0.69 | 6.88 |
| 0.69 | 6.88 |
| 0.69 | 6.88 |
| 0.69 | 6.88 |
| 0.69 | 6.88 |
| 0.69 | 6.88 |
| 0.69 | 6.88 |
| 0.69 | 6.88 |
| 0.69 | 6.88 |
| 0.69 | 6.88 |
| 0.69 | 6.88 |
| 0.69 | 6.88 |
| 0.69 | 6.88 |
| 0.69 | 6.88 |
| 0.69 | 6.88 |
| 0.69 | 6.88 |
| 0.69 | 6.88 |
| 0.69 | 6.88 |
| 0.69 | 6.88 |
| 0.69 | 6.88 |
| 0.69 | 6.88 |
| 0.69 | 6.88 |
| 0.69 | 6.88 |
| 0.69 | 6.88 |
| 0.69 | 6.88 |
| 0.69 | 6.88 |
| 0.69 | 6.88 |
| 0.69 | 6.88 |
| 0.69 | 6.88 |
| 0.69 | 6.88 |
| 0.69 | 6.88 |
| 0.69 | 6.88 |
| 0.69 | 6.88 |
| 0.69 | 6.88 |
| 0.69 | 6.88 |
| 0.69 | 6.88 |
| 0.69 | 6.88 |
| 0.69 | 6.88 |
| 0.69 | 6.88 |
| 0.69 | 6.88 |
| 0.69 | 6.88 |
| 0.69 | 6.88 |
| 0.69 | 6.88 |
| 0.69 | 6.88 |
| 0.69 | 6.88 |
| 0.69 | 6.88 |
| 0.69 | 6.88 |
| 0.69 | 6.88 |
| 0.69 | 6.88 |
| 0.69 | 6.88 |
| 0.69 | 6.88 |
| 0.69 | 6.88 |
| 0.69 | 6.88 |
| 0.69 | 6.88 |
| 0.69 | 6.88 |
| 0.69 | 6.88 |
| 0.69 | 6.88 |
| 0.69 | 6.88 |
| 0.69 | 6.88 |
| 0.69 | 6.88 |
| 0.69 | 6.88 |
| 0.69 | 6.88 |
| 0.69 | 6.88 |
| 0.69 | 6.88 |
| 0.69 | 6.88 |
| 0.69 | 6.88 |
| 0.69 | 6.88 |
| 0.69 | 6.88 |
| 0.69 | 6.88 |
| 0.69 | 6.88 |
| 0.69 | 6.88 |
| 0.69 | 6.88 |
| 0.69 | 6.88 |
| 0.69 | 6.88 |
| 0.69 | 6.88 |
| 0.69 | 6.88 |
| 0.69 | 6.88 |
| 0.69 | 6.88 |
| 0.69 | 6.88 |
| 0.69 | 6.88 |
| 0.69 | 6.88 |
| 0.69 | 6.88 |
| 0.69 | 6.88 |
| 0.69 | 6.88 |
| 0.69 | 6.88 |
| 0.69 | 6.88 |
| 0.69 | 6.88 |
| 0.69 | 6.88 |
| 0.69 | 6.88 |
| 0.69 | 6.88 |
| 0.69 | 6.88 |
| 0.69 | 6.88 |
| 0.69 | 6.88 |
| 0.69 | 6.88 |
| 0.69 | 6.88 |
| 0.69 | 6.88 |
| 0.69 | 6.88 |
| 0.69 | 6.88 |
| 0.69 | 6.88 |
| 0.69 | 6.88 |
| 0.69 | 6.88 |
| 0.69 | 6.88 |
| 0.69 | 6.88 |
| 0.69 | 6.88 |
| 0.69 | 6.88 |
| 0.69 | 6.88 |
| 0.69 | 6.88 |
| 0.69 | 6.88 |
| 0.69 | 6.88 |
| 0.69 | 6.88 |
| 0.69 | 6.88 |
| 0.69 | 6.88 |
| 0.69 | 6.88 |
| 0.69 | 6.88 |
| 0.69 | 6.88 |
| 0.69 | 6.88 |
| 0.69 | 6.88 |
| 0.69 | 6.88 |
| 0.69 | 6.88 |
| 0.69 | 6.88 |
| 0.69 | 6.88 |
| 0.69 | 6.88 |
| 0.69 | 6.88 |
| 0.69 | 6.88 |
| 0.69 | 6.88 |
| 0.69 | 6.88 |
| 0.69 | 6.88 |
| 0.69 | 6.88 |
| 0.69 | 6.88 |
| 0.69 | 6.88 |
| 0.69 | 6.88 |
| 0.69 | 6.88 |
| 0.69 | 6.88 |
| 0.69 | 6.88 |
| 0.69 | 6.88 |
| 0.69 | 6.88 |
| 0.69 | 6.88 |
| 0.69 | 6.88 |
| 0.69 | 6.88 |
| 0.69 | 6.88 |
| 0.69 | 6.88 |
| 0.69 | 6.88 |
| 0.69 | 6.88 |
| 0.69 | 6.88 |
| 0.69 | 6.88 |
| 0.69 | 6.88 |
| 0.69 | 6.88 |
| 0.69 | 6.88 |
| 0.69 | 6.88 |
| 0.69 | 6.88 |
| 0.69 | 6.88 |
| 0.69 | 6.88 |
| 0.69 | 6.88 |
| 0.69 | 6.88 |
| 0.69 | 6.88 |
| 0.69 | 6.88 |
| 0.69 | 6.88 |
| 0.69 | 6.88 |
| 0.69 | 6.88 |
| 0.69 | 6.88 |
| 0.69 | 6.88 |
| 0.69 | 6.88 |
| 0.69 | 6.88 |
| 0.69 | 6.88 |
| 0.69 | 6.88 |
| 0.69 | 6.88 |
| 0.69 | 6.88 |
| 0.69 | 6.88 |
| 0.69 | 6.88 |
| 0.69 | 6.88 |
| 0.69 | 6.88 |
| 0.69 | 6.88 |
| 0.69 | 6.88 |
| 0.69 | 6.88 |
| 0.69 | 6.88 |
| 0.69 | 6.88 |
| 0.69 | 6.88 |
| 0.69 | 6.88 |
| 0.69 | 6.88 |
| 0.69 | 6.88 |
| 0.69 | 6.88 |
| 0.69 | 6.88 |
| 0.69 | 6.88 |
| 0.69 | 6.88 |
| 0.69 | 6.88 |
| 0.69 | 6.88 |
| 0.69 | 6.88 |
| 0.69 | 6.88 |
| 0.69 | 6.88 |
| 0.69 | 6.88 |
| 0.69 | 6.88 |
| 0.69 | 6.88 |
| 0.69 | 6.88 |
| 0.69 | 6.88 |
| 0.69 | 6.88 |
| 0.69 | 6.88 |
| 0.69 | 6.88 |
| 0.69 | 6.88 |
| 0.69 | 6.88 |
| 0.69 | 6.88 |
| 0.69 | 6.88 |
| 0.69 | 6.88 |
| 0.69 | 6.88 |
| 0.69 | 6.88 |
| 0.69 | 6.88 |
| 0.69 | 6.88 |
| 0.69 | 6.88 |
| 0.69 | 6.88 |
| 0.69 | 6.88 |
| 0.69 | 6.88 |
| 0.69 | 6.88 |
| 0.69 | 6.88 |
| 0.69 | 6.88 |
| 0.69 | 6.88 |
| 0.69 | 6.88 |
| 0.69 | 6.88 |
| 0.69 | 6.88 |
| 0.69 | 6.88 |
| 0.69 | 6.88 |
| 0.69 | 6.88 |
| 0.69 | 6.88 |
| 0.69 | 6.88 |
| 0.69 | 6.88 |
| 0.69 | 6.88 |
| 0.69 | 6.88 |
| 0.69 | 6.88 |
| 0.69 | 6.88 |
| 0.69 | 6.88 |
| 0.69 | 6.88 |
| 0.69 | 6.88 |
| 0.69 | 6.88 |
| 0.69 | 6.88 |
| 0.69 | 6.88 |
| 0.69 | 6.88 |
| 0.69 | 6.88 |
| 0.69 | 6.88 |
| 0.69 | 6.88 |
| 0.69 | 6.88 |
| 0.69 | 6.88 |
| 0.69 | 6.88 |
| 0.69 | 6.88 |
| 0.69 | 6.88 |
| 0.69 | 6.88 |
| 0.69 | 6.88 |
| 0.69 | 6.88 |
| 0.69 | 6.88 |
| 0.69 | 6.88 |
| 0.69 | 6.88 |
| 0.69 | 6.88 |
| 0.69 | 6.88 |
| 0.69 | 6.88 |
| 0.69 | 6.88 |
| 0.69 | 6.88 |
| 0.69 | 6.88 |
| 0.69 | 6.88 |
| 0.69 | 6.88 |
| 0.69 | 6.88 |
| 0.69 | 6.88 |
| 0.69 | 6.88 |
| 0.69 | 6.88 |
| 0.69 | 6.88 |
| 0.69 | 6.88 |
| 0.69 | 6.88 |
| 0.69 | 6.88 |
| 0.69 | 6.88 |
| 0.69 | 6.88 |
| 0.69 | 6.88 |
| 0.69 | 6.88 |
| 0.69 | 6.88 |
| 0.69 | 6.88 |
| 0.69 | 6.88 |
| 0.69 | 6.88 |
| 0.69 | 6.88 |
| 0.69 | 6.88 |
| 0.69 | 6.88 |
| 0.69 | 6.88 |
| 0.69 | 6.88 |
| 0.69 | 6.88 |
| 0.69 | 6.88 |
| 0.69 | 6.88 |
| 0.69 | 6.88 |
| 0.69 | 6.88 |
| 0.69 | 6.88 |
| 0.69 | 6.88 |
| 0.69 | 6.88 |
| 0.69 | 6.88 |
| 0.69 | 6.88 |
| 0.69 | 6.88 |
| 0.69 | 6.88 |
| 0.69 | 6.88 |
| 0.69 | 6.88 |
| 0.69 | 6.88 |
| 0.69 | 6.88 |
| 0.69 | 6.88 |
| 0.69 | 6.88 |
| 0.69 | 6.88 |
| 0.69 | 6.88 |
| 0.69 | 6.88 |
| 0.69 | 6.88 |
| 0.69 | 6.88 |
| 0.69 | 6.88 |
| 0.69 | 6.88 |
| 0.69 | 6.88 |
| 0.69 | 6.88 |
| 0.69 | 6.88 |
| 0.69 | 6.88 |
| 0.69 | 6.88 |
| 0.69 | 6.88 |
| 0.69 | 6.88 |
| 0.69 | 6.88 |
| 0.69 | 6.88 |
| 0.69 | 6.88 |
| 0.69 | 6.88 |
| 0.69 | 6.88 |
| 0.69 | 6.88 |
| 0.69 | 6.88 |
| 0.69 | 6.88 |
| 0.69 | 6.88 |
| 0.69 | 6.88 |
| 0.69 | 6.88 |
| 0.69 | 6.88 |
| 0.69 | 6.88 |
| 0.69 | 6.88 |
| 0.69 | 6.88 |
| 0.69 | 6.88 |
| 0.69 | 6.88 |
| 0.69 | 6.88 |
| 0.69 | 6.88 |
| 0.69 | 6.88 |
| 0.69 | 6.88 |
| 0.69 | 6.88 |
| 0.69 | 6.88 |
| 0.69 | 6.88 |
| 0.69 | 6.88 |
| 0.69 | 6.88 |
| 0.69 | 6.88 |
| 0.69 | 6.88 |
| 0.69 | 6.88 |
| 0.69 | 6.88 |
| 0.69 | 6.88 |
| 0.69 | 6.88 |
| 0.69 | 6.88 |
| 0.69 | 6.88 |
| 0.69 | 6.88 |
| 0.69 | 6.88 |
| 0.69 | 6.88 |
| 0.69 | 6.88 |
| 0.69 | 6.88 |
| 0.69 | 6.88 |
| 0.69 | 6.88 |
| 0.69 | 6.88 |
| 0.69 | 6.88 |
| 0.69 | 6.88 |
| 0.69 | 6.88 |
| 0.69 | 6.88 |
| 0.69 | 6.88 |
| 0.69 | 6.88 |
| 0.69 | 6.88 |
| 0.69 | 6.88 |
| 0.69 | 6.88 |
| 0.69 | 6.88 |
| 0.69 | 6.88 |
| 0.69 | 6.88 |
| 0.69 | 6.88 |
| 0.69 | 6.88 |
| 0.69 | 6.88 |
| 0.69 | 6.88 |
| 0.69 | 6.88 |
| 0.69 | 6.88 |
| 0.69 | 6.88 |
| 0.69 | 6.88 |
| 0.69 | 6.88 |
| 0.69 | 6.88 |
| 0.69 | 6.88 |
| 0.69 | 6.88 |
| 0.69 | 6.88 |
| 0.69 | 6.88 |
| 0.69 | 6.88 |
| 0.69 | 6.88 |
| 0.69 | 6.88 |
| 0.69 | 6.88 |
| 0.69 | 6.88 |
| 0.69 | 6.88 |
| 0.69 | 6.88 |
| 0.69 | 6.88 |
| 0.69 | 6.88 |
| 0.69 | 6.88 |
| 0.69 | 6.88 |
| 0.69 | 6.88 |
| 0.69 | 6.88 |
| 0.69 | 6.88 |
| 0.69 | 6.88 |
| 0.69 | 6.88 |
| 0.69 | 6.88 |
| 0.69 | 6.88 |
| 0.69 | 6.88 |
| 0.69 | 6.88 |
| 0.69 | 6.88 |
| 0.69 | 6.88 |
| 0.69 | 6.88 |
| 0.69 | 6.88 |
| 0.69 | 6.88 |
| 0.69 | 6.88 |
| 0.69 | 6.88 |
| 0.69 | 6.88 |
| 0.69 | 6.88 |
| 0.69 | 6.88 |
| 0.69 | 6.88 |
| 0.69 | 6.88 |
| 0.69 | 6.88 |
| 0.69 | 6.88 |
| 0.69 | 6.88 |
| 0.69 | 6.88 |
| 0.69 | 6.88 |
| 0.69 | 6.88 |
| 0.69 | 6.88 |
| 0.69 | 6.88 |
| 0.69 | 6.88 |
| 0.69 | 6.88 |
| 0.69 | 6.88 |
| 0.69 | 6.88 |
| 0.69 | 6.88 |
| 0.69 | 6.88 |
| 0.69 | 6.88 |
| 0.69 | 6.88 |
| 0.69 | 6.88 |
| 0.69 | 6.88 |
| 0.69 | 6.88 |
| 0.69 | 6.88 |
| 0.69 | 6.88 |
| 0.69 | 6.88 |
| 0.69 | 6.88 |
| 0.69 | 6.88 |
| 0.69 | 6.88 |
| 0.69 | 6.88 |
| 0.69 | 6.88 |
| 0.69 | 6.88 |
| 0.69 | 6.88 |
| 0.69 | 6.88 |
| 0.69 | 6.88 |
| 0.69 | 6.88 |
| 0.69 | 6.88 |
| 0.69 | 6.88 |
| 0.69 | 6.88 |
| 0.69 | 6.88 |
| 0.69 | 6.88 |
| 0.69 | 6.88 |
| 0.69 | 6.88 |
| 0.69 | 6.88 |
| 0.69 | 6.88 |
| 0.69 | 6.88 |
| 0.69 | 6.88 |
| 0.69 | 6.88 |
| 0.69 | 6.88 |
| 0.69 | 6.88 |
| 0.69 | 6.88 |
| 0.69 | 6.88 |
| 0.69 | 6.88 |
| 0.69 | 6.88 |
| 0.69 | 6.88 |
| 0.69 | 6.88 |
| 0.69 | 6.88 |
| 0.69 | 6.88 |
| 0.69 | 6.88 |
| 0.69 | 6.88 |
| 0.69 | 6.88 |
| 0.69 | 6.88 |
| 0.0 | 6.98 |
| 0.0 | 6.98 |
| 0.0 | 6.98 |
| 0.0 | 6.98 |
| 0.0 | 6.98 |
| 0.0 | 6.98 |
| 0.0 | 6.98 |
| 0.0 | 6.98 |
| 0.0 | 6.98 |
| 0.0 | 6.98 |
| 0.0 | 6.98 |
| 0.0 | 6.98 |
| 0.0 | 6.98 |
| 0.0 | 6.98 |
| 0.0 | 6.98 |
| 0.0 | 6.98 |
| 0.0 | 6.98 |
| 0.0 | 6.98 |
| 0.0 | 6.98 |
| 0.0 | 6.98 |
| 0.0 | 6.98 |
| 0.0 | 6.98 |
| 0.0 | 6.98 |
| 0.0 | 6.98 |
| 0.0 | 6.98 |
| 0.0 | 6.98 |
| 0.0 | 6.98 |
| 0.0 | 6.98 |
| 0.0 | 6.98 |
| 0.0 | 6.98 |
| 0.0 | 6.98 |
| 0.0 | 6.98 |
| 0.0 | 6.98 |
| 0.0 | 6.98 |
| 0.0 | 6.98 |
| 0.0 | 6.98 |
| 0.0 | 6.98 |
| 0.0 | 6.98 |
| 0.0 | 6.98 |
| 0.0 | 6.98 |
| 0.0 | 6.98 |
| 0.0 | 6.98 |
| 0.0 | 6.98 |
| 0.0 | 6.98 |
| 0.0 | 6.98 |
| 0.0 | 6.98 |
| 0.0 | 6.98 |
| 0.0 | 6.98 |
| 0.0 | 6.98 |
| 0.0 | 6.98 |
| 0.0 | 6.98 |
| 0.0 | 6.98 |
| 0.0 | 6.98 |
| 0.0 | 6.98 |
| 0.0 | 6.98 |
| 0.0 | 6.98 |
| 0.0 | 6.98 |
| 0.0 | 6.98 |
| 0.0 | 6.98 |
| 0.0 | 6.98 |
| 0.0 | 6.98 |
| 0.0 | 6.98 |
| 0.0 | 6.98 |
| 0.0 | 6.98 |
| 0.0 | 6.98 |
| 0.0 | 6.98 |
| 0.0 | 6.98 |
| 0.0 | 6.98 |
| 0.0 | 6.98 |
| 0.0 | 6.98 |
| 0.0 | 6.98 |
| 0.0 | 6.98 |
| 0.0 | 6.98 |
| 0.0 | 6.98 |
| 0.0 | 6.98 |
| 0.0 | 6.98 |
| 0.0 | 6.98 |
| 0.0 | 6.98 |
| 0.0 | 6.98 |
| 0.0 | 6.98 |
| 0.0 | 6.98 |
| 0.0 | 6.98 |
| 0.0 | 6.98 |
| 0.0 | 6.98 |
| 0.0 | 6.98 |
| 0.0 | 6.98 |
| 0.0 | 6.98 |
| 0.0 | 6.98 |
| 0.0 | 6.98 |
| 0.0 | 6.98 |
| 0.0 | 6.98 |
| 0.0 | 6.98 |
| 0.0 | 6.98 |
| 0.0 | 6.98 |
| 0.0 | 6.98 |
| 0.0 | 6.98 |
| 0.0 | 6.98 |
| 0.0 | 6.98 |
| 0.0 | 6.98 |
| 0.0 | 6.98 |
| 0.0 | 6.98 |
| 0.0 | 6.98 |
| 0.0 | 6.98 |
| 0.0 | 6.98 |
| 0.0 | 6.98 |
| 0.0 | 6.98 |
| 0.0 | 6.98 |
| 0.0 | 6.98 |
| 0.0 | 6.98 |
| 0.0 | 6.98 |
| 0.0 | 6.98 |
| 0.0 | 6.98 |
| 0.0 | 6.98 |
| 0.0 | 6.98 |
| 0.0 | 6.98 |
| 0.0 | 6.98 |
| 0.0 | 6.98 |
| 0.0 | 6.98 |
| 0.0 | 6.98 |
| 0.0 | 6.98 |
| 0.0 | 6.98 |
| 0.0 | 6.98 |
| 0.0 | 6.98 |
| 0.0 | 6.98 |
| 0.0 | 6.98 |
| 0.0 | 6.98 |
| 0.0 | 6.98 |
| 0.0 | 6.98 |
| 0.0 | 6.98 |
| 0.0 | 6.98 |
| 0.0 | 6.98 |
| 0.0 | 6.98 |
| 0.0 | 6.98 |
| 0.0 | 6.98 |
| 0.0 | 6.98 |
| 0.0 | 6.98 |
| 0.0 | 6.98 |
| 0.0 | 6.98 |
| 0.0 | 6.98 |
| 0.0 | 6.98 |
| 0.0 | 6.98 |
| 0.0 | 6.98 |
| 0.0 | 6.98 |
| 0.0 | 6.98 |
| 0.0 | 6.98 |
| 0.0 | 6.98 |
| 0.0 | 6.98 |
| 0.0 | 6.98 |
| 0.0 | 6.98 |
| 0.0 | 6.98 |
| 0.0 | 6.98 |
| 0.0 | 6.98 |
| 0.0 | 6.98 |
| 0.0 | 6.98 |
| 0.0 | 6.98 |
| 0.0 | 6.98 |
| 0.0 | 6.98 |
| 0.0 | 6.98 |
| 0.0 | 6.98 |
| 0.0 | 6.98 |
| 0.0 | 6.98 |
| 0.0 | 6.98 |
| 0.0 | 6.98 |
| 0.0 | 6.98 |
| 0.0 | 6.98 |
| 0.0 | 6.98 |
| 0.0 | 6.98 |
| 0.0 | 6.98 |
| 0.0 | 6.98 |
| 0.0 | 6.98 |
| 0.0 | 6.98 |
| 0.0 | 6.98 |
| 0.0 | 6.98 |
| 0.0 | 6.98 |
| 0.0 | 6.98 |
| 0.0 | 6.98 |
| 0.0 | 6.98 |
| 0.0 | 6.98 |
| 0.0 | 6.98 |
| 0.0 | 6.98 |
| 0.0 | 6.98 |
| 0.0 | 6.98 |
| 0.0 | 6.98 |
| 0.0 | 6.98 |
| 0.0 | 6.98 |
| 0.0 | 6.98 |
| 0.0 | 6.98 |
| 0.0 | 6.98 |
| 0.0 | 6.98 |
| 0.0 | 6.98 |
| 0.0 | 6.98 |
| 0.0 | 6.98 |
| 0.0 | 6.98 |
| 0.0 | 6.98 |
| 0.0 | 6.98 |
| 0.0 | 6.98 |
| 0.0 | 6.98 |
| 0.0 | 6.98 |
| 0.0 | 6.98 |
| 0.0 | 6.98 |
| 0.0 | 6.98 |
| 0.0 | 6.98 |
| 0.0 | 6.98 |
| 0.0 | 6.98 |
| 0.0 | 6.98 |
| 0.0 | 6.98 |
| 0.0 | 6.98 |
| 0.0 | 6.98 |
| 0.0 | 6.98 |
| 0.0 | 6.98 |
| 0.0 | 6.98 |
| 0.0 | 6.98 |
| 0.0 | 6.98 |
| 0.0 | 6.98 |
| 0.0 | 6.98 |
| 0.0 | 6.98 |
| 0.0 | 6.98 |
| 0.0 | 6.98 |
| 0.0 | 6.98 |
| 0.0 | 6.98 |
| 0.0 | 6.98 |
| 0.0 | 6.98 |
| 0.0 | 6.98 |
| 0.0 | 6.98 |
| 0.0 | 6.98 |
| 0.0 | 6.98 |
| 0.0 | 6.98 |
| 0.0 | 6.98 |
| 0.0 | 6.98 |
| 0.0 | 6.98 |
| 0.0 | 6.98 |
| 0.0 | 6.98 |
| 0.0 | 6.98 |
| 0.0 | 6.98 |
| 0.0 | 6.98 |
| 0.0 | 6.98 |
| 0.0 | 6.98 |
| 0.0 | 6.98 |
| 0.0 | 6.98 |
| 0.0 | 6.98 |
| 0.0 | 6.98 |
| 0.0 | 6.98 |
| 0.0 | 6.98 |
| 0.0 | 6.98 |
| 0.0 | 6.98 |
| 0.0 | 6.98 |
| 0.0 | 6.98 |
| 0.0 | 6.98 |
| 0.0 | 6.98 |
| 0.0 | 6.98 |
| 0.0 | 6.98 |
| 0.0 | 6.98 |
| 0.0 | 6.98 |
| 0.0 | 6.98 |
| 0.0 | 6.98 |
| 0.0 | 6.98 |
| 0.0 | 6.98 |
| 0.0 | 6.98 |
| 0.0 | 6.98 |
| 0.0 | 6.98 |
| 0.0 | 6.98 |
| 0.0 | 6.98 |
| 0.0 | 6.98 |
| 0.0 | 6.98 |
| 0.0 | 6.98 |
| 0.0 | 6.98 |
| 0.0 | 6.98 |
| 0.0 | 6.98 |
| 0.0 | 6.98 |
| 0.0 | 6.98 |
| 0.0 | 6.98 |
| 0.0 | 6.98 |
| 0.0 | 6.98 |
| 0.0 | 6.98 |
| 0.0 | 6.98 |
| 0.0 | 6.98 |
| 0.0 | 6.98 |
| 0.0 | 6.98 |
| 0.0 | 6.98 |
| 0.0 | 6.98 |
| 0.0 | 6.98 |
| 0.0 | 6.98 |
| 0.0 | 6.98 |
| 0.0 | 6.98 |
| 0.0 | 6.98 |
| 0.0 | 6.98 |
| 0.0 | 6.98 |
| 0.0 | 6.98 |
| 0.0 | 6.98 |
| 0.0 | 6.98 |
| 0.0 | 6.98 |
| 0.0 | 6.98 |
| 0.0 | 6.98 |
| 0.0 | 6.98 |
| 0.0 | 6.98 |
| 0.0 | 6.98 |
| 0.0 | 6.98 |
| 0.0 | 6.98 |
| 0.0 | 6.98 |
| 0.0 | 6.98 |
| 0.0 | 6.98 |
| 0.0 | 6.98 |
| 0.0 | 6.98 |
| 0.0 | 6.98 |
| 0.0 | 6.98 |
| 0.0 | 6.98 |
| 0.0 | 6.98 |
| 0.0 | 6.98 |
| 0.0 | 6.98 |
| 0.0 | 6.98 |
| 0.0 | 6.98 |
| 0.0 | 6.98 |
| 0.0 | 6.98 |
| 0.0 | 6.98 |
| 0.0 | 6.98 |
| 0.0 | 6.98 |
| 0.0 | 6.98 |
| 0.0 | 6.98 |
| 0.0 | 6.98 |
| 0.0 | 6.98 |
| 0.0 | 6.98 |
| 0.0 | 6.98 |
| 0.0 | 6.98 |
| 0.0 | 6.98 |
| 0.0 | 6.98 |
| 0.0 | 6.98 |
| 0.0 | 6.98 |
| 0.0 | 6.98 |
| 0.0 | 6.98 |
| 0.0 | 6.98 |
| 0.0 | 6.98 |
| 0.0 | 6.98 |
| 0.0 | 6.98 |
| 0.0 | 6.98 |
| 0.0 | 6.98 |
| 0.0 | 6.98 |
| 0.0 | 6.98 |
| 0.0 | 6.98 |
| 0.0 | 6.98 |
| 0.0 | 6.98 |
| 0.0 | 6.98 |
| 0.0 | 6.98 |
| 0.0 | 6.98 |
| 0.0 | 6.98 |
| 0.0 | 6.98 |
| 0.0 | 6.98 |
| 0.0 | 6.98 |
| 0.0 | 6.98 |
| 0.0 | 6.98 |
| 0.0 | 6.98 |
| 0.0 | 6.98 |
| 0.0 | 6.98 |
| 0.0 | 6.98 |
| 0.0 | 6.98 |
| 0.0 | 6.98 |
| 0.0 | 6.98 |
| 0.0 | 6.98 |
| 0.0 | 6.98 |
| 0.0 | 6.98 |
| 0.0 | 6.98 |
| 0.0 | 6.98 |
| 0.0 | 6.98 |
| 0.0 | 6.98 |
| 0.0 | 6.98 |
| 0.0 | 6.98 |
| 0.0 | 6.98 |
| 0.0 | 6.98 |
| 0.0 | 6.98 |
| 0.0 | 6.98 |
| 0.0 | 6.98 |
| 0.0 | 6.98 |
| 0.0 | 6.98 |
| 0.0 | 6.98 |
| 0.0 | 6.98 |
| 0.0 | 6.98 |
| 0.0 | 6.98 |
| 0.0 | 6.98 |
| 0.0 | 6.98 |
| 0.0 | 6.98 |
| 0.0 | 6.98 |
| 0.0 | 6.98 |
| 0.0 | 6.98 |
| 0.0 | 6.98 |
| 0.0 | 6.98 |
| 0.0 | 6.98 |
| 0.0 | 6.98 |
| 0.0 | 6.98 |
| 0.0 | 6.98 |
| 0.0 | 6.98 |
| 0.0 | 6.98 |
| 0.0 | 6.98 |
| 0.0 | 6.98 |
| 0.0 | 6.98 |
| 0.0 | 6.98 |
| 0.0 | 6.98 |
| 0.0 | 6.98 |
| 0.0 | 6.98 |
| 0.0 | 6.98 |
| 0.0 | 6.98 |
| 0.0 | 6.98 |
| 0.0 | 6.98 |
| 0.0 | 6.98 |
| 0.0 | 6.98 |
| 0.0 | 6.98 |
| 0.0 | 6.98 |
| 0.0 | 6.98 |
| 0.0 | 6.98 |
| 0.0 | 6.98 |
| 0.0 | 6.98 |
| 0.0 | 6.98 |
| 0.0 | 6.98 |
| 0.0 | 6.98 |
| 0.0 | 6.98 |
| 0.0 | 6.98 |
| 0.0 | 6.98 |
| 0.0 | 6.98 |
| 0.0 | 6.98 |
| 0.0 | 6.98 |
| 0.0 | 6.98 |
| 0.0 | 6.98 |
| 0.0 | 6.98 |
| 0.0 | 6.98 |
| 0.0 | 6.98 |
| 0.0 | 6.98 |
| 0.0 | 6.98 |
| 0.0 | 6.98 |
| 0.0 | 6.98 |
| 0.0 | 6.98 |
| 0.0 | 6.98 |
| 0.0 | 6.98 |
| 0.0 | 6.98 |
| 0.0 | 6.98 |
| 0.0 | 6.98 |
| 0.0 | 6.98 |
| 0.0 | 6.98 |
| 0.0 | 6.98 |
| 0.0 | 6.98 |
| 0.0 | 6.98 |
| 0.0 | 6.98 |
| 0.0 | 6.98 |
| 0.0 | 6.98 |
| 0.0 | 6.98 |
| 0.0 | 6.98 |
| 0.0 | 6.98 |
| 0.0 | 6.98 |
| 0.0 | 6.98 |
| 0.0 | 6.98 |
| 0.0 | 6.98 |
| 0.0 | 6.98 |
| 0.0 | 6.98 |
| 0.0 | 6.98 |
| 0.0 | 6.98 |
| 0.0 | 6.98 |
| 0.0 | 6.98 |
| 0.0 | 6.98 |
| 0.0 | 6.98 |
| 0.0 | 6.98 |
| 0.0 | 6.98 |
| 0.0 | 6.98 |
| 0.0 | 6.98 |
| 0.0 | 6.98 |
| 0.0 | 6.98 |
| 0.0 | 6.98 |
| 0.0 | 6.98 |
| 0.0 | 6.98 |
| 0.0 | 6.98 |
| 0.0 | 6.98 |
| 0.0 | 6.98 |
| 0.0 | 6.98 |
| 0.0 | 6.98 |
| 0.0 | 6.98 |
| 0.0 | 6.98 |
| 0.0 | 6.98 |
| 0.0 | 6.98 |
| 0.0 | 6.98 |
| 0.0 | 6.98 |
| 0.0 | 6.98 |
| 0.0 | 6.98 |
| 0.0 | 6.98 |
| 0.0 | 6.98 |
| 0.0 | 6.98 |
| 0.0 | 6.98 |
| 0.0 | 6.98 |
| 0.0 | 6.98 |
| 0.0 | 6.98 |
| 0.0 | 6.98 |
| 0.0 | 6.98 |
| 0.0 | 6.98 |
| 0.0 | 6.98 |
| 0.0 | 6.98 |
| 0.0 | 6.98 |
| 0.0 | 6.98 |
| 0.0 | 6.98 |
| 0.0 | 6.98 |
| 0.0 | 6.98 |
| 0.0 | 6.98 |
| 0.0 | 6.98 |
| 0.0 | 6.98 |
| 0.0 | 6.98 |
| 0.0 | 6.98 |
| 0.0 | 6.98 |
| 0.0 | 6.98 |
| 0.0 | 6.98 |
| 0.0 | 6.98 |
| 0.0 | 6.98 |
| 0.0 | 6.98 |
| 0.0 | 6.98 |
| 0.0 | 6.98 |
| 0.0 | 6.98 |
| 0.0 | 6.98 |
| 0.0 | 6.98 |
| 0.0 | 6.98 |
| 0.0 | 6.98 |
| 0.0 | 6.98 |
| 0.0 | 6.98 |
| 0.0 | 6.98 |
| 0.0 | 6.98 |
| 0.0 | 6.98 |
| 0.0 | 6.98 |
| 0.0 | 6.98 |
| 0.0 | 6.98 |
| 0.0 | 6.98 |
| 0.0 | 6.98 |
| 0.0 | 6.98 |
| 0.0 | 6.98 |
| 0.0 | 6.98 |
| 0.0 | 6.98 |
| 0.0 | 6.98 |
| 0.0 | 6.98 |
| 0.0 | 6.98 |
| 0.0 | 6.98 |
| 0.0 | 6.98 |
| 0.0 | 6.98 |
| 0.0 | 6.98 |
| 0.0 | 6.98 |
| 0.0 | 6.98 |
| 0.0 | 6.98 |
| 0.0 | 6.98 |
| 0.0 | 6.98 |
| 0.0 | 6.98 |
| 0.0 | 6.98 |
| 0.0 | 6.98 |
| 0.0 | 6.98 |
| 0.0 | 6.98 |
| 0.0 | 6.98 |
| 0.0 | 6.98 |
| 0.0 | 6.98 |
| 0.0 | 6.98 |
| 0.0 | 6.98 |
| 0.0 | 6.98 |
| 0.0 | 6.98 |
| 0.0 | 6.98 |
| 0.0 | 6.98 |
| 0.0 | 6.98 |
| 0.0 | 6.98 |
| 0.0 | 6.98 |
| 0.0 | 6.98 |
| 0.0 | 6.98 |
| 0.0 | 6.98 |
| 0.0 | 6.98 |
| 0.0 | 6.98 |
| 0.0 | 6.98 |
| 0.0 | 6.98 |
| 0.0 | 6.98 |
| 0.0 | 6.98 |
| 0.0 | 6.98 |
| 0.0 | 6.98 |
| 0.0 | 6.98 |
| 0.0 | 6.98 |
| 0.0 | 6.98 |
| 0.0 | 6.98 |
| 0.0 | 6.98 |
| 0.0 | 6.98 |
| 0.0 | 6.98 |
| 0.0 | 6.98 |
| 0.0 | 6.98 |
| 0.0 | 6.98 |
| 0.0 | 6.98 |
| 0.0 | 6.98 |
| 0.0 | 6.98 |
| 0.0 | 6.98 |
| 0.0 | 6.98 |
| 0.0 | 6.98 |
| 0.0 | 6.98 |
| 0.0 | 6.98 |
| 0.0 | 6.98 |
| 0.0 | 6.98 |
| 0.0 | 6.98 |
| 0.0 | 6.98 |
| 0.0 | 6.98 |
| 0.0 | 6.98 |
| 0.0 | 6.98 |
| 0.0 | 6.98 |
| 0.0 | 6.98 |
| 0.0 | 6.98 |
| 0.0 | 6.98 |
| 0.0 | 6.98 |
| 0.0 | 6.98 |
| 0.0 | 6.98 |
| 0.0 | 6.98 |
| 0.0 | 6.98 |
| 0.0 | 6.98 |
| 0.0 | 6.98 |
| 0.0 | 6.98 |
| 0.0 | 6.98 |
| 0.0 | 6.98 |
| 0.0 | 6.98 |
| 0.0 | 6.98 |
| 0.0 | 6.98 |
| 0.0 | 6.98 |
| 0.0 | 6.98 |
| 0.0 | 6.98 |
| 0.0 | 6.98 |
| 0.0 | 6.98 |
| 0.0 | 6.98 |
| 0.0 | 6.98 |
| 0.0 | 6.98 |
| 0.0 | 6.98 |
| 0.0 | 6.98 |
| 0.0 | 6.98 |
| 0.0 | 6.98 |
| 0.0 | 6.98 |
| 0.0 | 6.98 |
| 0.0 | 6.98 |
| 0.0 | 6.98 |
| 0.0 | 6.98 |
| 0.0 | 6.98 |
| 0.0 | 6.98 |
| 0.0 | 6.98 |
| 0.0 | 6.98 |
| 0.0 | 6.98 |
| 0.0 | 6.98 |
| 0.0 | 6.98 |
| 0.0 | 6.98 |
| 0.0 | 6.98 |
| 0.0 | 6.98 |
| 0.0 | 6.98 |
| 0.0 | 6.98 |
| 0.0 | 6.98 |
| 0.0 | 6.98 |
| 0.0 | 6.98 |
| 0.0 | 6.98 |
| 0.0 | 6.98 |
| 0.0 | 6.98 |
| 0.0 | 6.98 |
| 0.0 | 6.98 |
| 0.0 | 6.98 |
| 0.0 | 6.98 |
| 0.0 | 6.98 |
| 0.0 | 6.98 |
| 0.0 | 6.98 |
| 0.0 | 6.98 |
| 0.0 | 6.98 |
| 0.0 | 6.98 |
| 0.0 | 6.98 |
| 0.0 | 6.98 |
| 0.0 | 6.98 |
| 0.0 | 6.98 |
| 0.0 | 6.98 |
| 0.0 | 6.98 |
| 0.0 | 6.98 |
| 0.0 | 6.98 |
| 0.0 | 6.98 |
| 0.0 | 6.98 |
| 0.0 | 6.98 |
| 0.0 | 6.98 |
| 0.0 | 6.98 |
| 0.0 | 6.98 |
| 0.0 | 6.98 |
| 0.0 | 6.98 |
| 0.0 | 6.98 |
| 0.0 | 6.98 |
| 0.0 | 6.98 |
| 0.0 | 6.98 |
| 0.0 | 6.98 |
| 0.0 | 6.98 |
| 0.0 | 6.98 |
| 0.0 | 6.98 |
| 0.0 | 6.98 |
| 0.0 | 6.98 |
| 0.0 | 6.98 |
| 0.0 | 6.98 |
| 0.0 | 6.98 |
| 0.0 | 6.98 |
| 0.0 | 6.98 |
| 0.0 | 6.98 |
| 0.0 | 6.98 |
| 0.0 | 6.98 |
| 0.0 | 6.98 |
| 0.0 | 6.98 |
| 0.0 | 6.98 |
| 0.0 | 6.98 |
| 0.0 | 6.98 |
| 0.0 | 6.98 |
| 0.0 | 6.98 |
| 0.0 | 6.98 |
| 0.0 | 6.98 |
| 0.0 | 6.98 |
| 0.0 | 6.98 |
| 0.0 | 6.98 |
| 0.0 | 6.98 |
| 0.0 | 6.98 |
| 0.0 | 6.98 |
| 0.0 | 6.98 |
| 0.0 | 6.98 |
| 0.0 | 6.98 |
| 0.0 | 6.98 |
| 0.0 | 6.98 |
| 0.0 | 6.98 |
| 0.0 | 6.98 |
| 0.0 | 6.98 |
| 0.0 | 6.98 |
| 0.0 | 6.98 |
| 0.0 | 6.98 |
| 0.0 | 6.98 |
| 0.0 | 6.98 |
| 0.0 | 6.98 |
| 0.0 | 6.98 |
| 0.0 | 6.98 |
| 0.0 | 6.98 |
| 0.0 | 6.98 |
| 0.0 | 6.98 |
| 0.0 | 6.98 |
| 0.0 | 6.98 |
| 0.0 | 6.98 |
| 0.0 | 6.98 |
| 0.0 | 6.98 |
| 0.0 | 6.98 |
| 0.0 | 6.98 |
| 0.0 | 6.98 |
| 0.0 | 6.98 |
| 0.0 | 6.98 |
| 0.0 | 6.98 |
| 0.0 | 6.98 |
| 0.0 | 6.98 |
| 0.0 | 6.98 |
| 0.0 | 6.98 |
| 0.0 | 6.98 |
| 0.0 | 6.98 |
| 0.0 | 6.98 |
| 0.0 | 6.98 |
| 0.0 | 6.98 |
| 0.0 | 6.98 |
| 0.0 | 6.98 |
| 0.0 | 6.98 |
| 0.0 | 6.98 |
| 0.0 | 6.98 |
| 0.0 | 6.98 |
| 0.0 | 6.98 |
| 0.0 | 6.98 |
| 0.0 | 6.98 |
| 0.0 | 6.98 |
| 0.0 | 6.98 |
| 0.0 | 6.98 |
| 0.0 | 6.98 |
| 0.0 | 6.98 |
| 0.0 | 6.98 |
| 0.0 | 6.98 |
| 0.0 | 6.98 |
| 0.0 | 6.98 |
| 0.0 | 6.98 |
| 0.0 | 6.98 |
| 0.0 | 6.98 |
| 0.0 | 6.98 |
| 0.0 | 6.98 |
| 0.0 | 6.98 |
| 0.0 | 6.98 |
| 0.0 | 6.98 |
| 0.0 | 6.98 |
| 0.0 | 6.98 |
| 0.0 | 6.98 |
| 0.0 | 6.98 |
| 0.0 | 6.98 |
| 0.0 | 6.98 |
| 0.0 | 6.98 |
| 0.0 | 6.98 |
| 0.0 | 6.98 |
| 0.0 | 6.98 |
| 0.0 | 6.98 |
| 0.0 | 6.98 |
| 0.0 | 6.98 |
| 0.0 | 6.98 |
| 0.0 | 6.98 |
| 0.0 | 6.98 |
| 0.0 | 6.98 |
| 0.0 | 6.98 |
| 0.0 | 6.98 |
| 0.0 | 6.98 |
| 0.0 | 6.98 |
| 0.0 | 6.98 |
| 0.0 | 6.98 |
| 0.0 | 6.98 |
| 0.0 | 6.98 |
| 0.0 | 6.98 |
| 0.0 | 6.98 |
| 0.0 | 6.98 |
| 0.0 | 6.98 |
| 0.0 | 6.98 |
| 0.0 | 6.98 |
| 0.0 | 6.98 |
| 0.0 | 6.98 |
| 0.0 | 6.98 |
| 0.0 | 6.98 |
| 0.0 | 6.98 |
| 0.0 | 6.98 |
| 0.0 | 6.98 |
| 0.0 | 6.98 |
| 0.0 | 6.98 |
| 0.0 | 6.98 |
| 0.0 | 6.98 |
| 0.0 | 6.98 |
| 0.0 | 6.98 |
| 0.0 | 6.98 |
| 0.0 | 6.98 |
| 0.0 | 6.98 |
| 0.0 | 6.98 |
| 0.0 | 6.98 |
| 0.0 | 6.98 |
| 0.0 | 6.98 |
| 0.0 | 6.98 |
| 0.0 | 6.98 |
| 0.0 | 6.98 |
| 0.0 | 6.98 |
| 0.0 | 6.98 |
| 0.0 | 6.98 |
| 0.0 | 6.98 |
| 0.0 | 6.98 |
| 0.0 | 6.98 |
| 0.0 | 6.98 |
| 0.0 | 6.98 |
| 0.0 | 6.98 |
| 0.0 | 6.98 |
| 0.0 | 6.98 |
| 0.0 | 6.98 |
| 0.0 | 6.98 |
| 0.0 | 6.98 |
| 0.0 | 6.98 |
| 0.0 | 6.98 |
| 0.0 | 6.98 |
| 0.0 | 6.98 |
| 0.0 | 6.98 |
| 0.0 | 6.98 |
| 0.0 | 6.98 |
| 0.0 | 6.98 |
| 0.0 | 6.98 |
| 0.0 | 6.98 |
| 0.0 | 6.98 |
| 0.0 | 6.98 |
| 0.0 | 6.98 |
| 0.0 | 6.98 |
| 0.0 | 6.98 |
| 0.0 | 6.98 |
| 0.0 | 6.98 |
| 0.0 | 6.98 |
| 0.0 | 6.98 |
| 0.0 | 6.98 |
| 0.0 | 6.98 |
| 0.0 | 6.98 |
| 0.0 | 6.98 |
| 0.0 | 6.98 |
| 0.0 | 6.98 |
| 0.0 | 6.98 |
| 0.0 | 6.98 |
| 0.0 | 6.98 |
| 0.0 | 6.98 |
| 0.0 | 6.98 |
| 0.0 | 6.98 |
| 0.0 | 6.98 |
| 0.0 | 6.98 |
| 0.0 | 6.98 |
| 0.0 | 6.98 |
| 0.0 | 6.98 |
| 0.0 | 6.98 |
| 0.0 | 6.98 |
| 0.0 | 6.98 |
| 0.0 | 6.98 |
| 0.0 | 6.98 |
| 0.0 | 6.98 |
| 0.0 | 6.98 |
| 0.0 | 6.98 |
| 0.0 | 6.98 |
| 0.0 | 6.98 |
| 0.0 | 6.98 |
| 0.0 | 6.98 |
| 0.0 | 6.98 |
| 0.0 | 6.98 |
| 0.0 | 6.98 |
| 0.0 | 6.98 |
| 0.0 | 6.98 |
| 0.0 | 6.98 |
| 0.0 | 6.98 |
| 0.0 | 6.98 |
| 0.0 | 6.98 |
| 0.0 | 6.98 |
| 0.0 | 6.98 |
| 0.0 | 6.98 |
| 0.0 | 6.98 |
| 0.0 | 6.98 |
| 0.0 | 6.98 |
| 0.0 | 6.98 |
| 0.0 | 6.98 |
| 0.0 | 6.98 |
| 0.0 | 6.98 |
| 0.0 | 6.98 |
| 0.0 | 6.98 |
| 0.0 | 6.98 |
| 0.0 | 6.98 |
| 0.0 | 6.98 |
| 0.0 | 6.98 |
| 0.0 | 6.98 |
| 0.0 | 6.98 |
| 0.0 | 6.98 |
| 0.0 | 6.98 |
| 0.0 | 6.98 |
| 0.0 | 6.98 |
| 0.0 | 6.98 |
| 0.0 | 6.98 |
| 0.0 | 6.98 |
| 0.0 | 6.98 |
| 0.0 | 6.98 |
| 0.0 | 6.98 |
| 0.0 | 6.98 |
| 0.0 | 6.98 |
| 0.0 | 6.98 |
| 0.0 | 6.98 |
| 0.0 | 6.98 |
| 0.0 | 6.98 |
| 0.0 | 6.98 |
| 0.0 | 6.98 |
| 0.0 | 6.98 |
| 0.0 | 6.98 |
| 0.0 | 6.98 |
| 0.0 | 6.98 |
| 0.0 | 6.98 |
| 0.0 | 6.98 |
| 0.0 | 6.98 |
| 0.0 | 6.98 |
| 0.0 | 6.98 |
| 0.0 | 6.98 |
| 0.0 | 6.98 |
| 0.0 | 6.98 |
| 0.0 | 6.98 |
| 0.0 | 6.98 |
| 0.0 | 6.98 |
| 0.0 | 6.98 |
| 0.0 | 6.98 |
| 0.0 | 6.98 |
| 0.0 | 6.98 |
| 0.0 | 6.98 |
| 0.0 | 6.98 |
| 0.0 | 6.98 |
| 0.0 | 6.98 |
| 0.0 | 6.98 |
| 0.0 | 6.98 |
| 0.0 | 6.98 |
| 0.0 | 6.98 |
| 0.0 | 6.98 |
| 0.0 | 6.98 |
| 0.0 | 6.98 |
| 0.0 | 6.98 |
| 0.0 | 6.98 |
| 0.0 | 6.98 |
| 0.0 | 6.98 |
| 0.0 | 6.98 |
| 0.0 | 6.98 |
| 0.0 | 6.98 |
| 0.0 | 6.98 |
| 0.0 | 6.98 |
| 0.0 | 6.98 |
| 0.0 | 6.98 |
| 0.0 | 6.98 |
| 0.0 | 6.98 |
| 0.0 | 6.98 |
| 0.0 | 6.98 |
| 0.0 | 6.98 |
| 0.0 | 6.98 |
| 0.0 | 6.98 |
| 0.0 | 6.98 |
| 0.0 | 6.98 |
| 0.0 | 6.98 |
| 0.0 | 6.98 |
| 0.0 | 6.98 |
| 0.0 | 6.98 |
| 0.0 | 6.98 |
| 0.0 | 6.98 |
| 0.0 | 6.98 |
| 0.0 | 6.98 |
| 0.0 | 6.98 |
| 0.0 | 6.98 |
| 0.0 | 6.98 |
| 0.0 | 6.98 |
| 0.0 | 6.98 |
| 0.0 | 6.98 |
| 0.0 | 6.98 |
| 0.0 | 6.98 |
| 0.0 | 6.98 |
| 0.0 | 6.98 |
| 0.0 | 6.98 |
| 0.0 | 6.98 |
| 0.0 | 6.98 |
| 0.0 | 6.98 |
| 0.0 | 6.98 |
| 0.0 | 6.98 |
| 0.0 | 6.98 |
| 0.0 | 6.98 |
| 0.0 | 6.98 |
| 0.0 | 6.98 |
| 0.0 | 6.98 |
| 0.0 | 6.98 |
| 0.0 | 6.98 |
| 0.0 | 6.98 |
| 0.0 | 6.98 |
| 0.0 | 6.98 |
| 0.0 | 6.98 |
| 0.0 | 6.98 |
| 0.0 | 6.98 |
| 0.0 | 6.98 |
| 0.0 | 6.98 |
| 0.0 | 6.98 |
| 0.0 | 6.98 |
| 0.0 | 6.98 |
| 0.0 | 6.98 |
| 0.0 | 6.98 |
| 0.0 | 6.98 |
| 0.0 | 6.98 |
| 0.0 | 6.98 |
| 0.0 | 6.98 |
| 0.0 | 6.98 |
| 0.0 | 6.98 |
| 0.0 | 6.98 |
| 0.0 | 6.98 |
| 0.0 | 6.98 |
| 0.0 | 6.98 |
| 0.0 | 6.98 |
| 0.0 | 6.98 |
| 0.0 | 6.98 |
| 0.0 | 6.98 |
| 0.0 | 6.98 |
| 0.0 | 6.98 |
| 0.0 | 6.98 |
| 0.0 | 6.98 |
| 0.0 | 6.98 |
| 0.0 | 6.98 |
| 0.0 | 6.98 |
| 0.0 | 6.98 |
| 0.0 | 6.98 |
| 0.0 | 6.98 |
| 0.0 | 6.98 |
| 0.0 | 6.98 |
| 0.0 | 6.98 |
| 0.0 | 6.98 |
| 0.0 | 6.98 |
| 0.0 | 6.98 |
| 0.0 | 6.98 |
| 0.0 | 6.98 |
| 0.0 | 6.98 |
| 0.0 | 6.98 |
| 0.0 | 6.98 |
| 0.0 | 6.98 |
| 0.0 | 6.98 |
| 0.0 | 6.98 |
| 0.0 | 6.98 |
| 0.0 | 6.98 |
| 0.0 | 6.98 |
| 0.0 | 6.98 |
| 0.0 | 6.98 |
| 0.0 | 6.98 |
| 0.0 | 6.98 |
| 0.0 | 6.98 |
| 0.0 | 6.98 |
| 0.0 | 6.98 |
| 0.0 | 6.98 |
| 0.0 | 6.98 |
| 0.0 | 6.98 |